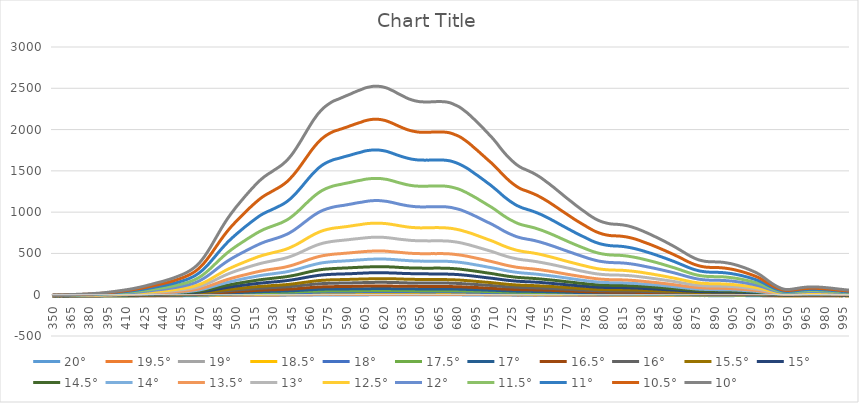
| Category | 20° | 19.5° | 19° | 18.5° | 18° | 17.5° | 17° | 16.5° | 16° | 15.5° | 15° | 14.5° | 14° | 13.5° | 13° | 12.5° | 12° | 11.5° | 11° | 10.5° | 10° |
|---|---|---|---|---|---|---|---|---|---|---|---|---|---|---|---|---|---|---|---|---|---|
| 350.0 | -14.12 | -13.06 | -13.47 | -14.27 | -15.23 | -12.29 | -13.53 | -12.34 | -11.98 | -10.71 | -12.75 | -11.33 | -9.83 | -10.75 | -7.95 | -10.6 | -8.52 | -8.73 | -7.92 | -4.6 | -3.1 |
| 351.0 | -13.4 | -13.62 | -12.17 | -12.87 | -13.31 | -12.71 | -11.76 | -13.88 | -12.12 | -12.04 | -11.78 | -10.11 | -9.74 | -11.48 | -10.71 | -9.3 | -8.31 | -6.99 | -4.18 | -4.71 | -3.92 |
| 352.0 | -12.77 | -13.93 | -12.12 | -12.86 | -11.66 | -11.99 | -12.03 | -10.67 | -12.13 | -11.35 | -10.86 | -11.17 | -10.57 | -8.08 | -8.22 | -8.61 | -6.39 | -5.67 | -5.34 | -3.62 | -1.31 |
| 353.0 | -15.87 | -14.71 | -15.8 | -16.76 | -14.29 | -12.58 | -13.43 | -13.05 | -13.61 | -13.51 | -14.03 | -11.54 | -11.85 | -9.96 | -9.48 | -8.54 | -10.51 | -8.49 | -6.8 | -4.38 | -3.21 |
| 354.0 | -14.12 | -13.88 | -15.52 | -12.59 | -13.76 | -11.77 | -12.15 | -12.26 | -12.67 | -11.52 | -10.52 | -10.05 | -10.63 | -9.02 | -10.3 | -8 | -7.07 | -7.08 | -5.34 | -3.76 | -3.27 |
| 355.0 | -13.75 | -11.49 | -12.72 | -14.1 | -13.72 | -11.17 | -12.41 | -10.61 | -12.85 | -11.52 | -10.76 | -10.37 | -10.99 | -9.19 | -8.16 | -8.68 | -6.35 | -5.72 | -3.61 | -1.74 | -1.97 |
| 356.0 | -14.75 | -14.93 | -12.93 | -14.52 | -14.4 | -13.66 | -12.28 | -12.63 | -11.14 | -9.34 | -11.79 | -11.2 | -9.72 | -10.8 | -9.21 | -9.75 | -6.76 | -6.54 | -4.06 | -3.68 | -3.2 |
| 357.0 | -15.14 | -15.33 | -14.71 | -14.51 | -15.45 | -13.01 | -14.16 | -12.75 | -12.87 | -13.17 | -11.63 | -12.29 | -11.07 | -12.54 | -8.02 | -9 | -7.21 | -6.91 | -5.08 | -3.59 | -4.48 |
| 358.0 | -15.31 | -14.47 | -13.71 | -14.72 | -14.58 | -14.17 | -14.89 | -14.73 | -13.41 | -13.1 | -11.59 | -11.94 | -11.24 | -10.42 | -7.7 | -10.43 | -8.12 | -6.58 | -5.95 | -2.91 | -3.84 |
| 359.0 | -13.37 | -14.84 | -11.93 | -13.97 | -13.81 | -12.65 | -10.67 | -13.48 | -12.01 | -10.49 | -13.4 | -11.95 | -10.54 | -9.7 | -10.14 | -7.52 | -6.99 | -5.34 | -6.18 | -2 | -0.93 |
| 360.0 | -13.91 | -13.7 | -13.19 | -13.52 | -13.01 | -12.35 | -12.28 | -12.02 | -11.83 | -11.23 | -11.28 | -10.64 | -9.74 | -9.66 | -7.98 | -8.09 | -6.41 | -5.21 | -3.55 | -1.9 | -0.22 |
| 361.0 | -13.94 | -13.72 | -13.23 | -13.44 | -12.94 | -12.37 | -12.31 | -12.02 | -11.88 | -11.26 | -11.26 | -10.64 | -9.59 | -9.54 | -8.05 | -7.98 | -6.23 | -4.96 | -3.26 | -1.67 | 0.12 |
| 362.0 | -13.96 | -13.72 | -13.21 | -13.47 | -12.91 | -12.31 | -12.31 | -11.9 | -11.79 | -11.18 | -11.17 | -10.62 | -9.62 | -9.32 | -7.79 | -7.77 | -6.08 | -4.65 | -3.05 | -1.29 | 0.58 |
| 363.0 | -13.84 | -13.6 | -13.24 | -13.43 | -12.87 | -12.23 | -12.23 | -11.92 | -11.7 | -11.1 | -11.08 | -10.54 | -9.48 | -9.25 | -7.6 | -7.54 | -5.76 | -4.41 | -2.61 | -0.83 | 0.93 |
| 364.0 | -13.74 | -13.49 | -13.06 | -13.26 | -12.88 | -12.26 | -12.17 | -11.9 | -11.57 | -11.01 | -10.98 | -10.42 | -9.33 | -9.12 | -7.48 | -7.43 | -5.52 | -4.06 | -2.2 | -0.58 | 1.28 |
| 365.0 | -13.66 | -13.4 | -12.95 | -13.23 | -12.85 | -12.3 | -12.1 | -11.9 | -11.5 | -10.96 | -10.88 | -10.33 | -9.26 | -9.05 | -7.35 | -7.37 | -5.3 | -3.82 | -1.94 | -0.28 | 1.77 |
| 366.0 | -13.66 | -13.43 | -12.86 | -13.12 | -12.72 | -12.35 | -12.09 | -11.86 | -11.33 | -10.88 | -10.83 | -10.21 | -9.13 | -8.85 | -7.23 | -7.13 | -4.98 | -3.52 | -1.65 | 0.02 | 2.3 |
| 367.0 | -13.68 | -13.42 | -13.01 | -13.03 | -12.7 | -12.29 | -12.16 | -11.86 | -11.42 | -10.88 | -10.84 | -10.18 | -9.11 | -8.77 | -7.13 | -6.92 | -4.82 | -3.36 | -1.5 | 0.32 | 2.75 |
| 368.0 | -13.57 | -13.27 | -12.91 | -12.92 | -12.55 | -12.19 | -12.01 | -11.84 | -11.25 | -10.7 | -10.81 | -10 | -8.86 | -8.56 | -7.1 | -6.72 | -4.4 | -3.07 | -1.14 | 0.72 | 3.43 |
| 369.0 | -13.5 | -13.29 | -12.99 | -12.89 | -12.5 | -12.13 | -11.84 | -11.73 | -11.19 | -10.63 | -10.76 | -9.8 | -8.69 | -8.47 | -7.06 | -6.56 | -4.14 | -2.76 | -0.75 | 1.07 | 4 |
| 370.0 | -13.6 | -13.19 | -13.06 | -12.79 | -12.34 | -12.1 | -11.83 | -11.59 | -11.15 | -10.65 | -10.48 | -9.63 | -8.57 | -8.34 | -6.81 | -6.38 | -3.84 | -2.44 | -0.18 | 1.53 | 4.59 |
| 371.0 | -13.62 | -13.1 | -12.99 | -12.64 | -12.27 | -12.24 | -11.87 | -11.52 | -10.95 | -10.61 | -10.25 | -9.59 | -8.5 | -8.11 | -6.65 | -6.06 | -3.57 | -2.11 | 0.27 | 1.99 | 5.11 |
| 372.0 | -13.52 | -13.18 | -12.98 | -12.61 | -12.29 | -12.23 | -11.9 | -11.63 | -10.84 | -10.61 | -10.18 | -9.45 | -8.51 | -7.95 | -6.54 | -5.94 | -3.47 | -1.73 | 0.56 | 2.46 | 5.57 |
| 373.0 | -13.29 | -12.91 | -12.69 | -12.51 | -12.03 | -12.05 | -11.75 | -11.48 | -10.52 | -10.37 | -10.02 | -9.24 | -8.24 | -7.72 | -6.18 | -5.65 | -2.89 | -1.25 | 1.21 | 3.22 | 6.31 |
| 374.0 | -13.28 | -12.89 | -12.71 | -12.47 | -11.96 | -11.98 | -11.64 | -11.37 | -10.45 | -10.23 | -9.92 | -9.14 | -7.97 | -7.47 | -5.86 | -5.33 | -2.52 | -0.8 | 1.67 | 3.86 | 7.01 |
| 375.0 | -13.4 | -12.97 | -12.86 | -12.63 | -12.18 | -12 | -11.69 | -11.58 | -10.59 | -10.21 | -9.93 | -9.12 | -8.1 | -7.31 | -5.91 | -5.03 | -2.52 | -0.55 | 2.02 | 4.32 | 7.56 |
| 376.0 | -13.54 | -12.96 | -13.01 | -12.68 | -12.32 | -12.1 | -11.76 | -11.56 | -10.72 | -10.37 | -9.95 | -9.15 | -8.14 | -7.35 | -5.83 | -4.92 | -2.4 | -0.3 | 2.57 | 4.97 | 8.02 |
| 377.0 | -13.51 | -12.95 | -13.02 | -12.71 | -12.35 | -12.18 | -11.75 | -11.62 | -10.66 | -10.3 | -9.88 | -9.05 | -7.87 | -7.2 | -5.69 | -4.74 | -1.99 | 0.24 | 3.06 | 5.65 | 8.66 |
| 378.0 | -13.32 | -12.91 | -12.88 | -12.61 | -12.24 | -12.15 | -11.51 | -11.45 | -10.44 | -10.11 | -9.75 | -8.67 | -7.64 | -6.9 | -5.3 | -4.44 | -1.5 | 0.8 | 3.7 | 6.41 | 9.63 |
| 379.0 | -13.36 | -12.9 | -12.96 | -12.71 | -12.19 | -12.17 | -11.58 | -11.46 | -10.46 | -10.12 | -9.58 | -8.52 | -7.51 | -6.71 | -5.11 | -4.2 | -1.14 | 1.26 | 4.26 | 7.02 | 10.44 |
| 380.0 | -13.44 | -12.9 | -12.98 | -12.7 | -12.27 | -12.14 | -11.65 | -11.33 | -10.25 | -10.11 | -9.4 | -8.44 | -7.32 | -6.46 | -4.96 | -3.95 | -0.64 | 1.64 | 4.87 | 7.82 | 11.26 |
| 381.0 | -13.47 | -12.92 | -13.16 | -12.91 | -12.54 | -12.3 | -11.79 | -11.48 | -10.39 | -10.29 | -9.38 | -8.45 | -7.25 | -6.48 | -4.91 | -3.83 | -0.34 | 1.97 | 5.35 | 8.61 | 12.05 |
| 382.0 | -13.41 | -12.89 | -13.01 | -12.91 | -12.51 | -12.27 | -11.63 | -11.35 | -10.21 | -10.09 | -9.03 | -8.3 | -7.15 | -6.26 | -4.58 | -3.4 | 0.06 | 2.62 | 6.02 | 9.56 | 13.02 |
| 383.0 | -13.4 | -12.87 | -12.99 | -12.82 | -12.46 | -12.28 | -11.57 | -11.39 | -10.2 | -9.99 | -8.93 | -8.21 | -6.88 | -6.27 | -4.31 | -3.15 | 0.67 | 3.03 | 6.64 | 10.22 | 13.77 |
| 384.0 | -13.52 | -12.94 | -12.99 | -12.82 | -12.49 | -12.36 | -11.65 | -11.37 | -10.16 | -10.01 | -8.86 | -8.06 | -6.75 | -6.19 | -4.16 | -2.92 | 0.93 | 3.54 | 7.08 | 10.8 | 14.73 |
| 385.0 | -13.44 | -12.98 | -12.95 | -12.7 | -12.34 | -12.2 | -11.58 | -11.29 | -9.99 | -9.77 | -8.62 | -7.84 | -6.55 | -6.01 | -3.83 | -2.53 | 1.54 | 4.16 | 7.83 | 11.78 | 15.89 |
| 386.0 | -13.48 | -13.05 | -13 | -12.76 | -12.37 | -12.27 | -11.5 | -11.21 | -9.94 | -9.72 | -8.59 | -7.83 | -6.38 | -5.79 | -3.56 | -2.2 | 1.92 | 4.83 | 8.53 | 12.77 | 16.87 |
| 387.0 | -13.44 | -12.97 | -13.06 | -12.76 | -12.41 | -12.13 | -11.37 | -11.11 | -9.89 | -9.69 | -8.5 | -7.61 | -6.04 | -5.69 | -3.29 | -1.89 | 2.28 | 5.39 | 9.4 | 13.71 | 17.94 |
| 388.0 | -13.33 | -12.83 | -12.85 | -12.79 | -12.36 | -12.18 | -11.29 | -11.08 | -9.73 | -9.69 | -8.32 | -7.37 | -5.79 | -5.39 | -2.95 | -1.6 | 2.88 | 6.22 | 10.41 | 14.76 | 18.99 |
| 389.0 | -13.38 | -12.87 | -12.83 | -12.8 | -12.41 | -12.21 | -11.3 | -11.1 | -9.74 | -9.69 | -8.26 | -7.31 | -5.73 | -5.12 | -2.67 | -1.33 | 3.27 | 6.85 | 11.22 | 15.68 | 20.17 |
| 390.0 | -13.44 | -12.77 | -12.64 | -12.71 | -12.31 | -12.16 | -11.25 | -10.97 | -9.49 | -9.59 | -8.04 | -7.23 | -5.47 | -4.78 | -2.23 | -0.76 | 3.9 | 7.73 | 12.26 | 16.93 | 21.65 |
| 391.0 | -13.36 | -12.86 | -12.58 | -12.71 | -12.49 | -12.12 | -11.21 | -11.04 | -9.34 | -9.46 | -8.02 | -6.96 | -5.18 | -4.55 | -1.94 | -0.3 | 4.47 | 8.46 | 13.02 | 17.93 | 23.01 |
| 392.0 | -13.35 | -12.9 | -12.67 | -12.68 | -12.52 | -12 | -10.97 | -10.96 | -9.32 | -9.37 | -7.97 | -6.72 | -4.92 | -4.28 | -1.59 | 0.11 | 4.98 | 9.09 | 13.95 | 19.11 | 24.39 |
| 393.0 | -13.48 | -12.94 | -12.77 | -12.64 | -12.51 | -12.1 | -10.92 | -10.9 | -9.45 | -9.23 | -7.95 | -6.66 | -4.77 | -4.02 | -1.2 | 0.6 | 5.66 | 9.93 | 15.02 | 20.34 | 25.94 |
| 394.0 | -13.61 | -13.09 | -12.86 | -12.59 | -12.6 | -12.21 | -10.91 | -10.87 | -9.55 | -9.18 | -7.69 | -6.56 | -4.51 | -3.79 | -0.92 | 1.16 | 6.16 | 10.76 | 16.05 | 21.6 | 27.62 |
| 395.0 | -13.71 | -13.1 | -12.9 | -12.5 | -12.61 | -12.26 | -10.95 | -10.9 | -9.5 | -8.98 | -7.66 | -6.27 | -4.39 | -3.47 | -0.68 | 1.71 | 6.68 | 11.63 | 17.12 | 22.88 | 29.19 |
| 396.0 | -13.7 | -13.13 | -12.89 | -12.42 | -12.57 | -12.16 | -10.88 | -10.86 | -9.37 | -8.82 | -7.36 | -6 | -4.03 | -3.1 | -0.14 | 2.28 | 7.53 | 12.54 | 18.43 | 24.3 | 31.13 |
| 397.0 | -13.45 | -13.12 | -12.84 | -12.29 | -12.49 | -12.07 | -10.64 | -10.82 | -9.14 | -8.58 | -7.02 | -5.61 | -3.62 | -2.59 | 0.37 | 2.82 | 8.44 | 13.63 | 19.83 | 25.82 | 33.13 |
| 398.0 | -13.36 | -13.09 | -12.71 | -12.22 | -12.4 | -11.88 | -10.42 | -10.67 | -9.01 | -8.3 | -6.7 | -5.22 | -3.31 | -2.18 | 0.96 | 3.56 | 9.15 | 14.66 | 21.27 | 27.49 | 34.91 |
| 399.0 | -13.66 | -13.26 | -12.98 | -12.47 | -12.61 | -11.97 | -10.69 | -10.75 | -9.18 | -8.4 | -6.64 | -5.22 | -3.25 | -2.01 | 1.2 | 3.91 | 9.73 | 15.46 | 22.3 | 29.02 | 36.45 |
| 400.0 | -13.51 | -13.21 | -12.88 | -12.28 | -12.67 | -11.84 | -10.51 | -10.53 | -8.9 | -8.06 | -6.34 | -4.94 | -2.8 | -1.62 | 1.86 | 4.68 | 10.72 | 16.57 | 23.81 | 30.76 | 38.42 |
| 401.0 | -13.36 | -13.23 | -12.87 | -12.3 | -12.66 | -11.75 | -10.46 | -10.5 | -8.81 | -7.78 | -6.23 | -4.59 | -2.54 | -1.43 | 2.5 | 5.42 | 11.52 | 17.8 | 25.16 | 32.53 | 40.44 |
| 402.0 | -13.4 | -13.24 | -12.8 | -12.12 | -12.47 | -11.65 | -10.3 | -10.26 | -8.59 | -7.42 | -6.04 | -4.3 | -2.18 | -0.85 | 3.25 | 6.21 | 12.45 | 19.13 | 26.73 | 34.37 | 42.66 |
| 403.0 | -13.36 | -13.28 | -12.91 | -12.13 | -12.47 | -11.65 | -10.28 | -10.2 | -8.45 | -7.39 | -5.94 | -4 | -1.91 | -0.56 | 3.8 | 6.84 | 13.2 | 20.26 | 28.29 | 36.05 | 44.57 |
| 404.0 | -13.29 | -13.3 | -12.89 | -12.11 | -12.47 | -11.63 | -10.17 | -10.02 | -8.38 | -7.21 | -5.75 | -3.7 | -1.57 | -0.03 | 4.28 | 7.6 | 13.94 | 21.53 | 29.79 | 37.81 | 46.76 |
| 405.0 | -13.35 | -13.34 | -12.92 | -12.05 | -12.64 | -11.67 | -10.14 | -9.89 | -8.26 | -6.91 | -5.47 | -3.54 | -1.33 | 0.42 | 4.86 | 8.26 | 14.84 | 22.72 | 31.31 | 39.62 | 48.8 |
| 406.0 | -13.23 | -13.3 | -12.85 | -12.08 | -12.57 | -11.6 | -10 | -9.73 | -8.23 | -6.66 | -5.24 | -3.2 | -0.95 | 0.94 | 5.51 | 9.02 | 15.87 | 24 | 32.91 | 41.58 | 51 |
| 407.0 | -13.19 | -13.26 | -12.79 | -12.02 | -12.39 | -11.47 | -9.95 | -9.63 | -8.06 | -6.4 | -5.06 | -2.74 | -0.51 | 1.33 | 6.19 | 9.68 | 16.82 | 25.1 | 34.23 | 43.31 | 53.17 |
| 408.0 | -13.21 | -13.39 | -12.86 | -11.92 | -12.36 | -11.55 | -9.9 | -9.66 | -7.95 | -6.24 | -4.81 | -2.45 | -0.25 | 1.82 | 6.72 | 10.38 | 17.67 | 26.2 | 35.6 | 45.08 | 55.28 |
| 409.0 | -13.17 | -13.45 | -12.85 | -11.74 | -12.36 | -11.38 | -9.78 | -9.38 | -7.68 | -5.93 | -4.45 | -2.11 | 0.21 | 2.38 | 7.45 | 11.27 | 18.63 | 27.43 | 37.13 | 47.11 | 57.7 |
| 410.0 | -13.04 | -13.39 | -12.79 | -11.72 | -12.2 | -11.32 | -9.58 | -9.03 | -7.49 | -5.62 | -4.07 | -1.7 | 0.67 | 2.82 | 8.22 | 12.15 | 19.65 | 28.63 | 38.71 | 49.08 | 59.9 |
| 411.0 | -12.95 | -13.44 | -12.81 | -11.67 | -12.17 | -11.25 | -9.6 | -8.94 | -7.52 | -5.4 | -3.82 | -1.34 | 0.9 | 3.3 | 8.8 | 12.96 | 20.63 | 29.71 | 40.21 | 50.87 | 62.07 |
| 412.0 | -12.83 | -13.3 | -12.9 | -11.63 | -12.1 | -11.18 | -9.52 | -8.72 | -7.46 | -5.31 | -3.46 | -1.05 | 1.33 | 3.85 | 9.62 | 13.82 | 21.65 | 31.05 | 41.96 | 52.79 | 64.44 |
| 413.0 | -12.75 | -13.2 | -12.65 | -11.63 | -11.89 | -11.02 | -9.58 | -8.58 | -7.17 | -5.12 | -3.12 | -0.72 | 1.84 | 4.4 | 10.43 | 14.65 | 22.9 | 32.61 | 43.7 | 54.82 | 66.91 |
| 414.0 | -12.65 | -13.17 | -12.69 | -11.57 | -11.92 | -10.92 | -9.53 | -8.4 | -6.91 | -4.96 | -2.83 | -0.33 | 2.36 | 5 | 11.01 | 15.57 | 24.06 | 33.99 | 45.53 | 56.91 | 69.45 |
| 415.0 | -12.44 | -13.09 | -12.54 | -11.42 | -11.83 | -10.62 | -9.18 | -8.03 | -6.61 | -4.63 | -2.63 | 0.21 | 2.9 | 5.79 | 11.99 | 16.48 | 25.35 | 35.54 | 47.42 | 59.3 | 72.25 |
| 416.0 | -12.31 | -13.03 | -12.36 | -11.43 | -11.68 | -10.55 | -9.01 | -7.88 | -6.34 | -4.43 | -2.23 | 0.63 | 3.42 | 6.33 | 12.98 | 17.33 | 26.81 | 37.13 | 49.41 | 61.75 | 75.32 |
| 417.0 | -12.11 | -12.85 | -12.32 | -11.36 | -11.58 | -10.54 | -8.8 | -7.58 | -6 | -4.2 | -1.9 | 1 | 3.98 | 6.96 | 13.74 | 18.44 | 28.2 | 38.89 | 51.4 | 64.43 | 78.31 |
| 418.0 | -12.26 | -12.75 | -12.18 | -11.25 | -11.55 | -10.41 | -8.86 | -7.4 | -5.89 | -4.13 | -1.75 | 1.36 | 4.36 | 7.44 | 14.46 | 19.52 | 29.45 | 40.43 | 53.32 | 66.96 | 81.21 |
| 419.0 | -12.21 | -12.72 | -12.26 | -11.09 | -11.42 | -10.21 | -8.81 | -7.18 | -5.7 | -3.92 | -1.34 | 1.74 | 4.89 | 8.12 | 15.26 | 20.52 | 30.95 | 41.99 | 55.32 | 69.44 | 84.37 |
| 420.0 | -12.13 | -12.55 | -12.07 | -10.91 | -11.25 | -10.09 | -8.56 | -6.97 | -5.4 | -3.61 | -0.96 | 2.24 | 5.52 | 8.81 | 16.24 | 21.75 | 32.4 | 43.74 | 57.66 | 71.99 | 87.47 |
| 421.0 | -12.14 | -12.5 | -12.01 | -10.88 | -10.98 | -9.93 | -8.5 | -6.81 | -5.2 | -3.42 | -0.66 | 2.69 | 6 | 9.57 | 17.15 | 23.02 | 33.77 | 45.62 | 59.86 | 74.84 | 90.67 |
| 422.0 | -12.17 | -12.35 | -11.96 | -10.74 | -10.93 | -9.89 | -8.31 | -6.62 | -4.89 | -3.18 | -0.33 | 3.11 | 6.53 | 10.46 | 18.13 | 24.06 | 35.53 | 47.35 | 62.23 | 77.72 | 94.02 |
| 423.0 | -12.32 | -12.37 | -11.94 | -10.83 | -10.95 | -9.91 | -8.23 | -6.54 | -4.77 | -3.05 | 0 | 3.54 | 7.02 | 10.98 | 18.82 | 25.17 | 36.91 | 48.87 | 64.41 | 80.39 | 97.14 |
| 424.0 | -12.23 | -12.21 | -11.73 | -10.67 | -10.7 | -9.73 | -7.99 | -6.29 | -4.45 | -2.58 | 0.35 | 4.1 | 7.67 | 11.88 | 19.85 | 26.42 | 38.56 | 50.82 | 66.77 | 83.33 | 100.77 |
| 425.0 | -12.29 | -12.11 | -11.73 | -10.6 | -10.58 | -9.49 | -8 | -6.13 | -4.05 | -2.34 | 0.75 | 4.74 | 8.32 | 12.72 | 20.71 | 27.54 | 40.33 | 52.7 | 69.26 | 86.42 | 104.54 |
| 426.0 | -12.13 | -11.95 | -11.52 | -10.54 | -10.3 | -9.19 | -7.59 | -5.82 | -3.74 | -2.08 | 1.15 | 5.49 | 9.08 | 13.71 | 21.71 | 28.8 | 42.1 | 54.62 | 71.86 | 89.58 | 108.44 |
| 427.0 | -12.35 | -11.92 | -11.51 | -10.51 | -10.21 | -9.25 | -7.49 | -5.62 | -3.56 | -1.96 | 1.52 | 5.84 | 9.56 | 14.47 | 22.45 | 30.04 | 43.64 | 56.39 | 74.29 | 92.37 | 112.04 |
| 428.0 | -12.33 | -11.87 | -11.44 | -10.37 | -10.14 | -9.09 | -7.42 | -5.35 | -3.35 | -1.73 | 2.01 | 6.29 | 10.29 | 15.31 | 23.4 | 31.31 | 45.37 | 58.45 | 77.23 | 95.57 | 116.05 |
| 429.0 | -12.24 | -11.76 | -11.31 | -10.35 | -10.1 | -8.92 | -7.41 | -5.09 | -3.14 | -1.39 | 2.43 | 6.68 | 10.91 | 16.07 | 24.43 | 32.56 | 47.06 | 60.59 | 79.78 | 98.61 | 119.66 |
| 430.0 | -12.35 | -11.68 | -11.29 | -10.39 | -10.01 | -8.85 | -7.21 | -5.05 | -3 | -1.29 | 2.73 | 7.06 | 11.42 | 16.71 | 25.32 | 33.61 | 48.69 | 62.55 | 82.35 | 101.41 | 123.25 |
| 431.0 | -12.53 | -11.78 | -11.35 | -10.41 | -10.08 | -8.78 | -7.23 | -5.05 | -2.85 | -1.19 | 3.11 | 7.43 | 12 | 17.61 | 26.45 | 34.93 | 50.24 | 64.86 | 84.93 | 104.78 | 127.39 |
| 432.0 | -12.54 | -11.76 | -11.4 | -10.35 | -9.98 | -8.69 | -7.05 | -4.94 | -2.57 | -0.96 | 3.5 | 7.87 | 12.66 | 18.41 | 27.46 | 36.16 | 52.06 | 66.92 | 87.63 | 108.14 | 131.45 |
| 433.0 | -12.46 | -11.67 | -11.07 | -10.2 | -9.73 | -8.46 | -6.84 | -4.61 | -2.08 | -0.39 | 3.99 | 8.5 | 13.33 | 19.2 | 28.63 | 37.52 | 53.87 | 69.13 | 90.63 | 111.78 | 135.66 |
| 434.0 | -12.45 | -11.59 | -11.16 | -10.16 | -9.77 | -8.34 | -6.6 | -4.44 | -1.94 | -0.17 | 4.4 | 9.09 | 13.9 | 19.88 | 29.66 | 38.82 | 55.61 | 71.33 | 93.52 | 115.15 | 139.7 |
| 435.0 | -12.37 | -11.48 | -10.94 | -10.16 | -9.65 | -8.13 | -6.38 | -4.17 | -1.6 | 0.23 | 4.97 | 9.73 | 14.51 | 20.78 | 30.89 | 40.18 | 57.34 | 73.45 | 96.25 | 118.57 | 143.45 |
| 436.0 | -12.52 | -11.5 | -10.91 | -10.18 | -9.5 | -8.01 | -6.26 | -4.07 | -1.33 | 0.57 | 5.47 | 10.27 | 15.26 | 21.6 | 31.95 | 41.63 | 59.04 | 75.82 | 99.04 | 121.92 | 147.53 |
| 437.0 | -12.52 | -11.49 | -10.83 | -10.14 | -9.46 | -7.82 | -6.05 | -3.82 | -1.02 | 0.95 | 5.91 | 10.69 | 15.9 | 22.43 | 32.8 | 42.88 | 60.67 | 77.97 | 101.67 | 125.03 | 150.93 |
| 438.0 | -12.66 | -11.62 | -10.72 | -10.13 | -9.37 | -7.73 | -6 | -3.65 | -0.86 | 1.29 | 6.24 | 11.16 | 16.46 | 23.2 | 33.9 | 43.96 | 62.33 | 80.11 | 104.2 | 128.19 | 154.45 |
| 439.0 | -12.65 | -11.75 | -10.78 | -10.27 | -9.32 | -7.71 | -5.94 | -3.39 | -0.52 | 1.7 | 6.83 | 11.64 | 17.22 | 24.06 | 34.96 | 45.2 | 64.1 | 82.22 | 106.98 | 131.28 | 158.46 |
| 440.0 | -12.72 | -11.68 | -10.77 | -10.33 | -9.22 | -7.71 | -5.79 | -3.17 | -0.34 | 1.91 | 7.2 | 12.13 | 17.89 | 24.81 | 36.11 | 46.41 | 65.83 | 84.46 | 109.57 | 134.63 | 162.62 |
| 441.0 | -12.64 | -11.67 | -10.75 | -10.24 | -9.1 | -7.52 | -5.59 | -2.87 | -0.06 | 2.26 | 7.61 | 12.74 | 18.66 | 25.75 | 37.22 | 47.77 | 67.62 | 86.93 | 112.35 | 138.25 | 167.04 |
| 442.0 | -12.73 | -11.67 | -10.83 | -10.25 | -9.15 | -7.48 | -5.44 | -2.83 | 0.01 | 2.52 | 8.05 | 13.23 | 19.38 | 26.49 | 38.3 | 48.86 | 69.5 | 89.05 | 115.27 | 141.77 | 171.31 |
| 443.0 | -12.69 | -11.57 | -10.6 | -10.18 | -8.91 | -7.31 | -5.18 | -2.55 | 0.27 | 3 | 8.6 | 13.93 | 20.27 | 27.35 | 39.43 | 50.3 | 71.52 | 91.55 | 118.27 | 145.19 | 175.79 |
| 444.0 | -12.48 | -11.48 | -10.47 | -9.99 | -8.78 | -6.97 | -5.01 | -2.29 | 0.61 | 3.47 | 9.13 | 14.71 | 21.14 | 28.31 | 40.92 | 51.79 | 73.79 | 94.38 | 121.78 | 149.37 | 180.66 |
| 445.0 | -12.52 | -11.47 | -10.52 | -9.92 | -8.64 | -6.76 | -4.88 | -2.01 | 0.82 | 3.78 | 9.65 | 15.34 | 22.13 | 29.32 | 42.16 | 53.51 | 76 | 96.75 | 124.93 | 153.14 | 185.14 |
| 446.0 | -12.46 | -11.45 | -10.5 | -9.92 | -8.47 | -6.62 | -4.48 | -1.74 | 1.21 | 4.2 | 10.34 | 15.96 | 22.97 | 30.37 | 43.81 | 55.22 | 78.3 | 99.49 | 128.19 | 157.55 | 190.23 |
| 447.0 | -12.52 | -11.43 | -10.54 | -9.9 | -8.4 | -6.59 | -4.45 | -1.57 | 1.53 | 4.65 | 10.89 | 16.64 | 23.81 | 31.25 | 45.24 | 56.91 | 80.47 | 102.62 | 131.58 | 161.86 | 195.07 |
| 448.0 | -12.43 | -11.51 | -10.59 | -9.92 | -8.34 | -6.45 | -4.38 | -1.35 | 1.95 | 5.03 | 11.49 | 17.28 | 24.68 | 32.21 | 46.85 | 58.56 | 82.54 | 105.46 | 135.16 | 166.31 | 200.15 |
| 449.0 | -12.45 | -11.59 | -10.53 | -9.83 | -8.32 | -6.39 | -4.22 | -1.14 | 2.32 | 5.46 | 12.09 | 17.99 | 25.54 | 33.26 | 48.4 | 60.64 | 84.82 | 108.66 | 138.89 | 170.89 | 205.14 |
| 450.0 | -12.55 | -11.61 | -10.52 | -9.85 | -8.12 | -6.27 | -3.99 | -0.88 | 2.66 | 5.93 | 12.68 | 18.66 | 26.38 | 34.38 | 49.86 | 62.52 | 87.16 | 111.59 | 142.64 | 175.22 | 210.55 |
| 451.0 | -12.37 | -11.53 | -10.47 | -9.72 | -7.88 | -6.08 | -3.79 | -0.43 | 3.04 | 6.5 | 13.42 | 19.54 | 27.45 | 35.65 | 51.55 | 64.74 | 89.65 | 114.71 | 146.58 | 180.14 | 216.25 |
| 452.0 | -12.17 | -11.38 | -10.34 | -9.59 | -7.62 | -5.82 | -3.4 | -0.04 | 3.54 | 7.25 | 14.1 | 20.42 | 28.58 | 36.84 | 53.04 | 66.92 | 92.46 | 118.02 | 151.01 | 185.22 | 221.93 |
| 453.0 | -12.08 | -11.14 | -10.12 | -9.4 | -7.34 | -5.55 | -3 | 0.37 | 4.05 | 8.03 | 14.94 | 21.4 | 29.88 | 38.16 | 54.89 | 69.13 | 95.2 | 121.48 | 155.21 | 190.23 | 227.82 |
| 454.0 | -12.17 | -11.1 | -10.21 | -9.47 | -7.29 | -5.45 | -2.84 | 0.57 | 4.39 | 8.47 | 15.48 | 22.02 | 30.83 | 39.53 | 56.18 | 71.1 | 97.88 | 124.79 | 158.99 | 194.99 | 233.35 |
| 455.0 | -12.01 | -11.16 | -10.01 | -9.31 | -7.17 | -5.27 | -2.64 | 0.95 | 4.92 | 9.16 | 16.26 | 22.95 | 32.01 | 40.96 | 57.91 | 73.36 | 100.74 | 128.34 | 163.42 | 200.31 | 239.42 |
| 456.0 | -12.03 | -11.16 | -9.97 | -9.15 | -7.05 | -5.11 | -2.39 | 1.17 | 5.3 | 9.54 | 17.03 | 23.68 | 33.18 | 42.22 | 59.68 | 75.62 | 103.81 | 132.08 | 167.78 | 205.78 | 246.02 |
| 457.0 | -11.9 | -10.96 | -9.87 | -8.88 | -6.88 | -4.94 | -2.23 | 1.49 | 5.65 | 10.1 | 17.75 | 24.57 | 34.26 | 43.52 | 61.53 | 77.81 | 106.75 | 135.67 | 172.21 | 211.25 | 252.32 |
| 458.0 | -11.93 | -10.91 | -9.85 | -8.76 | -6.83 | -4.79 | -2.08 | 1.78 | 6.02 | 10.57 | 18.5 | 25.63 | 35.46 | 44.97 | 63.5 | 80.22 | 109.97 | 139.37 | 177.26 | 217.57 | 259.68 |
| 459.0 | -11.81 | -10.78 | -9.84 | -8.57 | -6.7 | -4.5 | -1.78 | 2.03 | 6.52 | 11.04 | 19.48 | 26.75 | 36.77 | 46.53 | 65.47 | 82.8 | 113.3 | 143.54 | 182.32 | 223.67 | 267.03 |
| 460.0 | -11.83 | -10.71 | -9.78 | -8.45 | -6.56 | -4.25 | -1.47 | 2.4 | 7.05 | 11.7 | 20.3 | 27.85 | 38.02 | 48.28 | 67.68 | 85.27 | 116.92 | 148.13 | 187.49 | 230.08 | 274.62 |
| 461.0 | -11.84 | -10.73 | -9.72 | -8.37 | -6.56 | -4.13 | -1.22 | 2.63 | 7.57 | 12.29 | 21.23 | 28.95 | 39.47 | 49.99 | 69.99 | 88.08 | 120.82 | 152.96 | 193.5 | 237.08 | 282.81 |
| 462.0 | -11.73 | -10.56 | -9.58 | -8.21 | -6.33 | -3.81 | -0.94 | 3.04 | 8.35 | 13 | 22.33 | 30.28 | 41.01 | 51.86 | 72.42 | 91.26 | 125.01 | 157.94 | 199.78 | 244.57 | 291.53 |
| 463.0 | -11.64 | -10.54 | -9.46 | -8.05 | -6.14 | -3.53 | -0.49 | 3.67 | 9.2 | 13.85 | 23.48 | 31.7 | 42.69 | 53.95 | 75 | 94.73 | 129.39 | 163.7 | 206.43 | 252.57 | 301.06 |
| 464.0 | -11.6 | -10.61 | -9.49 | -7.9 | -5.96 | -3.27 | -0.26 | 4.11 | 9.83 | 14.6 | 24.63 | 33.1 | 44.64 | 56.27 | 77.79 | 98.31 | 133.83 | 169.5 | 213.58 | 261.21 | 311.19 |
| 465.0 | -11.66 | -10.69 | -9.4 | -7.82 | -5.69 | -3.2 | 0.08 | 4.49 | 10.64 | 15.38 | 25.79 | 34.51 | 46.5 | 58.57 | 80.62 | 102.18 | 138.67 | 175.58 | 220.93 | 270.02 | 322 |
| 466.0 | -11.62 | -10.76 | -9.32 | -7.66 | -5.65 | -3.09 | 0.49 | 4.89 | 11.26 | 16.3 | 27.06 | 36.01 | 48.3 | 60.87 | 83.79 | 106.06 | 143.89 | 182.22 | 229.16 | 279.81 | 333.64 |
| 467.0 | -11.5 | -10.71 | -9.18 | -7.4 | -5.52 | -2.85 | 0.77 | 5.42 | 12.1 | 17.22 | 28.31 | 37.68 | 50.6 | 63.41 | 87.07 | 110.37 | 149.51 | 189.44 | 238.17 | 290.27 | 345.9 |
| 468.0 | -11.52 | -10.64 | -9.03 | -7.16 | -5.13 | -2.45 | 1.3 | 6.1 | 13.08 | 18.43 | 29.82 | 39.77 | 53.29 | 66.42 | 90.97 | 115.23 | 155.9 | 196.93 | 248.14 | 302.14 | 359.92 |
| 469.0 | -11.44 | -10.47 | -8.9 | -6.89 | -4.89 | -1.96 | 1.94 | 6.75 | 13.97 | 19.76 | 31.43 | 41.85 | 55.88 | 69.4 | 94.98 | 120.29 | 162.87 | 205.49 | 258.31 | 314.35 | 374.68 |
| 470.0 | -11.52 | -10.26 | -8.83 | -6.81 | -4.61 | -1.65 | 2.36 | 7.4 | 14.9 | 20.84 | 33.08 | 44.02 | 58.48 | 72.65 | 99.31 | 125.48 | 170.02 | 214.23 | 269.37 | 327.79 | 390.36 |
| 471.0 | -11.42 | -10.28 | -8.69 | -6.59 | -4.34 | -1.29 | 2.96 | 8.09 | 15.99 | 22.22 | 34.89 | 46.43 | 61.43 | 76.2 | 104.2 | 131.44 | 177.85 | 223.9 | 281.27 | 342.4 | 407.76 |
| 472.0 | -11.36 | -10.17 | -8.56 | -6.28 | -4.07 | -0.91 | 3.58 | 8.77 | 17.06 | 23.74 | 36.71 | 48.94 | 64.58 | 79.98 | 109.21 | 137.6 | 186.05 | 234.16 | 293.73 | 357.78 | 426.06 |
| 473.0 | -11.13 | -9.98 | -8.29 | -5.86 | -3.55 | -0.42 | 4.24 | 9.75 | 18.39 | 25.42 | 38.89 | 51.77 | 68.05 | 84.32 | 114.86 | 144.29 | 195.01 | 245.34 | 307.09 | 374.1 | 445.54 |
| 474.0 | -11.18 | -10.02 | -8.21 | -5.69 | -3.43 | 0.02 | 4.7 | 10.6 | 19.59 | 26.81 | 40.82 | 54.56 | 71.35 | 88.45 | 120.42 | 151.18 | 204.08 | 256.95 | 321.36 | 391.45 | 465.72 |
| 475.0 | -11.12 | -9.96 | -8.02 | -5.32 | -2.96 | 0.55 | 5.5 | 11.44 | 20.88 | 28.56 | 43.03 | 57.46 | 74.99 | 92.88 | 126.57 | 158.52 | 213.66 | 268.62 | 336.28 | 409.44 | 487.23 |
| 476.0 | -11.19 | -9.85 | -7.84 | -5 | -2.36 | 1.17 | 6.32 | 12.4 | 22.13 | 30.37 | 45.5 | 60.34 | 79.02 | 97.56 | 132.84 | 166.1 | 223.77 | 281.11 | 351.54 | 428.35 | 509.96 |
| 477.0 | -11.11 | -9.66 | -7.71 | -4.85 | -1.95 | 1.66 | 7.11 | 13.47 | 23.59 | 32.24 | 47.9 | 63.49 | 82.95 | 102.39 | 139.13 | 174.06 | 234.15 | 294.17 | 367.43 | 447.79 | 533.05 |
| 478.0 | -11.05 | -9.59 | -7.49 | -4.8 | -1.65 | 2.03 | 7.89 | 14.42 | 25.07 | 34.16 | 50.33 | 66.58 | 87.01 | 107.52 | 145.6 | 182.39 | 244.88 | 307.23 | 384.01 | 467.62 | 556.95 |
| 479.0 | -10.92 | -9.37 | -7.14 | -4.47 | -1.06 | 2.85 | 8.85 | 15.6 | 26.71 | 36.1 | 52.95 | 70.05 | 91.37 | 112.79 | 152.59 | 190.87 | 256.01 | 321.27 | 401.11 | 488.08 | 581.41 |
| 480.0 | -10.87 | -9.18 | -6.87 | -4.26 | -0.5 | 3.5 | 9.75 | 16.8 | 28.25 | 38.12 | 55.49 | 73.24 | 95.72 | 117.99 | 159.63 | 199.49 | 267.33 | 334.95 | 418.5 | 508.91 | 606.6 |
| 481.0 | -10.74 | -9.01 | -6.58 | -3.81 | 0.1 | 4.13 | 10.7 | 17.94 | 29.87 | 40.19 | 58.22 | 76.67 | 100.26 | 123.18 | 166.98 | 208.47 | 278.66 | 349.3 | 436.44 | 530.72 | 632.42 |
| 482.0 | -10.65 | -8.93 | -6.42 | -3.45 | 0.71 | 4.73 | 11.53 | 19.09 | 31.5 | 42.4 | 60.79 | 80.14 | 104.5 | 128.7 | 174.24 | 217.33 | 290.08 | 363.81 | 453.88 | 552.27 | 658.03 |
| 483.0 | -10.54 | -8.8 | -6.07 | -3.1 | 1.22 | 5.34 | 12.53 | 20.32 | 32.95 | 44.55 | 63.44 | 83.56 | 108.86 | 134.2 | 181.57 | 225.96 | 301.67 | 378.02 | 471.45 | 573.51 | 684.02 |
| 484.0 | -10.43 | -8.64 | -5.78 | -2.71 | 1.75 | 5.99 | 13.42 | 21.43 | 34.58 | 46.57 | 66.03 | 87.04 | 113.27 | 139.71 | 188.99 | 234.83 | 313.48 | 392.06 | 489.28 | 595.26 | 709.81 |
| 485.0 | -10.34 | -8.64 | -5.68 | -2.36 | 2.15 | 6.51 | 14.23 | 22.52 | 36 | 48.54 | 68.65 | 90.53 | 117.42 | 145.2 | 196.19 | 243.5 | 324.86 | 406.38 | 507.04 | 616.82 | 735.54 |
| 486.0 | -10.18 | -8.48 | -5.5 | -2.09 | 2.52 | 7.18 | 15.05 | 23.66 | 37.41 | 50.65 | 71.44 | 93.98 | 121.92 | 150.71 | 203.44 | 251.97 | 336.35 | 420.46 | 524.61 | 638.28 | 760.97 |
| 487.0 | -9.99 | -8.22 | -5.25 | -1.81 | 3.06 | 7.93 | 15.85 | 24.86 | 39.15 | 52.4 | 74.23 | 97.44 | 126.28 | 156.09 | 210.57 | 260.61 | 347.81 | 434.76 | 541.97 | 659.86 | 786.75 |
| 488.0 | -9.94 | -8.01 | -5.06 | -1.46 | 3.61 | 8.59 | 16.58 | 26.04 | 40.57 | 54.32 | 76.76 | 100.72 | 130.32 | 161.42 | 217.62 | 268.88 | 358.81 | 448.43 | 558.83 | 680.47 | 811.48 |
| 489.0 | -9.73 | -7.81 | -4.9 | -1.23 | 4.03 | 9.11 | 17.35 | 27.08 | 42.08 | 55.99 | 79.31 | 103.64 | 134.28 | 166.46 | 224.5 | 277.1 | 369.39 | 461.88 | 575.46 | 700.47 | 835.47 |
| 490.0 | -9.47 | -7.64 | -4.65 | -0.7 | 4.53 | 9.67 | 18.17 | 28.26 | 43.72 | 57.83 | 81.91 | 107.11 | 138.61 | 171.66 | 231.35 | 285.36 | 379.9 | 475.08 | 592.08 | 720.38 | 859.7 |
| 491.0 | -9.16 | -7.56 | -4.37 | -0.32 | 5.01 | 10.5 | 19.09 | 29.28 | 45.27 | 59.88 | 84.46 | 110.45 | 142.78 | 176.58 | 237.97 | 293.52 | 390.34 | 488.12 | 607.93 | 739.64 | 883.23 |
| 492.0 | -9 | -7.31 | -4.19 | 0.05 | 5.51 | 11.07 | 19.94 | 30.26 | 46.68 | 61.6 | 86.95 | 113.45 | 146.98 | 181.36 | 244.13 | 301.16 | 400.48 | 500.74 | 623.85 | 758.64 | 905.79 |
| 493.0 | -9.04 | -7.21 | -3.97 | 0.23 | 5.89 | 11.71 | 20.56 | 31.28 | 48.19 | 63.17 | 89.31 | 116.38 | 150.93 | 186.18 | 250.44 | 308.71 | 410.46 | 513 | 639.31 | 777.11 | 927.89 |
| 494.0 | -9.2 | -7.2 | -3.86 | 0.42 | 6.06 | 12.16 | 21.22 | 32.04 | 49.39 | 64.64 | 91.41 | 119.19 | 154.48 | 190.31 | 256.2 | 315.55 | 419.47 | 524.3 | 653.74 | 794.72 | 948.97 |
| 495.0 | -8.86 | -6.97 | -3.47 | 0.83 | 6.65 | 12.77 | 22.14 | 33.02 | 50.76 | 66.43 | 93.74 | 122.01 | 158.22 | 195.03 | 262.27 | 322.38 | 428.88 | 535.88 | 667.86 | 812.15 | 969.63 |
| 496.0 | -8.67 | -6.82 | -3.35 | 1.05 | 6.94 | 13.23 | 22.63 | 34.11 | 51.97 | 67.95 | 95.95 | 124.86 | 161.64 | 199.27 | 268.03 | 329.17 | 437.98 | 547.2 | 681.77 | 829.15 | 989.59 |
| 497.0 | -8.46 | -6.64 | -3.18 | 1.39 | 7.32 | 13.7 | 23.25 | 35.1 | 53.29 | 69.53 | 98.1 | 127.63 | 165.06 | 203.54 | 273.42 | 335.9 | 446.45 | 558.07 | 695.26 | 845.26 | 1009.07 |
| 498.0 | -8.45 | -6.53 | -2.91 | 1.87 | 7.69 | 14.22 | 23.88 | 35.98 | 54.6 | 70.8 | 100.18 | 130.27 | 168.46 | 207.56 | 278.76 | 342.67 | 454.78 | 568.66 | 708.56 | 860.9 | 1028.67 |
| 499.0 | -8.3 | -6.31 | -2.77 | 2.28 | 8.1 | 14.73 | 24.57 | 37.04 | 55.87 | 72.27 | 102.29 | 133.04 | 171.87 | 211.53 | 284.19 | 349.03 | 463.43 | 579.26 | 721.69 | 876.91 | 1048.02 |
| 500.0 | -8.19 | -6.29 | -2.71 | 2.63 | 8.43 | 15 | 25.16 | 37.95 | 57.07 | 73.83 | 104.33 | 135.44 | 174.91 | 215.44 | 289.39 | 355.31 | 471.57 | 589.48 | 734.4 | 891.99 | 1066.66 |
| 501.0 | -7.97 | -6.19 | -2.61 | 2.9 | 8.78 | 15.44 | 25.75 | 39.02 | 58.3 | 75.56 | 106.56 | 138.17 | 178.19 | 219.58 | 294.49 | 361.65 | 480.06 | 599.61 | 747.69 | 907.78 | 1085.07 |
| 502.0 | -7.8 | -6.07 | -2.42 | 3.12 | 9.1 | 15.9 | 26.24 | 39.89 | 59.29 | 76.93 | 108.3 | 140.75 | 181.08 | 223.44 | 299.27 | 368.05 | 487.82 | 609.36 | 759.67 | 922.53 | 1102.4 |
| 503.0 | -7.69 | -5.89 | -2.16 | 3.29 | 9.48 | 16.36 | 26.96 | 40.89 | 60.45 | 78.42 | 110.29 | 143.22 | 184.41 | 227.25 | 304.23 | 374.23 | 495.75 | 618.86 | 772.44 | 937.51 | 1120.94 |
| 504.0 | -7.71 | -5.96 | -2.24 | 3.44 | 9.64 | 16.67 | 27.39 | 41.5 | 61.52 | 79.78 | 112.21 | 145.61 | 187.65 | 230.77 | 309.02 | 380.12 | 503.69 | 628.67 | 784.8 | 952.9 | 1138.28 |
| 505.0 | -7.63 | -5.95 | -2.1 | 3.61 | 9.85 | 17.11 | 27.91 | 42.24 | 62.53 | 81.14 | 114.25 | 147.98 | 190.77 | 234.44 | 313.62 | 385.9 | 510.96 | 638.43 | 797.18 | 967.79 | 1155.99 |
| 506.0 | -7.51 | -5.73 | -1.83 | 3.89 | 10.23 | 17.56 | 28.49 | 43.13 | 63.83 | 82.57 | 116.19 | 150.26 | 193.95 | 237.96 | 318.44 | 392.29 | 518.79 | 647.98 | 809.6 | 982.75 | 1173.58 |
| 507.0 | -7.49 | -5.51 | -1.64 | 4.21 | 10.58 | 18.03 | 29.15 | 43.97 | 64.95 | 83.83 | 118.14 | 152.78 | 196.91 | 241.46 | 323.23 | 398.34 | 526.74 | 657.83 | 821.99 | 997.61 | 1191.35 |
| 508.0 | -7.45 | -5.47 | -1.52 | 4.41 | 10.94 | 18.37 | 29.73 | 44.82 | 65.86 | 85.43 | 119.89 | 155.17 | 199.99 | 245.34 | 327.94 | 404.31 | 534.41 | 667.55 | 833.74 | 1011.73 | 1207.91 |
| 509.0 | -7.42 | -5.41 | -1.37 | 4.62 | 11.2 | 18.82 | 30.36 | 45.66 | 66.93 | 87.07 | 121.88 | 157.63 | 202.98 | 248.98 | 332.92 | 410.42 | 542.13 | 677.26 | 845.48 | 1026.37 | 1225.3 |
| 510.0 | -7.39 | -5.37 | -1.2 | 4.86 | 11.45 | 19.32 | 30.93 | 46.44 | 67.8 | 88.63 | 123.68 | 159.91 | 205.78 | 252.71 | 337.36 | 416.28 | 549.79 | 686.66 | 856.49 | 1040.06 | 1242.02 |
| 511.0 | -7.41 | -5.16 | -1 | 4.99 | 11.79 | 19.78 | 31.46 | 47.24 | 68.74 | 90.02 | 125.67 | 162.02 | 208.53 | 256.54 | 341.87 | 422.36 | 557.64 | 696 | 868.3 | 1054.48 | 1258.82 |
| 512.0 | -7.35 | -4.81 | -0.79 | 5.22 | 12.17 | 20.13 | 32.23 | 48.28 | 69.92 | 91.48 | 127.63 | 164.33 | 211.48 | 260.17 | 346.36 | 427.89 | 565.31 | 705.18 | 880.24 | 1068.79 | 1275.24 |
| 513.0 | -7.22 | -4.63 | -0.59 | 5.49 | 12.49 | 20.57 | 32.85 | 49.15 | 70.97 | 92.9 | 129.29 | 166.74 | 214.08 | 263.65 | 351.1 | 433.53 | 572.8 | 714.41 | 891.06 | 1081.97 | 1291.35 |
| 514.0 | -7.1 | -4.58 | -0.5 | 5.76 | 12.96 | 20.88 | 33.44 | 49.95 | 71.98 | 94.2 | 131.25 | 169.03 | 216.86 | 267.19 | 355.35 | 439.05 | 580.11 | 723.35 | 902.11 | 1095.62 | 1307.19 |
| 515.0 | -6.89 | -4.48 | -0.29 | 6.01 | 13.42 | 21.35 | 34.17 | 50.96 | 72.99 | 95.65 | 132.98 | 171.35 | 219.93 | 270.67 | 359.63 | 444.89 | 587.54 | 732.65 | 913.77 | 1109.21 | 1323.2 |
| 516.0 | -6.92 | -4.4 | -0.33 | 6.11 | 13.64 | 21.65 | 34.56 | 51.79 | 74.1 | 96.77 | 134.59 | 173.49 | 222.72 | 274.18 | 363.75 | 450.31 | 594.41 | 741.5 | 924.51 | 1121.92 | 1339.07 |
| 517.0 | -6.9 | -4.32 | -0.1 | 6.31 | 13.98 | 22.06 | 35.26 | 52.54 | 75.31 | 97.96 | 136.25 | 175.85 | 225.86 | 277.54 | 367.87 | 455.93 | 601.11 | 750.19 | 935.4 | 1134.68 | 1354.38 |
| 518.0 | -6.8 | -4.11 | -0.01 | 6.4 | 14.21 | 22.52 | 35.89 | 53.34 | 76.31 | 99.26 | 137.99 | 178.15 | 228.53 | 280.81 | 372.04 | 461.14 | 608.25 | 758.28 | 946.15 | 1147.4 | 1368.67 |
| 519.0 | -6.58 | -3.92 | 0.19 | 6.64 | 14.63 | 23.04 | 36.35 | 54.22 | 77.38 | 100.86 | 139.62 | 180.4 | 231.33 | 283.91 | 376.29 | 465.75 | 614.96 | 766.23 | 956.1 | 1159.47 | 1382.46 |
| 520.0 | -6.54 | -3.83 | 0.3 | 6.83 | 15 | 23.6 | 36.84 | 54.75 | 78.41 | 102.07 | 141.15 | 182.58 | 233.65 | 286.96 | 380.27 | 470.58 | 621.55 | 774.27 | 965.5 | 1170.86 | 1395.6 |
| 521.0 | -6.45 | -3.62 | 0.58 | 7.05 | 15.31 | 24.04 | 37.29 | 55.35 | 79.13 | 103.18 | 142.59 | 184.45 | 236.2 | 289.67 | 383.79 | 475.26 | 627.73 | 781.26 | 974.2 | 1181.85 | 1408.34 |
| 522.0 | -6.49 | -3.45 | 0.68 | 7.26 | 15.49 | 24.26 | 37.64 | 55.71 | 79.99 | 103.93 | 143.85 | 186.22 | 238.1 | 292.36 | 387.34 | 479.4 | 633.23 | 788.59 | 982.29 | 1191.66 | 1420.4 |
| 523.0 | -6.44 | -3.32 | 0.8 | 7.57 | 15.77 | 24.61 | 38.12 | 56.21 | 80.86 | 104.95 | 145.49 | 187.9 | 240.62 | 295.17 | 390.72 | 483.26 | 639.2 | 795.25 | 990.65 | 1201.3 | 1432.47 |
| 524.0 | -6.28 | -3.2 | 0.96 | 7.85 | 16 | 25.02 | 38.54 | 56.84 | 81.66 | 105.77 | 146.58 | 189.64 | 242.47 | 297.58 | 393.56 | 487.21 | 644.06 | 801.24 | 997.59 | 1210.19 | 1442.47 |
| 525.0 | -6.12 | -2.99 | 1.29 | 8.12 | 16.53 | 25.4 | 39.05 | 57.57 | 82.61 | 106.85 | 147.85 | 191.47 | 244.56 | 300.22 | 396.82 | 491.41 | 649.18 | 807.15 | 1004.99 | 1219.23 | 1453.33 |
| 526.0 | -5.99 | -2.64 | 1.54 | 8.45 | 17.18 | 25.77 | 39.66 | 58.23 | 83.5 | 107.96 | 149.29 | 193.19 | 246.67 | 302.64 | 399.85 | 495.63 | 654.21 | 812.89 | 1011.43 | 1227.28 | 1463.02 |
| 527.0 | -5.97 | -2.52 | 1.64 | 8.63 | 17.34 | 26.17 | 40.15 | 58.71 | 84.21 | 108.78 | 150.71 | 194.8 | 248.43 | 304.58 | 402.83 | 499.06 | 658.7 | 818.36 | 1017.58 | 1235.25 | 1472.64 |
| 528.0 | -5.74 | -2.34 | 1.84 | 8.9 | 17.72 | 26.45 | 40.65 | 59.43 | 85.14 | 109.89 | 151.98 | 196.44 | 250.32 | 307.04 | 405.65 | 502.96 | 662.96 | 823.73 | 1024.18 | 1243.63 | 1481.61 |
| 529.0 | -5.75 | -2.38 | 2.03 | 9.03 | 17.88 | 26.78 | 40.95 | 59.82 | 85.98 | 110.83 | 153.17 | 197.95 | 252.2 | 308.95 | 408.8 | 506.29 | 667.59 | 829.01 | 1031.22 | 1252.29 | 1491.31 |
| 530.0 | -5.63 | -2.19 | 2.2 | 9.19 | 18.17 | 26.91 | 41.36 | 60.32 | 86.73 | 111.63 | 154.48 | 199.57 | 254.39 | 311.19 | 411.72 | 509.97 | 672.33 | 834.29 | 1038.01 | 1260.21 | 1501.47 |
| 531.0 | -5.54 | -2.09 | 2.17 | 9.36 | 18.34 | 27.13 | 41.68 | 60.88 | 87.54 | 112.46 | 155.89 | 201.32 | 256.25 | 313.47 | 414.75 | 513.41 | 676.84 | 839.84 | 1045.51 | 1269.04 | 1511.48 |
| 532.0 | -5.55 | -2.09 | 2.16 | 9.44 | 18.45 | 27.28 | 42.05 | 61.31 | 88.21 | 113.28 | 156.97 | 203.08 | 258.36 | 315.59 | 417.55 | 516.99 | 681.44 | 845.31 | 1052.11 | 1277.13 | 1520.76 |
| 533.0 | -5.37 | -2.07 | 2.32 | 9.66 | 18.77 | 27.76 | 42.31 | 61.61 | 88.85 | 114.19 | 158.09 | 204.57 | 260.29 | 317.89 | 420.66 | 520.44 | 686.19 | 850.47 | 1059.03 | 1285.13 | 1530.13 |
| 534.0 | -5.37 | -2.09 | 2.41 | 9.75 | 18.96 | 28.14 | 42.71 | 62.01 | 89.7 | 115.16 | 159.63 | 206.12 | 262.35 | 320.04 | 423.48 | 524.02 | 690.62 | 856.07 | 1066.6 | 1293.96 | 1540.3 |
| 535.0 | -5.28 | -1.98 | 2.63 | 9.88 | 19.14 | 28.52 | 43.15 | 62.6 | 90.43 | 116.22 | 160.73 | 207.9 | 264.21 | 322.06 | 426.56 | 527.7 | 696.14 | 862.03 | 1074.03 | 1303.01 | 1550.78 |
| 536.0 | -5.21 | -1.87 | 2.74 | 10.27 | 19.37 | 28.86 | 43.42 | 63.05 | 91.31 | 117.25 | 162.28 | 209.42 | 266 | 324.76 | 429.76 | 531.45 | 701.21 | 867.55 | 1080.98 | 1311.49 | 1560.76 |
| 537.0 | -5.11 | -1.82 | 2.85 | 10.49 | 19.63 | 29.12 | 43.8 | 63.56 | 92 | 118.38 | 163.87 | 211.18 | 268.15 | 326.97 | 432.79 | 535.77 | 706.82 | 873.85 | 1088.98 | 1321.13 | 1571.54 |
| 538.0 | -4.98 | -1.62 | 3.03 | 10.82 | 19.99 | 29.48 | 44.17 | 64.19 | 92.74 | 119.57 | 165.52 | 212.97 | 270.39 | 329.93 | 436.44 | 539.84 | 712.68 | 881.33 | 1097.52 | 1332.02 | 1584.46 |
| 539.0 | -5.06 | -1.6 | 3.2 | 11.05 | 20.02 | 29.72 | 44.59 | 64.76 | 93.73 | 120.46 | 166.94 | 214.82 | 272.52 | 332.6 | 440.45 | 544.53 | 718.88 | 888.5 | 1106.41 | 1342.45 | 1597.64 |
| 540.0 | -5.06 | -1.61 | 3.36 | 11.12 | 20.28 | 30.17 | 45.04 | 65.29 | 94.59 | 121.72 | 168.7 | 217 | 274.9 | 336.04 | 444.32 | 549.45 | 725.55 | 896.23 | 1116.12 | 1354.44 | 1611.13 |
| 541.0 | -4.95 | -1.5 | 3.53 | 11.41 | 20.52 | 30.52 | 45.55 | 65.92 | 95.4 | 122.97 | 170.59 | 218.76 | 277.97 | 339.32 | 448.35 | 554.72 | 731.71 | 904.31 | 1126.29 | 1366.47 | 1625.36 |
| 542.0 | -4.92 | -1.38 | 3.58 | 11.56 | 20.76 | 30.95 | 46.18 | 66.65 | 96.49 | 124.16 | 172.47 | 221.07 | 280.81 | 343.06 | 452.68 | 560.09 | 738.61 | 913.13 | 1137.47 | 1379.68 | 1640.48 |
| 543.0 | -4.8 | -1.31 | 3.87 | 11.88 | 21.16 | 31.5 | 46.93 | 67.65 | 97.71 | 125.81 | 174.55 | 223.67 | 284.35 | 346.63 | 457.63 | 566.43 | 746.72 | 923.06 | 1149.81 | 1394.41 | 1658.12 |
| 544.0 | -4.71 | -1.18 | 4.08 | 12.15 | 21.37 | 31.9 | 47.59 | 68.64 | 99.04 | 127.53 | 176.6 | 226.24 | 287.55 | 350.43 | 462.78 | 572.87 | 755.19 | 933.29 | 1162.21 | 1409.97 | 1675.42 |
| 545.0 | -4.73 | -1.07 | 4.26 | 12.53 | 21.46 | 32.18 | 48 | 69.36 | 100.45 | 129.2 | 178.85 | 229.02 | 291.09 | 354.69 | 468.42 | 579.64 | 764.44 | 944.81 | 1176.31 | 1426.46 | 1694.1 |
| 546.0 | -4.77 | -1.07 | 4.37 | 12.81 | 21.67 | 32.6 | 48.58 | 70.22 | 101.65 | 130.87 | 181.18 | 231.55 | 294.26 | 358.96 | 473.7 | 586.5 | 773.42 | 956.27 | 1190.06 | 1442.4 | 1714.03 |
| 547.0 | -4.71 | -1.14 | 4.46 | 13.08 | 21.98 | 33.11 | 49.06 | 71.24 | 102.89 | 132.7 | 183.47 | 234.62 | 297.82 | 363.74 | 479.91 | 593.52 | 783.28 | 968.46 | 1205.2 | 1459.76 | 1735.45 |
| 548.0 | -4.71 | -1.05 | 4.68 | 13.19 | 22.42 | 33.42 | 49.73 | 72.33 | 104.32 | 134.61 | 185.92 | 237.51 | 301.62 | 368.91 | 485.99 | 600.96 | 793.5 | 981.05 | 1220.82 | 1478.29 | 1757.3 |
| 549.0 | -4.63 | -0.96 | 4.74 | 13.47 | 22.66 | 33.94 | 50.41 | 73.19 | 105.75 | 136.39 | 188.52 | 240.45 | 305.54 | 373.62 | 492.07 | 608.37 | 804.33 | 994.14 | 1236.77 | 1496.94 | 1780 |
| 550.0 | -4.55 | -0.73 | 4.93 | 13.89 | 22.95 | 34.44 | 51.28 | 74.21 | 107.15 | 138.47 | 191.26 | 243.9 | 309.79 | 378.5 | 498.44 | 616.67 | 815.13 | 1007.63 | 1253.08 | 1516.01 | 1803.59 |
| 551.0 | -4.39 | -0.56 | 5.3 | 14.26 | 23.47 | 35.06 | 52.17 | 75.49 | 108.63 | 140.82 | 193.93 | 247.26 | 313.83 | 383.99 | 504.79 | 625.09 | 826.05 | 1021.41 | 1270.3 | 1535.74 | 1826.77 |
| 552.0 | -4.24 | -0.32 | 5.75 | 14.64 | 24.02 | 35.72 | 53.09 | 76.69 | 110.27 | 142.84 | 196.61 | 250.88 | 318.3 | 388.89 | 511.67 | 633.76 | 837.52 | 1035.5 | 1287.13 | 1556.05 | 1851.03 |
| 553.0 | -4.14 | -0.13 | 6.17 | 15.02 | 24.53 | 36.47 | 53.98 | 77.82 | 111.87 | 144.8 | 199.28 | 254.43 | 322.67 | 394.05 | 518.73 | 641.97 | 848.58 | 1049.47 | 1304.3 | 1576.65 | 1874.85 |
| 554.0 | -4.19 | 0.02 | 6.29 | 15.37 | 24.87 | 37 | 54.83 | 79.18 | 113.61 | 146.74 | 202.05 | 257.99 | 327.02 | 399.53 | 525.65 | 651.08 | 860.4 | 1064.19 | 1322.12 | 1597.87 | 1900.35 |
| 555.0 | -4.11 | 0.29 | 6.6 | 15.8 | 25.3 | 37.5 | 55.63 | 80.56 | 115.09 | 148.61 | 204.85 | 261.7 | 331.45 | 405.29 | 532.89 | 660 | 872.19 | 1078.48 | 1340.24 | 1618.95 | 1925.54 |
| 556.0 | -4.05 | 0.44 | 6.88 | 16.04 | 25.66 | 38.04 | 56.4 | 81.68 | 116.58 | 150.65 | 207.7 | 265.03 | 335.79 | 410.62 | 539.71 | 669.07 | 883.09 | 1093.12 | 1358.31 | 1639.97 | 1950.4 |
| 557.0 | -3.97 | 0.6 | 7.05 | 16.2 | 26.08 | 38.66 | 57.22 | 82.88 | 118.13 | 152.57 | 210.34 | 268.74 | 340 | 415.59 | 546.4 | 677.65 | 894.52 | 1107.5 | 1375.87 | 1661.13 | 1975.34 |
| 558.0 | -3.87 | 0.77 | 7.39 | 16.49 | 26.66 | 39.42 | 58.13 | 84.11 | 119.72 | 154.59 | 213.06 | 272.26 | 344.31 | 420.81 | 553.73 | 686.39 | 905.66 | 1121.63 | 1393.92 | 1681.81 | 2000.55 |
| 559.0 | -3.87 | 0.84 | 7.6 | 16.8 | 26.94 | 39.88 | 58.96 | 85.12 | 121.32 | 156.64 | 215.64 | 275.49 | 348.28 | 425.71 | 560.49 | 695.13 | 917.4 | 1135.21 | 1411.18 | 1702.97 | 2024.69 |
| 560.0 | -3.7 | 0.85 | 7.83 | 17.09 | 27.5 | 40.43 | 59.72 | 86.01 | 122.67 | 158.81 | 218.23 | 278.83 | 352.66 | 430.9 | 566.91 | 703.55 | 928.37 | 1149.08 | 1428.07 | 1724.24 | 2049.01 |
| 561.0 | -3.65 | 1.02 | 7.87 | 17.37 | 27.85 | 40.76 | 60.51 | 87.02 | 124.09 | 160.53 | 220.56 | 281.88 | 356.63 | 435.45 | 573.64 | 711.84 | 938.95 | 1162.86 | 1445.24 | 1744.25 | 2072.85 |
| 562.0 | -3.6 | 1.03 | 8.04 | 17.52 | 28.36 | 41.34 | 61.24 | 88.14 | 125.58 | 162.36 | 222.78 | 284.99 | 360.25 | 440.25 | 580.01 | 719.77 | 950.05 | 1176.05 | 1462 | 1764.15 | 2096.45 |
| 563.0 | -3.39 | 1.2 | 8.32 | 17.9 | 28.97 | 41.94 | 62.06 | 89.18 | 127.03 | 164.44 | 225.09 | 288.23 | 364.12 | 444.88 | 586.25 | 727.82 | 960.51 | 1189.13 | 1477.99 | 1782.87 | 2119 |
| 564.0 | -3.22 | 1.41 | 8.59 | 18.32 | 29.53 | 42.51 | 62.83 | 90.25 | 128.38 | 166.12 | 227.47 | 291.25 | 367.75 | 449.42 | 591.99 | 735.26 | 969.95 | 1201.06 | 1492.31 | 1800.72 | 2139.12 |
| 565.0 | -3.12 | 1.69 | 8.74 | 18.56 | 30.12 | 43.04 | 63.64 | 91.24 | 129.68 | 167.76 | 229.76 | 294.19 | 371.25 | 453.51 | 598.01 | 742.4 | 979.11 | 1212.83 | 1507.41 | 1818.28 | 2160.1 |
| 566.0 | -2.89 | 1.85 | 8.84 | 18.67 | 30.68 | 43.71 | 64.53 | 92.03 | 130.79 | 169.36 | 232.06 | 296.74 | 374.48 | 457.48 | 603.03 | 749.24 | 988.31 | 1223.9 | 1521.36 | 1835.28 | 2180.71 |
| 567.0 | -2.83 | 2.07 | 8.94 | 18.84 | 30.95 | 44.11 | 65.29 | 92.98 | 131.86 | 170.97 | 234.17 | 299.43 | 377.85 | 461.45 | 608.46 | 756.01 | 997.03 | 1234.7 | 1534.87 | 1851.53 | 2199.11 |
| 568.0 | -2.7 | 2.32 | 9.22 | 19.05 | 31.2 | 44.49 | 65.96 | 93.59 | 132.8 | 172.19 | 235.93 | 301.46 | 380.98 | 464.89 | 612.92 | 762.08 | 1004.52 | 1244.69 | 1546.81 | 1866.5 | 2215.2 |
| 569.0 | -2.52 | 2.41 | 9.37 | 19.35 | 31.52 | 45.01 | 66.48 | 94.18 | 133.76 | 173.36 | 237.55 | 303.81 | 383.94 | 467.87 | 617.24 | 768.06 | 1012.2 | 1254.28 | 1558.72 | 1880.49 | 2231.72 |
| 570.0 | -2.46 | 2.6 | 9.68 | 19.6 | 31.98 | 45.47 | 67.11 | 94.98 | 134.55 | 174.54 | 239.03 | 305.97 | 386.54 | 471.03 | 621.9 | 773.74 | 1018.83 | 1263.08 | 1569.08 | 1893.63 | 2247.23 |
| 571.0 | -2.36 | 2.71 | 9.81 | 19.62 | 32.41 | 45.83 | 67.51 | 95.66 | 135.39 | 175.35 | 240.39 | 307.45 | 388.48 | 474.25 | 625.64 | 778.54 | 1025.02 | 1271.06 | 1579.14 | 1905.31 | 2261.38 |
| 572.0 | -2.44 | 2.57 | 9.81 | 19.63 | 32.42 | 46.12 | 67.73 | 95.96 | 136 | 176.08 | 241.59 | 308.98 | 390.34 | 476.32 | 628.97 | 782.55 | 1030.52 | 1278.12 | 1587.54 | 1916.65 | 2274.03 |
| 573.0 | -2.51 | 2.6 | 9.87 | 19.75 | 32.63 | 46.34 | 68.02 | 96.23 | 136.47 | 176.79 | 242.76 | 310.55 | 392.3 | 478.75 | 632.05 | 786.6 | 1036.05 | 1285.03 | 1596.07 | 1927.07 | 2286.02 |
| 574.0 | -2.35 | 2.78 | 10.01 | 19.97 | 32.77 | 46.67 | 68.45 | 96.58 | 137.19 | 177.74 | 243.74 | 311.51 | 393.82 | 481.15 | 635.03 | 790.69 | 1041.28 | 1291.3 | 1603.84 | 1936.86 | 2297.12 |
| 575.0 | -2.39 | 2.79 | 10.1 | 20.04 | 32.93 | 46.75 | 68.68 | 96.81 | 137.42 | 178.66 | 244.69 | 312.62 | 395.3 | 483.17 | 637.43 | 793.91 | 1045.59 | 1296.92 | 1610.42 | 1945.23 | 2307.57 |
| 576.0 | -2.29 | 2.74 | 10.26 | 20.01 | 33.21 | 46.98 | 68.9 | 97.03 | 137.98 | 179.49 | 245.3 | 313.68 | 396.94 | 485.17 | 639.83 | 797.08 | 1050.17 | 1302.8 | 1616.43 | 1954.07 | 2317.37 |
| 577.0 | -2.25 | 2.83 | 10.27 | 20.22 | 33.51 | 47.18 | 69.21 | 97.28 | 138.5 | 180.28 | 246.36 | 314.88 | 398.41 | 487.15 | 642.77 | 800.23 | 1054.25 | 1307.66 | 1622.77 | 1962.08 | 2326.92 |
| 578.0 | -2.35 | 2.78 | 10.16 | 20.18 | 33.61 | 47.22 | 69.17 | 97.49 | 138.68 | 180.64 | 247.17 | 315.75 | 399.75 | 488.87 | 645.29 | 803.09 | 1057.93 | 1312.69 | 1628.78 | 1969.46 | 2335.96 |
| 579.0 | -2.39 | 2.85 | 10.15 | 20.3 | 33.64 | 47.3 | 69.28 | 97.76 | 139 | 181.21 | 247.9 | 316.57 | 400.84 | 490.57 | 647.07 | 805.63 | 1061.91 | 1317.22 | 1634.27 | 1976.43 | 2344.15 |
| 580.0 | -2.33 | 2.83 | 10.16 | 20.16 | 33.65 | 47.43 | 69.39 | 97.98 | 139.33 | 181.58 | 248.35 | 317.59 | 401.79 | 491.92 | 648.81 | 807.64 | 1064.87 | 1320.84 | 1638.82 | 1981.75 | 2350.88 |
| 581.0 | -2.27 | 3.04 | 10.26 | 20.32 | 33.88 | 47.68 | 69.66 | 98.38 | 139.83 | 181.94 | 249.13 | 318.39 | 402.73 | 493.16 | 650.91 | 809.81 | 1067.8 | 1324.78 | 1643.05 | 1986.98 | 2356.83 |
| 582.0 | -2.22 | 3 | 10.31 | 20.42 | 33.94 | 47.65 | 69.79 | 98.65 | 139.99 | 182.28 | 249.57 | 319.1 | 403.68 | 494.31 | 652.38 | 811.34 | 1070.52 | 1327.4 | 1646.28 | 1991.23 | 2362.6 |
| 583.0 | -2.25 | 3.05 | 10.46 | 20.54 | 33.97 | 47.6 | 69.94 | 98.89 | 140.23 | 182.4 | 250.21 | 319.88 | 404.51 | 495.36 | 653.81 | 812.69 | 1072.46 | 1330.38 | 1649.76 | 1995.4 | 2367.63 |
| 584.0 | -2.2 | 2.99 | 10.45 | 20.68 | 33.91 | 47.58 | 69.88 | 99.12 | 140.45 | 182.59 | 250.81 | 320.58 | 405.31 | 496.57 | 655.52 | 814.37 | 1075.16 | 1333.37 | 1653.6 | 2000.9 | 2374.31 |
| 585.0 | -2.22 | 3.05 | 10.43 | 20.7 | 33.78 | 47.62 | 69.97 | 99.1 | 140.68 | 182.95 | 250.96 | 321.3 | 406.12 | 497.56 | 657.06 | 816.23 | 1077.27 | 1336.06 | 1658.55 | 2005.62 | 2381.03 |
| 586.0 | -2.28 | 3.05 | 10.58 | 20.75 | 33.83 | 47.92 | 70.07 | 99.16 | 140.86 | 183.49 | 251.42 | 321.9 | 406.87 | 499.01 | 658.24 | 817.92 | 1079.28 | 1339.36 | 1662.48 | 2010.31 | 2387.22 |
| 587.0 | -2.37 | 3.06 | 10.72 | 20.95 | 33.87 | 48.01 | 70.25 | 99.38 | 141.12 | 183.94 | 251.75 | 322.53 | 407.89 | 500.27 | 660.05 | 820.14 | 1081.11 | 1342.96 | 1666.44 | 2015.13 | 2393.24 |
| 588.0 | -2.44 | 3.06 | 10.8 | 21.05 | 33.93 | 48 | 70.23 | 99.54 | 141.37 | 183.86 | 252.1 | 323.2 | 409 | 501.43 | 661.37 | 821.79 | 1083.58 | 1346.17 | 1671.42 | 2020.73 | 2399.89 |
| 589.0 | -2.51 | 2.99 | 10.71 | 20.98 | 33.85 | 48.06 | 70.21 | 99.66 | 141.52 | 183.9 | 252.6 | 323.89 | 409.81 | 502.38 | 662.59 | 823.35 | 1086.46 | 1348.73 | 1675.34 | 2025.22 | 2406.42 |
| 590.0 | -2.51 | 3.13 | 10.78 | 21.15 | 33.85 | 48.26 | 70.44 | 99.88 | 141.77 | 184.56 | 253.17 | 324.59 | 410.68 | 503.77 | 664.32 | 825.45 | 1089.17 | 1351.86 | 1679.19 | 2030.29 | 2412.62 |
| 591.0 | -2.39 | 3.02 | 10.74 | 21.18 | 33.95 | 48.28 | 70.49 | 99.99 | 142.13 | 184.96 | 253.43 | 325.04 | 411.3 | 504.99 | 665.7 | 827.47 | 1091.57 | 1354.64 | 1682.96 | 2035 | 2418.13 |
| 592.0 | -2.4 | 2.97 | 10.76 | 21.39 | 33.93 | 48.49 | 70.66 | 100.36 | 142.39 | 185.59 | 254.04 | 326.13 | 412.47 | 506.2 | 667.6 | 829.67 | 1094.15 | 1357.35 | 1686.81 | 2041.06 | 2424.69 |
| 593.0 | -2.24 | 3.24 | 10.7 | 21.59 | 33.97 | 48.65 | 70.88 | 100.68 | 142.85 | 185.95 | 254.68 | 326.99 | 413.63 | 507.55 | 669.57 | 832.02 | 1096.93 | 1360.86 | 1691.3 | 2046.94 | 2430.78 |
| 594.0 | -2.33 | 3.09 | 10.8 | 21.64 | 33.91 | 48.82 | 70.99 | 100.99 | 143.13 | 186.44 | 255.1 | 327.35 | 414.48 | 508.83 | 671.13 | 834.38 | 1099.39 | 1363.83 | 1695.46 | 2051.48 | 2437.25 |
| 595.0 | -2.38 | 3.01 | 10.8 | 21.61 | 34.1 | 48.79 | 71.1 | 101.31 | 143.55 | 186.74 | 255.9 | 328.43 | 415.69 | 510.36 | 672.75 | 836.32 | 1102.45 | 1367.49 | 1700.19 | 2056.79 | 2444.95 |
| 596.0 | -2.38 | 2.91 | 10.81 | 21.66 | 34.16 | 48.8 | 71.32 | 101.52 | 143.89 | 187.05 | 256.65 | 329.02 | 416.76 | 511.69 | 674.77 | 838.55 | 1105.31 | 1370.84 | 1704.28 | 2062.24 | 2451.17 |
| 597.0 | -2.39 | 2.91 | 10.82 | 21.84 | 34.35 | 48.81 | 71.63 | 102.04 | 144.19 | 187.56 | 257.59 | 329.7 | 417.7 | 512.89 | 676.29 | 841.15 | 1108.43 | 1374.26 | 1709.29 | 2068 | 2456.89 |
| 598.0 | -2.24 | 2.87 | 10.91 | 21.93 | 34.39 | 49.04 | 71.83 | 102.43 | 144.74 | 188.01 | 258.18 | 330.49 | 419.06 | 514.39 | 677.44 | 843.05 | 1111.15 | 1377.47 | 1712.89 | 2072.24 | 2463.23 |
| 599.0 | -2.31 | 2.93 | 10.99 | 21.95 | 34.39 | 48.97 | 72.1 | 102.6 | 145.32 | 188.51 | 258.84 | 331.18 | 419.96 | 515.75 | 679.01 | 845.25 | 1113.87 | 1380.38 | 1717.06 | 2077.46 | 2469.56 |
| 600.0 | -2.27 | 2.99 | 11.04 | 21.99 | 34.42 | 48.96 | 72.24 | 102.65 | 145.56 | 188.98 | 259.39 | 331.96 | 420.86 | 516.63 | 680.49 | 846.73 | 1115.83 | 1382.95 | 1719.96 | 2081.89 | 2474.46 |
| 601.0 | -2.19 | 3.12 | 11.08 | 22.29 | 34.73 | 49.22 | 72.47 | 103.05 | 145.78 | 189.26 | 260.15 | 332.45 | 422.07 | 518.07 | 682.33 | 849.31 | 1118.1 | 1385.51 | 1724.25 | 2086.75 | 2480.31 |
| 602.0 | -2.2 | 3.05 | 11.16 | 22.33 | 34.78 | 49.19 | 72.52 | 103.35 | 146.02 | 189.64 | 260.43 | 333 | 422.81 | 519.41 | 683.59 | 851.22 | 1120.27 | 1388.03 | 1727.99 | 2091.3 | 2485.96 |
| 603.0 | -2.24 | 3.13 | 11.33 | 22.48 | 34.83 | 49.46 | 72.76 | 103.69 | 146.48 | 190.12 | 261.34 | 333.8 | 424.01 | 520.92 | 685.24 | 853.93 | 1122.78 | 1392.06 | 1733.08 | 2097.54 | 2492.16 |
| 604.0 | -2.09 | 3.21 | 11.27 | 22.59 | 34.9 | 49.67 | 73.02 | 104.15 | 147.01 | 190.75 | 262.13 | 334.66 | 425.14 | 522.24 | 686.99 | 856.4 | 1125.93 | 1395.05 | 1737.25 | 2103.02 | 2498.52 |
| 605.0 | -2.16 | 3.33 | 11.37 | 22.47 | 35.06 | 49.74 | 73.23 | 104.5 | 147.33 | 191.26 | 262.73 | 335.05 | 426.36 | 523.41 | 688.32 | 858.11 | 1128.29 | 1398.06 | 1740.89 | 2107.08 | 2503.75 |
| 606.0 | -2.19 | 3.31 | 11.35 | 22.62 | 35.24 | 50 | 73.46 | 104.76 | 147.55 | 191.61 | 263.5 | 335.55 | 427.34 | 524.46 | 690.08 | 859.93 | 1130.51 | 1400.35 | 1743.35 | 2110.91 | 2508.13 |
| 607.0 | -2.01 | 3.1 | 11.22 | 22.43 | 35.19 | 49.91 | 73.43 | 104.96 | 147.72 | 191.59 | 263.88 | 336.3 | 428.33 | 525.27 | 691.22 | 861.75 | 1132.87 | 1402.36 | 1745.91 | 2114.61 | 2511.74 |
| 608.0 | -1.98 | 3.14 | 11.35 | 22.42 | 35.38 | 49.89 | 73.46 | 105.35 | 148.03 | 191.88 | 264.59 | 336.77 | 429.08 | 525.8 | 692.38 | 862.72 | 1135.14 | 1403.48 | 1747.87 | 2117.28 | 2514.45 |
| 609.0 | -1.92 | 3.12 | 11.44 | 22.5 | 35.58 | 50.06 | 73.67 | 105.41 | 148.31 | 192.46 | 265 | 337.2 | 429.39 | 526.63 | 693.54 | 863.75 | 1136.56 | 1405.12 | 1748.87 | 2119.74 | 2517.36 |
| 610.0 | -1.79 | 3.23 | 11.51 | 22.54 | 35.72 | 50.1 | 73.76 | 105.73 | 148.66 | 193.06 | 265.32 | 337.89 | 429.84 | 527.35 | 694.66 | 865.1 | 1137.61 | 1406.68 | 1751.16 | 2122.1 | 2520.66 |
| 611.0 | -1.75 | 3.2 | 11.64 | 22.5 | 35.82 | 50.1 | 73.92 | 105.97 | 148.96 | 193.48 | 265.72 | 338.6 | 430.48 | 528.22 | 695.5 | 865.95 | 1138.42 | 1407.24 | 1752.11 | 2123.67 | 2522.91 |
| 612.0 | -1.81 | 3.36 | 11.72 | 22.39 | 35.72 | 50.29 | 73.89 | 106.05 | 149.12 | 193.78 | 266.07 | 339.18 | 431.16 | 528.7 | 696.05 | 866.49 | 1139.76 | 1408.15 | 1753 | 2124.64 | 2525.21 |
| 613.0 | -1.72 | 3.57 | 11.73 | 22.42 | 35.85 | 50.25 | 74.06 | 105.92 | 149.52 | 194.02 | 266.44 | 339.63 | 431.63 | 528.89 | 695.96 | 866.53 | 1140.57 | 1408.56 | 1753.56 | 2125.3 | 2525.18 |
| 614.0 | -1.84 | 3.36 | 11.7 | 22.33 | 35.88 | 50.16 | 74.01 | 105.67 | 149.69 | 193.85 | 266.59 | 339.74 | 431.88 | 529.3 | 695.82 | 866.45 | 1141.05 | 1408.49 | 1753.98 | 2124.43 | 2525.26 |
| 615.0 | -1.63 | 3.56 | 11.73 | 22.38 | 36.13 | 50.14 | 74.11 | 105.79 | 149.97 | 193.89 | 267.09 | 340.08 | 432.34 | 529.87 | 695.96 | 866.37 | 1140.97 | 1408.67 | 1753.25 | 2125.14 | 2524.89 |
| 616.0 | -1.6 | 3.58 | 11.61 | 22.44 | 36.13 | 50.16 | 74.06 | 105.9 | 149.87 | 194.16 | 267.01 | 339.88 | 432.26 | 529.29 | 695.63 | 865.95 | 1139.96 | 1407.96 | 1751.89 | 2123.73 | 2523.51 |
| 617.0 | -1.47 | 3.7 | 11.71 | 22.56 | 36.2 | 50.33 | 74.15 | 106 | 150.16 | 194.14 | 267 | 340 | 432.41 | 529.29 | 695.03 | 865.79 | 1139.17 | 1407.61 | 1750.6 | 2122.23 | 2522.68 |
| 618.0 | -1.4 | 3.79 | 11.8 | 22.73 | 36.08 | 50.54 | 74.02 | 105.73 | 150.26 | 194.13 | 266.78 | 340.12 | 432.47 | 529.3 | 695.02 | 865.18 | 1137.85 | 1406.07 | 1748.58 | 2119.91 | 2520.87 |
| 619.0 | -1.46 | 3.86 | 11.84 | 22.71 | 36.02 | 50.46 | 73.98 | 105.66 | 150.07 | 194.04 | 266.63 | 339.8 | 432 | 528.73 | 694.75 | 864.33 | 1136.31 | 1403.91 | 1746.52 | 2117.4 | 2517.71 |
| 620.0 | -1.31 | 3.99 | 11.99 | 22.76 | 36.12 | 50.63 | 74.18 | 105.67 | 149.81 | 193.99 | 266.32 | 339.51 | 431.8 | 528.45 | 694.45 | 863.28 | 1134.45 | 1402.16 | 1743.54 | 2113.83 | 2514.02 |
| 621.0 | -1.28 | 3.95 | 12 | 22.83 | 36.14 | 50.78 | 74.34 | 105.86 | 149.87 | 193.78 | 265.91 | 339.15 | 431.66 | 528.12 | 693.67 | 862.52 | 1133.14 | 1399.77 | 1741.19 | 2111.06 | 2510.29 |
| 622.0 | -1.44 | 3.85 | 12.01 | 22.67 | 35.91 | 50.64 | 74.24 | 105.71 | 149.78 | 193.89 | 265.65 | 338.88 | 431.09 | 527.13 | 692.16 | 860.87 | 1131.47 | 1398 | 1737.71 | 2106.52 | 2505.89 |
| 623.0 | -1.56 | 3.77 | 12.01 | 22.45 | 35.71 | 50.63 | 74.17 | 105.37 | 149.22 | 193.58 | 265.18 | 338.32 | 430.61 | 525.95 | 690.64 | 859.19 | 1129.14 | 1395.4 | 1734.1 | 2101.68 | 2500.91 |
| 624.0 | -1.5 | 3.73 | 12.06 | 22.35 | 35.73 | 50.74 | 74.03 | 105.1 | 148.83 | 193.47 | 264.58 | 337.49 | 429.68 | 524.89 | 689.2 | 857.25 | 1126.81 | 1391.95 | 1729.04 | 2095.52 | 2495.01 |
| 625.0 | -1.52 | 3.7 | 12.21 | 22.36 | 35.67 | 50.77 | 73.91 | 104.92 | 148.48 | 193.31 | 264.19 | 336.77 | 429.11 | 523.69 | 687.38 | 855.08 | 1123.54 | 1388.23 | 1724.12 | 2090.13 | 2488.19 |
| 626.0 | -1.58 | 3.61 | 12.03 | 22.31 | 35.63 | 50.74 | 73.73 | 104.42 | 148.32 | 192.91 | 263.7 | 336.35 | 427.9 | 522.14 | 685.76 | 852.98 | 1120.24 | 1384.24 | 1718.92 | 2083.85 | 2480.63 |
| 627.0 | -1.55 | 3.68 | 12.12 | 22.17 | 35.53 | 50.62 | 73.42 | 104.09 | 147.99 | 192.78 | 263.01 | 335.49 | 426.56 | 520.9 | 683.82 | 850.48 | 1117.54 | 1380.41 | 1713.87 | 2077.87 | 2473.75 |
| 628.0 | -1.65 | 3.87 | 12.31 | 22.4 | 35.61 | 50.66 | 73.48 | 103.89 | 147.82 | 192.61 | 262.55 | 334.56 | 425.58 | 519.72 | 682.06 | 848.06 | 1114.06 | 1376.34 | 1708.41 | 2071.01 | 2466.72 |
| 629.0 | -1.47 | 3.9 | 12.3 | 22.37 | 35.63 | 50.68 | 73.33 | 103.65 | 147.25 | 192.2 | 262.03 | 334.17 | 424.93 | 518.69 | 680.11 | 845.89 | 1110.26 | 1371.95 | 1703.34 | 2064.72 | 2459.55 |
| 630.0 | -1.15 | 4.19 | 12.37 | 22.53 | 35.77 | 50.84 | 73.28 | 103.74 | 147.22 | 191.94 | 261.82 | 333.49 | 423.98 | 517.44 | 677.96 | 843.57 | 1106.89 | 1366.89 | 1697.55 | 2056.85 | 2450.64 |
| 631.0 | -1.23 | 4.16 | 12.36 | 22.62 | 35.5 | 50.89 | 73.21 | 103.4 | 147.08 | 191.44 | 261.2 | 332.8 | 422.64 | 516.26 | 675.73 | 840.85 | 1103.37 | 1362.83 | 1691.79 | 2050.8 | 2442.22 |
| 632.0 | -1.17 | 4.19 | 12.1 | 22.54 | 35.44 | 50.71 | 72.79 | 103.13 | 146.52 | 190.72 | 260.44 | 331.34 | 421.35 | 514.64 | 673.77 | 837.7 | 1100.11 | 1359.05 | 1686.91 | 2043.65 | 2434.49 |
| 633.0 | -1.09 | 3.99 | 12.03 | 22.65 | 35.5 | 50.62 | 72.7 | 103.18 | 146.3 | 190.11 | 259.89 | 330.62 | 420.29 | 513.09 | 672 | 835.28 | 1096.4 | 1354.61 | 1681.98 | 2037.33 | 2426.72 |
| 634.0 | -1.23 | 3.96 | 12.02 | 22.57 | 35.45 | 50.46 | 72.52 | 103.09 | 145.76 | 189.57 | 258.94 | 329.65 | 419.06 | 511.74 | 670.28 | 833.09 | 1093.07 | 1351.09 | 1677.25 | 2030.62 | 2419.25 |
| 635.0 | -1.08 | 4.18 | 12.23 | 22.64 | 35.49 | 50.51 | 72.5 | 103.24 | 145.44 | 189.35 | 258.51 | 329 | 418.13 | 510.5 | 668.92 | 830.7 | 1090.3 | 1347.27 | 1672.34 | 2024.59 | 2412.16 |
| 636.0 | -1.15 | 4.17 | 12.12 | 22.7 | 35.4 | 50.39 | 72.43 | 102.98 | 144.98 | 189.07 | 257.89 | 328.23 | 417.05 | 508.97 | 667.31 | 828.34 | 1087.46 | 1343.15 | 1668.08 | 2017.96 | 2404.49 |
| 637.0 | -1.2 | 4.03 | 12.04 | 22.55 | 35.3 | 50.17 | 72.16 | 102.6 | 144.44 | 188.5 | 257.39 | 327.58 | 416.22 | 507.68 | 665.86 | 826.16 | 1084.58 | 1339.75 | 1663.81 | 2012.33 | 2396.83 |
| 638.0 | -1.18 | 4.05 | 11.88 | 22.4 | 35.17 | 50.05 | 71.89 | 102.36 | 143.99 | 188.17 | 256.71 | 327.06 | 415.33 | 506.22 | 664.36 | 823.69 | 1081.92 | 1335.82 | 1659.66 | 2006.59 | 2388.81 |
| 639.0 | -1.23 | 4.06 | 11.73 | 22.24 | 35.05 | 49.99 | 71.77 | 102.27 | 143.47 | 187.82 | 256.31 | 326.14 | 413.94 | 504.79 | 662.72 | 821.32 | 1079.12 | 1332.11 | 1655.39 | 2000.62 | 2381.87 |
| 640.0 | -1.2 | 4.05 | 11.54 | 22.25 | 35.17 | 49.8 | 71.7 | 102 | 143.06 | 187.43 | 255.75 | 325.44 | 413.12 | 503.69 | 661.17 | 819.55 | 1076.81 | 1329.68 | 1651.89 | 1996.16 | 2375.18 |
| 641.0 | -1.28 | 4.03 | 11.41 | 22.28 | 35.01 | 49.52 | 71.33 | 101.74 | 142.89 | 187.17 | 255.45 | 324.9 | 412.18 | 502.54 | 659.29 | 817.72 | 1074.85 | 1326.43 | 1648.29 | 1991.73 | 2369.13 |
| 642.0 | -1.33 | 3.94 | 11.42 | 22.3 | 34.9 | 49.23 | 71.17 | 101.45 | 142.64 | 186.86 | 255.39 | 324.61 | 411.31 | 501.74 | 658.17 | 816.36 | 1072.79 | 1324.35 | 1644.87 | 1987.25 | 2364.63 |
| 643.0 | -1.25 | 3.97 | 11.4 | 22.38 | 35 | 49.22 | 71.1 | 101.22 | 142.35 | 186.52 | 255.07 | 324.17 | 410.41 | 500.91 | 657.26 | 814.95 | 1070.87 | 1322.17 | 1641.88 | 1983.8 | 2359.43 |
| 644.0 | -1.27 | 4.05 | 11.35 | 22.39 | 35.11 | 49.16 | 70.89 | 101.24 | 142.39 | 186.29 | 255.01 | 323.66 | 409.6 | 500.29 | 656.25 | 814.02 | 1069.32 | 1320.13 | 1639.78 | 1980.36 | 2355.08 |
| 645.0 | -1.24 | 4.17 | 11.37 | 22.4 | 35.04 | 48.89 | 70.81 | 101.18 | 142.35 | 185.9 | 254.84 | 323.57 | 409.15 | 499.48 | 655.21 | 812.81 | 1067.64 | 1318.18 | 1637.29 | 1977.72 | 2350.59 |
| 646.0 | -1.31 | 4.19 | 11.17 | 22.26 | 35 | 48.7 | 70.65 | 101 | 142.22 | 185.51 | 254.44 | 323.32 | 408.47 | 498.95 | 654.89 | 812.15 | 1066.56 | 1316.95 | 1635.39 | 1974.73 | 2347.38 |
| 647.0 | -1.08 | 4.31 | 11.34 | 22.33 | 34.93 | 48.72 | 70.62 | 101.06 | 142.06 | 185.25 | 254.19 | 322.85 | 408.05 | 498.38 | 653.99 | 811.47 | 1065.95 | 1315.63 | 1633.54 | 1972.34 | 2344.05 |
| 648.0 | -1.12 | 4.19 | 11.3 | 22.2 | 34.86 | 48.6 | 70.58 | 100.95 | 142.08 | 184.7 | 254.21 | 322.74 | 407.71 | 498.18 | 653.61 | 810.71 | 1064.88 | 1315.11 | 1632.24 | 1970.86 | 2341.28 |
| 649.0 | -1.24 | 3.95 | 10.92 | 21.97 | 34.54 | 48.25 | 70.38 | 100.66 | 141.8 | 184.49 | 253.76 | 322.57 | 407.3 | 497.78 | 652.92 | 809.9 | 1064.26 | 1314.36 | 1631.32 | 1969.06 | 2338.72 |
| 650.0 | -1.39 | 3.86 | 10.8 | 21.9 | 34.2 | 48.24 | 70.36 | 100.65 | 141.83 | 184.56 | 253.25 | 322.25 | 406.72 | 497.46 | 652.23 | 809.21 | 1063.59 | 1313.82 | 1630.5 | 1967.48 | 2336.74 |
| 651.0 | -1.59 | 3.62 | 10.71 | 21.7 | 33.92 | 48.16 | 70.22 | 100.35 | 141.33 | 184.31 | 253.02 | 322.13 | 406.63 | 497.04 | 652.08 | 809.32 | 1063.49 | 1314.28 | 1630.88 | 1967.39 | 2335.94 |
| 652.0 | -1.6 | 3.6 | 10.72 | 21.65 | 34.09 | 48.22 | 70.2 | 100.38 | 141.26 | 184.02 | 252.89 | 321.71 | 406.85 | 496.69 | 652.3 | 809.54 | 1063.53 | 1314.17 | 1630.6 | 1966.71 | 2335.74 |
| 653.0 | -1.75 | 3.59 | 10.77 | 21.67 | 34.04 | 48.23 | 70.31 | 100.33 | 141.42 | 183.93 | 252.51 | 321.89 | 406.62 | 496.47 | 652.27 | 809.91 | 1063.46 | 1313.98 | 1629.83 | 1966.76 | 2334.12 |
| 654.0 | -1.85 | 3.73 | 10.74 | 21.7 | 33.97 | 48.14 | 70.4 | 100.04 | 141.33 | 183.98 | 252.49 | 321.76 | 406.61 | 496.66 | 652.04 | 809.73 | 1063.66 | 1314.36 | 1629.78 | 1966.74 | 2333.35 |
| 655.0 | -1.7 | 3.75 | 10.85 | 21.76 | 34.03 | 48.36 | 70.36 | 100.09 | 141.45 | 183.85 | 252.58 | 321.54 | 406.64 | 496.96 | 652.28 | 809.84 | 1063.83 | 1314.66 | 1630.07 | 1966.88 | 2333.18 |
| 656.0 | -1.74 | 3.68 | 10.79 | 21.8 | 34.1 | 48.47 | 70.44 | 100.09 | 141.5 | 183.93 | 252.54 | 321.57 | 406.59 | 497 | 651.94 | 810.6 | 1063.89 | 1315.03 | 1629.91 | 1967.77 | 2334.15 |
| 657.0 | -1.68 | 3.72 | 10.9 | 21.73 | 34.18 | 48.61 | 70.48 | 99.98 | 141.34 | 183.82 | 252.24 | 321.49 | 406.3 | 497.04 | 651.86 | 810.85 | 1064.29 | 1315.12 | 1629.95 | 1968.02 | 2334.37 |
| 658.0 | -1.66 | 3.77 | 11.04 | 21.86 | 34.24 | 48.78 | 70.45 | 100.06 | 141.78 | 184.02 | 252.14 | 321.61 | 406.12 | 497.39 | 651.98 | 811.3 | 1064.9 | 1315.14 | 1630.74 | 1968.59 | 2335.18 |
| 659.0 | -1.82 | 3.51 | 11.11 | 21.84 | 34.29 | 48.84 | 70.35 | 99.87 | 141.71 | 183.97 | 252.23 | 321.54 | 405.77 | 497.69 | 652.06 | 812.12 | 1064.64 | 1315.19 | 1631.34 | 1969.09 | 2335.62 |
| 660.0 | -1.76 | 3.55 | 11.26 | 21.93 | 34.32 | 48.66 | 70.3 | 99.75 | 141.84 | 183.73 | 252.03 | 321.81 | 405.98 | 497.57 | 652 | 812.36 | 1064.81 | 1315.5 | 1631.56 | 1969.29 | 2335.91 |
| 661.0 | -1.7 | 3.54 | 11.41 | 22.01 | 34.17 | 48.84 | 70.19 | 99.64 | 141.94 | 183.62 | 252.08 | 322.09 | 405.85 | 497.83 | 652.16 | 812.03 | 1064.99 | 1315.82 | 1631.14 | 1969.14 | 2336.51 |
| 662.0 | -1.62 | 3.46 | 11.48 | 21.99 | 34.25 | 49.05 | 70.3 | 99.75 | 141.87 | 183.46 | 252.01 | 322.08 | 406.11 | 497.53 | 652.41 | 812.67 | 1065.69 | 1316.31 | 1631.81 | 1970.18 | 2337.96 |
| 663.0 | -1.61 | 3.43 | 11.57 | 21.89 | 34.4 | 49.09 | 70.38 | 99.74 | 142.02 | 183.35 | 252.06 | 322.3 | 406.32 | 497.46 | 652.33 | 812.92 | 1065.75 | 1316.77 | 1632.71 | 1970.89 | 2338.45 |
| 664.0 | -1.6 | 3.29 | 11.56 | 21.92 | 34.45 | 49.15 | 70.46 | 99.99 | 141.95 | 183.26 | 251.96 | 322.28 | 406.59 | 497.7 | 652.6 | 813.14 | 1066.18 | 1317.4 | 1632.47 | 1971.51 | 2339.31 |
| 665.0 | -1.6 | 3.4 | 11.49 | 22 | 34.45 | 49.22 | 70.6 | 99.89 | 141.93 | 183.31 | 251.77 | 322.31 | 406.61 | 497.78 | 652.94 | 812.5 | 1066.3 | 1317.32 | 1632.02 | 1971.95 | 2339.32 |
| 666.0 | -1.51 | 3.29 | 11.44 | 22.01 | 34.46 | 49.37 | 70.53 | 99.87 | 142.11 | 183.6 | 251.47 | 322.11 | 406.26 | 497.86 | 652.95 | 812.08 | 1066.52 | 1317.05 | 1632.05 | 1971.71 | 2339.38 |
| 667.0 | -1.47 | 3.3 | 11.57 | 22.09 | 34.58 | 49.28 | 70.47 | 99.79 | 141.84 | 183.69 | 250.99 | 321.86 | 405.91 | 497.7 | 652.53 | 811.42 | 1066.52 | 1317.05 | 1631.63 | 1971.82 | 2338.64 |
| 668.0 | -1.54 | 3.28 | 11.55 | 22.06 | 34.49 | 49.17 | 70.48 | 99.64 | 141.52 | 183.58 | 250.82 | 321.7 | 405.78 | 497.85 | 652.23 | 811.05 | 1065.89 | 1317.12 | 1631.33 | 1971.26 | 2338.26 |
| 669.0 | -1.53 | 3.2 | 11.5 | 22.19 | 34.52 | 49.12 | 70.33 | 99.57 | 141.3 | 183.64 | 250.43 | 321.64 | 405.73 | 497.52 | 651.45 | 810.55 | 1065.49 | 1316.43 | 1630.29 | 1969.88 | 2337.18 |
| 670.0 | -1.56 | 3.3 | 11.73 | 22.32 | 34.63 | 49.15 | 70.24 | 99.7 | 141.16 | 183.28 | 250.35 | 321.31 | 405.26 | 497.13 | 651.17 | 809.98 | 1064.48 | 1315.25 | 1629.39 | 1969.02 | 2336.03 |
| 671.0 | -1.54 | 3.34 | 11.78 | 22.19 | 34.85 | 49.01 | 70.12 | 99.56 | 141.08 | 183.02 | 250.27 | 320.95 | 404.69 | 496.72 | 651.21 | 809.12 | 1063.86 | 1313.84 | 1627.87 | 1967.78 | 2334.41 |
| 672.0 | -1.61 | 3.39 | 11.77 | 22.2 | 34.76 | 48.78 | 70.01 | 99.43 | 141.01 | 182.59 | 249.51 | 320.18 | 404 | 495.78 | 650.11 | 807.8 | 1062 | 1311.92 | 1625.47 | 1965.77 | 2332.05 |
| 673.0 | -1.55 | 3.52 | 11.71 | 22.17 | 34.7 | 48.56 | 69.7 | 99.18 | 140.5 | 182.56 | 249.21 | 319.54 | 403.27 | 495.1 | 649.05 | 806.56 | 1060.57 | 1310 | 1623.72 | 1963.21 | 2328.5 |
| 674.0 | -1.49 | 3.54 | 11.86 | 22.19 | 34.61 | 48.59 | 69.57 | 98.87 | 140.1 | 182.19 | 249.07 | 319.19 | 402.5 | 494.34 | 647.57 | 805.31 | 1058.77 | 1307.42 | 1621.47 | 1960.18 | 2325.02 |
| 675.0 | -1.68 | 3.37 | 11.76 | 21.96 | 34.35 | 48.36 | 69.12 | 98.58 | 139.58 | 181.71 | 248.53 | 318.17 | 401.62 | 493.13 | 646.2 | 803.73 | 1056.53 | 1304.54 | 1618.01 | 1956.06 | 2320.03 |
| 676.0 | -1.77 | 3.33 | 11.69 | 21.78 | 34.28 | 48.03 | 68.94 | 98.14 | 139.21 | 181.3 | 247.87 | 317.33 | 400.54 | 491.77 | 644.45 | 801.72 | 1053.73 | 1301.16 | 1613.54 | 1951 | 2314.63 |
| 677.0 | -1.88 | 3.19 | 11.48 | 21.56 | 33.99 | 47.73 | 68.74 | 97.65 | 138.59 | 180.58 | 246.87 | 316.2 | 399.32 | 490.25 | 642.66 | 798.89 | 1050 | 1297.61 | 1609.26 | 1945.58 | 2307.31 |
| 678.0 | -1.93 | 3.06 | 11.19 | 21.39 | 33.61 | 47.38 | 68.39 | 97.18 | 138.29 | 180.07 | 246.2 | 315.22 | 398.14 | 488.29 | 640.47 | 796.2 | 1046.46 | 1293.83 | 1604.51 | 1939.44 | 2300.81 |
| 679.0 | -1.97 | 3 | 11.07 | 21.2 | 33.29 | 47.16 | 68.19 | 96.88 | 137.4 | 179.2 | 245.29 | 314.12 | 396.86 | 486.65 | 638.56 | 793.74 | 1043.03 | 1289.42 | 1598.99 | 1934.38 | 2293.96 |
| 680.0 | -1.76 | 3.18 | 11.14 | 21.29 | 33.2 | 47 | 67.97 | 96.79 | 137.09 | 178.6 | 244.52 | 313.04 | 395.83 | 484.89 | 636.42 | 790.45 | 1039.75 | 1285.36 | 1593.17 | 1927.95 | 2287.61 |
| 681.0 | -1.79 | 3.21 | 11.06 | 21.05 | 33.08 | 46.92 | 67.69 | 96.38 | 136.55 | 177.97 | 243.51 | 311.58 | 394.16 | 483.33 | 633.72 | 787.39 | 1035.81 | 1280.26 | 1586.68 | 1921.5 | 2280.23 |
| 682.0 | -1.92 | 3.3 | 10.88 | 20.88 | 32.77 | 46.69 | 67.42 | 96.1 | 136.01 | 177.15 | 242.42 | 310.25 | 392.58 | 481.08 | 630.8 | 784.36 | 1031.64 | 1274.82 | 1580.49 | 1914.1 | 2271.75 |
| 683.0 | -1.86 | 3.31 | 10.87 | 20.87 | 32.48 | 46.58 | 67.18 | 95.67 | 135.43 | 176.31 | 241.49 | 308.82 | 390.67 | 479.28 | 627.99 | 780.49 | 1026.86 | 1269.19 | 1573.7 | 1905.75 | 2261.8 |
| 684.0 | -1.95 | 3.19 | 10.45 | 20.65 | 32.08 | 46.48 | 66.6 | 94.89 | 134.2 | 175.24 | 239.78 | 306.66 | 388.55 | 476.9 | 624.89 | 776.41 | 1021.77 | 1262.52 | 1565.69 | 1896.37 | 2250.95 |
| 685.0 | -2.1 | 3.27 | 10.28 | 20.22 | 31.69 | 46.02 | 65.92 | 94.1 | 133.34 | 174.19 | 238.35 | 304.74 | 386.4 | 474.38 | 621.19 | 771.93 | 1015.61 | 1255.23 | 1557.91 | 1885.69 | 2239.67 |
| 686.0 | -2.13 | 3.04 | 10.14 | 19.95 | 31.43 | 45.55 | 65.15 | 93.41 | 132.45 | 173.12 | 236.96 | 302.94 | 384.39 | 471.78 | 617.39 | 767.66 | 1009.66 | 1248.24 | 1549.5 | 1875.58 | 2228.36 |
| 687.0 | -2.21 | 3.01 | 10.11 | 19.87 | 31.46 | 45.17 | 64.82 | 92.82 | 131.43 | 172.11 | 235.81 | 301 | 382.58 | 469.16 | 613.9 | 763.58 | 1003.77 | 1241.38 | 1541.27 | 1865.06 | 2216.93 |
| 688.0 | -2.32 | 2.94 | 9.92 | 19.61 | 31.05 | 44.92 | 64.29 | 92.06 | 130.71 | 170.78 | 234.37 | 299.16 | 380.22 | 466.38 | 610.25 | 759.09 | 997.41 | 1233.79 | 1532.4 | 1853.82 | 2205.43 |
| 689.0 | -2.46 | 2.79 | 9.74 | 19.34 | 30.86 | 44.54 | 63.65 | 91.52 | 129.81 | 169.76 | 232.75 | 297.17 | 377.78 | 463.48 | 606.88 | 754.47 | 991.31 | 1225.9 | 1523.53 | 1842.83 | 2192.54 |
| 690.0 | -2.57 | 2.76 | 9.6 | 18.94 | 30.63 | 44.25 | 63.24 | 90.89 | 128.83 | 168.61 | 231.09 | 295.24 | 375.18 | 460.47 | 602.9 | 749.93 | 984.68 | 1217.46 | 1513.34 | 1831.15 | 2179.2 |
| 691.0 | -2.48 | 2.7 | 9.52 | 18.77 | 30.5 | 44.04 | 62.8 | 90.26 | 128.01 | 167.56 | 229.5 | 293.3 | 372.56 | 457.19 | 598.74 | 745.46 | 978.29 | 1209.36 | 1502.58 | 1818.93 | 2165.77 |
| 692.0 | -2.66 | 2.51 | 9.19 | 18.58 | 30.02 | 43.64 | 62.31 | 89.42 | 126.95 | 166.03 | 227.87 | 291.16 | 370.04 | 453.97 | 594.16 | 740.62 | 971.36 | 1201.59 | 1492.32 | 1805.24 | 2151.3 |
| 693.0 | -2.74 | 2.29 | 9 | 18.21 | 29.62 | 43.29 | 61.69 | 88.55 | 125.83 | 164.76 | 226.3 | 289.19 | 367.31 | 451 | 590.13 | 735.1 | 964.52 | 1193.04 | 1481.62 | 1791.93 | 2137.34 |
| 694.0 | -2.87 | 2.02 | 8.89 | 17.96 | 29.4 | 42.76 | 61.49 | 87.86 | 125.03 | 163.59 | 224.42 | 287.26 | 364.62 | 448 | 585.98 | 729.79 | 957.57 | 1184.71 | 1470.7 | 1779.06 | 2123.59 |
| 695.0 | -2.97 | 1.93 | 8.67 | 17.74 | 29.21 | 42.36 | 60.95 | 87.49 | 124.22 | 162.32 | 222.46 | 284.94 | 362.25 | 444.76 | 581.61 | 724.27 | 950.32 | 1176.31 | 1460.28 | 1766.43 | 2109.25 |
| 696.0 | -3 | 1.86 | 8.49 | 17.56 | 29 | 42.18 | 60.47 | 86.91 | 123.35 | 161.07 | 220.8 | 282.9 | 359.64 | 441.83 | 577.38 | 718.86 | 943.14 | 1168.07 | 1450.51 | 1754.13 | 2095.29 |
| 697.0 | -3.1 | 1.71 | 8.35 | 17.27 | 28.52 | 41.78 | 60.09 | 86.12 | 122.34 | 159.76 | 219.06 | 280.87 | 357.11 | 438.46 | 572.92 | 713.54 | 935.83 | 1158.7 | 1440.19 | 1741.27 | 2080.84 |
| 698.0 | -3.19 | 1.58 | 8.33 | 17.05 | 28.41 | 41.34 | 59.38 | 85.3 | 121.32 | 158.61 | 217.45 | 278.7 | 354.47 | 435.31 | 568.52 | 707.94 | 929.03 | 1149.51 | 1429.29 | 1727.66 | 2066.23 |
| 699.0 | -3.3 | 1.5 | 8.32 | 16.87 | 28.32 | 41.03 | 58.87 | 84.69 | 120.37 | 157.3 | 215.48 | 276.39 | 351.57 | 432.27 | 564.42 | 702.49 | 921.55 | 1140.41 | 1418.37 | 1715.2 | 2051.47 |
| 700.0 | -3.38 | 1.35 | 8.22 | 16.68 | 28.18 | 40.73 | 58.46 | 83.84 | 119.41 | 156.14 | 213.92 | 274.37 | 349 | 428.95 | 559.92 | 696.9 | 914.12 | 1131.66 | 1407.38 | 1700.63 | 2036.28 |
| 701.0 | -3.56 | 1.21 | 7.89 | 16.28 | 27.79 | 40.26 | 57.91 | 83.04 | 118.11 | 154.85 | 211.88 | 272.1 | 346.06 | 425.52 | 555.56 | 691.45 | 906.83 | 1122.92 | 1396.61 | 1687.55 | 2020.22 |
| 702.0 | -3.6 | 0.99 | 7.62 | 16.05 | 27.52 | 39.84 | 57.3 | 82.45 | 117.08 | 153.48 | 210.15 | 269.84 | 343.63 | 422.05 | 551.19 | 686.17 | 899.41 | 1114.25 | 1385.88 | 1674.6 | 2004.44 |
| 703.0 | -3.7 | 0.72 | 7.49 | 15.76 | 27.23 | 39.2 | 56.6 | 81.43 | 115.86 | 152.12 | 208.25 | 267.25 | 340.61 | 418.57 | 546.78 | 680.6 | 892.01 | 1104.86 | 1374.65 | 1661.4 | 1988.66 |
| 704.0 | -3.83 | 0.72 | 7.43 | 15.57 | 27.09 | 38.66 | 56.01 | 80.46 | 114.84 | 150.95 | 206.28 | 265.15 | 337.76 | 415.01 | 542.37 | 674.82 | 884.7 | 1095.58 | 1363.43 | 1647.58 | 1972.98 |
| 705.0 | -3.81 | 0.77 | 7.44 | 15.43 | 26.68 | 38 | 55.59 | 79.83 | 114.1 | 149.83 | 204.66 | 262.86 | 334.92 | 411.68 | 537.76 | 669.26 | 877.22 | 1086.62 | 1352.03 | 1633.79 | 1957 |
| 706.0 | -3.68 | 0.85 | 7.38 | 15.51 | 26.55 | 37.77 | 55.3 | 79.13 | 113.39 | 148.72 | 203.2 | 260.92 | 332.47 | 408.56 | 533.48 | 664.17 | 870.7 | 1077.74 | 1341.56 | 1621.38 | 1941.63 |
| 707.0 | -3.65 | 0.87 | 7.32 | 15.38 | 26.32 | 37.54 | 55.04 | 78.44 | 112.51 | 147.55 | 201.54 | 258.85 | 329.93 | 405.45 | 529.29 | 659.2 | 863.9 | 1069.1 | 1330.5 | 1608.39 | 1926.84 |
| 708.0 | -3.81 | 0.78 | 7.07 | 15.07 | 25.74 | 37.04 | 54.55 | 77.65 | 111.36 | 145.85 | 199.67 | 256.89 | 326.93 | 402 | 524.79 | 653.62 | 856.3 | 1059.94 | 1318.84 | 1595.18 | 1910.53 |
| 709.0 | -3.93 | 0.62 | 6.9 | 14.78 | 25.3 | 36.56 | 54.08 | 76.91 | 110.16 | 144.51 | 197.99 | 254.4 | 324.16 | 398.31 | 519.97 | 648.15 | 848.23 | 1050.37 | 1306.56 | 1580.93 | 1893.47 |
| 710.0 | -4.11 | 0.34 | 6.5 | 14.45 | 24.9 | 36.14 | 53.52 | 75.89 | 109.11 | 142.88 | 196.01 | 252.08 | 321.36 | 394.52 | 514.92 | 641.87 | 839.99 | 1040.39 | 1293.86 | 1566.48 | 1876.68 |
| 711.0 | -4.23 | 0.19 | 6.34 | 14.33 | 24.52 | 35.59 | 52.87 | 75 | 108.03 | 141.23 | 194.12 | 249.14 | 318.57 | 390.87 | 509.76 | 635.76 | 831.81 | 1030.25 | 1281.93 | 1551.47 | 1858.92 |
| 712.0 | -4.33 | 0.11 | 6.16 | 14.05 | 24.14 | 35.2 | 52.3 | 74.03 | 106.78 | 139.69 | 192.14 | 246.63 | 315.67 | 387.51 | 504.74 | 629.05 | 823.91 | 1020.06 | 1270.04 | 1536.31 | 1840.66 |
| 713.0 | -4.33 | -0.03 | 6.16 | 13.88 | 23.94 | 34.85 | 51.78 | 73.23 | 105.59 | 138.33 | 189.98 | 244.07 | 312.56 | 383.59 | 499.83 | 622.67 | 815.77 | 1008.91 | 1256.9 | 1521.69 | 1822.03 |
| 714.0 | -4.27 | -0.07 | 6.01 | 13.77 | 23.73 | 34.39 | 51.18 | 72.45 | 104.49 | 137.01 | 187.96 | 241.66 | 309.58 | 379.86 | 494.8 | 616.64 | 807.1 | 998.44 | 1243.99 | 1506.22 | 1802.27 |
| 715.0 | -4.32 | -0.19 | 5.87 | 13.58 | 23.41 | 33.98 | 50.34 | 71.61 | 103.3 | 135.4 | 186.12 | 239.07 | 306.49 | 375.9 | 489.59 | 609.99 | 798.37 | 987.57 | 1230.89 | 1490.21 | 1782.89 |
| 716.0 | -4.43 | -0.35 | 5.59 | 13.24 | 23.07 | 33.47 | 49.66 | 70.54 | 101.79 | 133.86 | 184.23 | 236.58 | 303.27 | 372.07 | 484.46 | 603.4 | 789.76 | 976.89 | 1217.39 | 1473.76 | 1764.19 |
| 717.0 | -4.39 | -0.53 | 5.48 | 12.99 | 22.85 | 32.85 | 49.22 | 69.68 | 100.57 | 132.37 | 182.3 | 234.27 | 300.32 | 368.24 | 479.52 | 596.98 | 781.2 | 966.08 | 1203.94 | 1457.93 | 1745.52 |
| 718.0 | -4.43 | -0.56 | 5.31 | 13.07 | 22.63 | 32.46 | 48.7 | 69.15 | 99.5 | 130.92 | 180.43 | 231.68 | 297.28 | 364.84 | 475.04 | 591.17 | 773.15 | 956.38 | 1191.37 | 1443.43 | 1728.05 |
| 719.0 | -4.47 | -0.56 | 5.08 | 12.92 | 22.29 | 32 | 48.25 | 68.46 | 98.52 | 129.48 | 178.32 | 229.25 | 294.11 | 360.94 | 470.45 | 585.48 | 765.17 | 946.83 | 1179.7 | 1429.14 | 1711.43 |
| 720.0 | -4.7 | -0.79 | 4.84 | 12.67 | 21.79 | 31.45 | 47.58 | 67.71 | 97.35 | 128.09 | 176.51 | 226.92 | 291.44 | 357.51 | 465.78 | 579.84 | 757.7 | 937.25 | 1168.07 | 1414.61 | 1694.13 |
| 721.0 | -4.71 | -0.83 | 4.6 | 12.46 | 21.48 | 31.06 | 46.91 | 67.13 | 96.46 | 126.74 | 174.63 | 224.66 | 288.41 | 354.14 | 461.24 | 574.01 | 750.45 | 927.95 | 1156.46 | 1401.13 | 1677.75 |
| 722.0 | -4.68 | -0.76 | 4.71 | 12.41 | 21.27 | 30.71 | 46.5 | 66.58 | 95.8 | 125.43 | 173.43 | 222.61 | 285.76 | 351.08 | 457.04 | 568.79 | 743.17 | 918.66 | 1145.12 | 1387.81 | 1662.36 |
| 723.0 | -4.83 | -0.9 | 4.54 | 12.17 | 20.92 | 30.31 | 45.87 | 65.73 | 94.87 | 124.38 | 171.93 | 220.68 | 283.09 | 348.07 | 453.07 | 563.52 | 736.51 | 910.47 | 1134.1 | 1374.02 | 1647.64 |
| 724.0 | -4.91 | -1.01 | 4.39 | 12.01 | 20.87 | 30.19 | 45.48 | 65.31 | 93.97 | 123.3 | 170.43 | 219.03 | 281.01 | 345.32 | 449.18 | 558.95 | 730.35 | 902.89 | 1124.37 | 1361.51 | 1633.44 |
| 725.0 | -5.09 | -1.31 | 4.02 | 11.59 | 20.44 | 29.71 | 44.89 | 64.69 | 93.04 | 122.11 | 168.91 | 216.99 | 278.72 | 342.42 | 445.74 | 554.45 | 723.74 | 895.68 | 1114.48 | 1349.62 | 1619.61 |
| 726.0 | -5.23 | -1.46 | 3.99 | 11.33 | 20.36 | 29.61 | 44.5 | 64.21 | 92.09 | 121.04 | 167.29 | 215.41 | 276.52 | 339.61 | 442.67 | 550.04 | 717.66 | 888.1 | 1105.02 | 1338.6 | 1606.73 |
| 727.0 | -5.42 | -1.69 | 3.86 | 11.07 | 20.02 | 29.17 | 43.98 | 63.5 | 91.08 | 119.87 | 165.91 | 213.53 | 274.29 | 336.76 | 439.4 | 545.46 | 711.38 | 880.42 | 1095.07 | 1327.63 | 1593.68 |
| 728.0 | -5.45 | -1.8 | 3.76 | 10.94 | 19.73 | 28.91 | 43.49 | 62.92 | 90.16 | 118.84 | 164.72 | 211.94 | 272.1 | 334.14 | 436.01 | 541.31 | 705.88 | 873.24 | 1086.72 | 1316.86 | 1580.97 |
| 729.0 | -5.44 | -2 | 3.48 | 10.72 | 19.61 | 28.79 | 43.14 | 62.5 | 89.57 | 118.1 | 163.72 | 210.2 | 270.23 | 331.97 | 432.92 | 537.56 | 700.84 | 866.43 | 1078.8 | 1306.72 | 1570.42 |
| 730.0 | -5.44 | -2.05 | 3.33 | 10.72 | 19.57 | 28.57 | 42.92 | 62.14 | 89.13 | 117.37 | 162.67 | 209.18 | 268.43 | 329.92 | 430.14 | 534.17 | 696.46 | 860.55 | 1072.03 | 1297.88 | 1559.83 |
| 731.0 | -5.44 | -1.94 | 3.38 | 10.7 | 19.33 | 28.34 | 42.75 | 61.92 | 88.52 | 116.56 | 161.88 | 208.03 | 266.81 | 328.2 | 427.77 | 531.3 | 692.13 | 855.02 | 1065.4 | 1289.38 | 1550.32 |
| 732.0 | -5.42 | -1.96 | 3.28 | 10.46 | 19.19 | 28.04 | 42.5 | 61.51 | 87.91 | 115.88 | 160.85 | 206.9 | 265.14 | 326.34 | 425.66 | 527.96 | 688.26 | 850.44 | 1059.24 | 1282.23 | 1541.9 |
| 733.0 | -5.38 | -2.02 | 3.05 | 10.3 | 18.94 | 27.71 | 42.13 | 61.16 | 87.5 | 115.22 | 159.86 | 205.76 | 263.64 | 324.29 | 423.44 | 525.31 | 684.34 | 845.88 | 1052.81 | 1275.37 | 1533.62 |
| 734.0 | -5.55 | -1.93 | 2.86 | 10.19 | 18.73 | 27.46 | 41.74 | 60.88 | 87 | 114.56 | 159.13 | 204.77 | 262.24 | 322.85 | 421.35 | 522.57 | 681.27 | 842.41 | 1047.51 | 1269.07 | 1526.78 |
| 735.0 | -5.66 | -1.91 | 2.78 | 10.07 | 18.52 | 27.33 | 41.68 | 60.7 | 86.85 | 113.96 | 158.67 | 203.79 | 261.2 | 321.46 | 419.68 | 520.12 | 678.7 | 838.51 | 1042.93 | 1263.96 | 1520.83 |
| 736.0 | -5.6 | -1.83 | 2.75 | 10.03 | 18.41 | 27.26 | 41.66 | 60.42 | 86.48 | 113.52 | 157.94 | 203.13 | 260.16 | 320.2 | 418.41 | 518.14 | 675.95 | 835.09 | 1038.49 | 1259.33 | 1514.55 |
| 737.0 | -5.6 | -1.76 | 2.8 | 9.95 | 18.22 | 27.08 | 41.58 | 60.22 | 86.3 | 112.98 | 157.47 | 202.25 | 258.95 | 318.83 | 416.84 | 516.13 | 672.8 | 831.37 | 1033.73 | 1253.92 | 1507.61 |
| 738.0 | -5.71 | -1.68 | 2.61 | 9.91 | 17.92 | 26.98 | 41.27 | 59.82 | 85.85 | 112.64 | 156.7 | 201.25 | 257.49 | 317.47 | 415 | 514.2 | 670.54 | 827.96 | 1028.95 | 1248.53 | 1501.42 |
| 739.0 | -5.92 | -1.83 | 2.43 | 9.53 | 17.63 | 26.75 | 40.7 | 59.21 | 85.22 | 111.93 | 155.99 | 200.26 | 256.02 | 315.91 | 412.84 | 511.8 | 667.93 | 824.83 | 1024.33 | 1242.7 | 1495.06 |
| 740.0 | -5.87 | -1.84 | 2.45 | 9.48 | 17.47 | 26.72 | 40.52 | 59.08 | 84.87 | 111.39 | 155.44 | 199.63 | 255.29 | 314.73 | 410.96 | 509.89 | 665.46 | 820.99 | 1019.47 | 1236.89 | 1487.81 |
| 741.0 | -5.87 | -1.87 | 2.36 | 9.36 | 17.34 | 26.54 | 40.27 | 58.94 | 84.47 | 110.98 | 154.83 | 198.68 | 254.09 | 313.53 | 408.9 | 507.65 | 662.56 | 817.22 | 1014.77 | 1230.96 | 1480.87 |
| 742.0 | -6.03 | -1.97 | 2.3 | 9.16 | 17.16 | 26.24 | 40.05 | 58.61 | 83.96 | 110.48 | 154.24 | 197.5 | 252.94 | 312.06 | 406.82 | 505.28 | 659.4 | 813.68 | 1009.46 | 1224.78 | 1473.43 |
| 743.0 | -6.05 | -2.07 | 2.26 | 9.01 | 17.11 | 26.04 | 39.85 | 58.14 | 83.32 | 109.93 | 153.11 | 196.39 | 251.62 | 310.19 | 404.44 | 502.58 | 656.17 | 809.8 | 1004.09 | 1218.15 | 1465.1 |
| 744.0 | -6.05 | -2.08 | 2.27 | 9.04 | 16.98 | 25.8 | 39.86 | 57.93 | 82.73 | 109.24 | 152.16 | 195.26 | 250.21 | 308.48 | 402.19 | 499.83 | 652.58 | 805.04 | 999.01 | 1211.63 | 1456.83 |
| 745.0 | -5.97 | -2.03 | 2.34 | 8.93 | 16.83 | 25.51 | 39.74 | 57.75 | 82.41 | 108.68 | 151.27 | 193.94 | 248.62 | 306.66 | 399.91 | 497.03 | 648.38 | 800.34 | 992.61 | 1204.53 | 1448.46 |
| 746.0 | -5.96 | -1.89 | 2.35 | 8.99 | 16.72 | 25.38 | 39.51 | 57.45 | 82.03 | 107.95 | 150.32 | 192.91 | 247.18 | 304.95 | 397.11 | 494.38 | 644.76 | 794.93 | 986.56 | 1197.07 | 1439.15 |
| 747.0 | -5.87 | -1.88 | 2.19 | 9.01 | 16.58 | 25.13 | 39.12 | 57.07 | 81.57 | 107.28 | 149.65 | 191.67 | 245.47 | 303.33 | 394.63 | 491.37 | 640.89 | 789.89 | 980.34 | 1189.36 | 1430.04 |
| 748.0 | -5.78 | -1.84 | 2.14 | 8.82 | 16.46 | 25.19 | 38.96 | 56.91 | 81.14 | 106.6 | 148.65 | 190.5 | 243.66 | 301.43 | 392.07 | 488.32 | 636.81 | 785.43 | 974.39 | 1181.18 | 1420.52 |
| 749.0 | -5.94 | -1.98 | 1.92 | 8.64 | 16.19 | 24.75 | 38.66 | 56.5 | 80.55 | 105.73 | 147.35 | 189.01 | 241.85 | 299.33 | 389.49 | 484.6 | 632.42 | 780.44 | 967.5 | 1173.03 | 1410.03 |
| 750.0 | -6.05 | -1.91 | 1.95 | 8.46 | 15.95 | 24.42 | 38.22 | 55.96 | 79.75 | 104.88 | 145.92 | 187.55 | 239.9 | 296.96 | 386.79 | 481.01 | 628.06 | 775.01 | 960.3 | 1164.66 | 1398.82 |
| 751.0 | -6.1 | -1.96 | 1.97 | 8.3 | 15.71 | 24.21 | 37.8 | 55.39 | 78.92 | 104.17 | 144.63 | 186.11 | 238.42 | 294.65 | 383.98 | 477.21 | 623.44 | 769.02 | 952.74 | 1155.75 | 1388.24 |
| 752.0 | -6.08 | -2.16 | 1.96 | 8.18 | 15.65 | 23.96 | 37.47 | 55.02 | 78.43 | 103.53 | 143.47 | 184.55 | 236.55 | 292.44 | 381.02 | 473.63 | 618.81 | 763.42 | 945.26 | 1146.92 | 1376.96 |
| 753.0 | -6.11 | -2.26 | 1.83 | 8.16 | 15.39 | 23.84 | 37.14 | 54.59 | 77.8 | 102.99 | 142.5 | 183.22 | 234.62 | 290.24 | 378.04 | 470.11 | 614.23 | 757.38 | 937.59 | 1137.88 | 1365.82 |
| 754.0 | -6.18 | -2.17 | 1.93 | 8.12 | 15.33 | 23.65 | 36.96 | 54.32 | 77.34 | 102.34 | 141.46 | 181.86 | 232.92 | 288.18 | 375.42 | 466.49 | 609.53 | 751.64 | 930.84 | 1129.12 | 1354.87 |
| 755.0 | -6.12 | -2.21 | 1.94 | 7.99 | 15.2 | 23.52 | 36.61 | 53.68 | 76.84 | 101.43 | 140.17 | 180.39 | 231.16 | 285.72 | 372.37 | 462.82 | 604.24 | 745.43 | 923.57 | 1119.82 | 1343.78 |
| 756.0 | -6.15 | -2.24 | 1.86 | 7.91 | 15.11 | 23.39 | 36.19 | 53.1 | 76.13 | 100.73 | 138.62 | 178.97 | 229.13 | 283.3 | 369.57 | 459.06 | 599.17 | 739.51 | 915.87 | 1110.24 | 1332.41 |
| 757.0 | -6.26 | -2.37 | 1.77 | 7.75 | 14.92 | 23.16 | 35.83 | 52.64 | 75.63 | 99.93 | 137.52 | 177.5 | 227.32 | 280.89 | 366.31 | 455.22 | 594.46 | 732.86 | 907.56 | 1100.15 | 1320.51 |
| 758.0 | -6.2 | -2.42 | 1.67 | 7.73 | 14.84 | 22.91 | 35.47 | 52.25 | 75 | 99.14 | 135.9 | 176 | 225.55 | 278.62 | 363.23 | 451.32 | 589.79 | 726.94 | 899.88 | 1090.6 | 1309.11 |
| 759.0 | -6.08 | -2.39 | 1.77 | 7.72 | 14.87 | 22.85 | 35.24 | 51.98 | 74.44 | 98.19 | 134.79 | 174.71 | 223.79 | 276.18 | 360.06 | 447.56 | 584.53 | 720.6 | 891.96 | 1080.66 | 1297.71 |
| 760.0 | -6.03 | -2.44 | 1.69 | 7.7 | 14.87 | 22.65 | 35.02 | 51.55 | 73.76 | 97.4 | 133.44 | 173.19 | 221.97 | 273.6 | 356.95 | 443.74 | 579.32 | 713.6 | 883.69 | 1070.6 | 1285.05 |
| 761.0 | -6.22 | -2.57 | 1.47 | 7.46 | 14.47 | 22.32 | 34.62 | 50.81 | 72.85 | 96.46 | 132.29 | 171.49 | 219.73 | 270.92 | 353.68 | 439.61 | 573.94 | 707.08 | 875.52 | 1060.8 | 1273.19 |
| 762.0 | -6.17 | -2.64 | 1.36 | 7.33 | 14.19 | 22.11 | 34.15 | 50.13 | 72.12 | 95.27 | 130.83 | 169.89 | 217.64 | 268.15 | 350.27 | 435.45 | 568.44 | 700.88 | 867.02 | 1050.66 | 1260.87 |
| 763.0 | -6.01 | -2.55 | 1.4 | 7.35 | 14.1 | 22.01 | 33.75 | 49.51 | 71.46 | 94.31 | 129.49 | 168.22 | 215.48 | 265.64 | 347.08 | 431.47 | 563.2 | 694 | 858.76 | 1040.22 | 1248.51 |
| 764.0 | -6.09 | -2.66 | 1.19 | 7.09 | 13.73 | 21.84 | 33.26 | 49.2 | 70.6 | 93.42 | 128.21 | 166.52 | 213.49 | 263.19 | 344.01 | 427.39 | 558.39 | 687.04 | 850.78 | 1030.03 | 1236.8 |
| 765.0 | -6.09 | -2.72 | 0.97 | 6.83 | 13.53 | 21.51 | 32.91 | 48.6 | 70.07 | 92.43 | 127.02 | 164.73 | 211.38 | 260.44 | 340.85 | 423.19 | 552.98 | 680.37 | 842.48 | 1020.16 | 1224.48 |
| 766.0 | -6.24 | -2.97 | 0.6 | 6.47 | 13.16 | 21.16 | 32.24 | 47.87 | 69.08 | 91.49 | 125.5 | 163.13 | 209.19 | 257.86 | 337.4 | 418.79 | 547.7 | 673.67 | 834.58 | 1010.2 | 1212.06 |
| 767.0 | -6.41 | -3.21 | 0.41 | 6.17 | 13.01 | 20.85 | 31.83 | 47.33 | 68.22 | 90.53 | 124.09 | 161.44 | 206.92 | 255.24 | 333.96 | 414.55 | 542.15 | 667.15 | 826.35 | 999.9 | 1199.94 |
| 768.0 | -6.55 | -3.33 | 0.36 | 5.91 | 12.85 | 20.62 | 31.41 | 46.74 | 67.38 | 89.64 | 122.68 | 159.75 | 204.94 | 252.5 | 330.38 | 410.48 | 537.18 | 660.76 | 818.48 | 990.17 | 1187.33 |
| 769.0 | -6.69 | -3.62 | 0.21 | 5.76 | 12.57 | 20.09 | 30.87 | 46.05 | 66.49 | 88.66 | 121.16 | 158.04 | 202.9 | 249.87 | 327.08 | 406.41 | 531.99 | 653.93 | 810.21 | 980.44 | 1175.22 |
| 770.0 | -6.81 | -3.76 | -0.02 | 5.58 | 12.32 | 19.74 | 30.45 | 45.46 | 65.84 | 87.74 | 119.88 | 156.58 | 200.73 | 247.2 | 323.62 | 402.63 | 526.28 | 647.03 | 802.03 | 970.01 | 1163.57 |
| 771.0 | -6.84 | -3.87 | -0.14 | 5.36 | 12.05 | 19.53 | 30.15 | 44.92 | 65.31 | 86.8 | 118.82 | 155.12 | 198.57 | 244.95 | 320.41 | 398.87 | 521.05 | 640.39 | 794.03 | 960.19 | 1152.49 |
| 772.0 | -6.92 | -4 | -0.24 | 5.18 | 11.87 | 19.19 | 29.66 | 44.45 | 64.64 | 85.85 | 117.7 | 153.45 | 196.16 | 242.57 | 317.53 | 395.07 | 516.24 | 634.14 | 786.1 | 950.55 | 1140.61 |
| 773.0 | -7.08 | -3.99 | -0.41 | 4.95 | 11.53 | 18.97 | 29.04 | 43.72 | 63.83 | 84.85 | 116.24 | 151.88 | 193.91 | 239.9 | 314 | 391.26 | 510.95 | 627.62 | 778.26 | 940.45 | 1128.95 |
| 774.0 | -7.26 | -4.06 | -0.49 | 4.77 | 11.42 | 18.62 | 28.7 | 43.21 | 63.25 | 83.81 | 114.89 | 150.23 | 191.93 | 237.46 | 310.88 | 387.33 | 505.97 | 621.74 | 770.8 | 930.73 | 1117.2 |
| 775.0 | -7.42 | -4.35 | -0.84 | 4.56 | 11.13 | 18.29 | 28.15 | 42.43 | 62.17 | 82.67 | 113.68 | 148.62 | 189.63 | 235.01 | 307.31 | 383.58 | 500.87 | 614.99 | 762.74 | 920.46 | 1105.4 |
| 776.0 | -7.5 | -4.63 | -0.97 | 4.43 | 10.9 | 17.77 | 27.71 | 41.95 | 61.35 | 81.62 | 112.56 | 146.94 | 187.42 | 232.78 | 304.11 | 379.69 | 495.39 | 608.72 | 754.55 | 910.84 | 1093.34 |
| 777.0 | -7.5 | -4.75 | -1.08 | 4.21 | 10.52 | 17.39 | 27.15 | 41.28 | 60.55 | 80.38 | 111.22 | 145.33 | 185.38 | 230.21 | 300.33 | 375.85 | 490.48 | 602.58 | 746.77 | 901.58 | 1081.95 |
| 778.0 | -7.63 | -4.89 | -1.37 | 4.01 | 10.3 | 17.03 | 26.64 | 40.64 | 59.54 | 79.36 | 109.77 | 143.3 | 183.34 | 227.71 | 296.87 | 371.93 | 485.15 | 596.64 | 739.38 | 892.56 | 1070.57 |
| 779.0 | -7.84 | -5.08 | -1.59 | 3.82 | 10 | 16.78 | 26.13 | 39.95 | 58.81 | 78.22 | 108.83 | 141.58 | 181.11 | 225.18 | 293.65 | 368.34 | 480.25 | 590.6 | 731.97 | 883.36 | 1059.47 |
| 780.0 | -7.95 | -5.23 | -1.8 | 3.5 | 9.59 | 16.33 | 25.61 | 39.3 | 58.11 | 77.15 | 107.38 | 139.96 | 178.94 | 222.68 | 290.46 | 364.29 | 475.07 | 584.5 | 724.68 | 874.39 | 1047.88 |
| 781.0 | -7.94 | -5.28 | -1.81 | 3.38 | 9.26 | 16.04 | 25.22 | 38.85 | 57.44 | 76.21 | 106.09 | 138.56 | 177.18 | 220.76 | 287.42 | 360.35 | 470.58 | 578.57 | 717.3 | 865.53 | 1037.03 |
| 782.0 | -7.88 | -5.38 | -1.82 | 3.31 | 9.2 | 15.84 | 24.81 | 38.48 | 56.85 | 75.31 | 104.68 | 137.06 | 175.29 | 218.61 | 284.44 | 356.89 | 465.62 | 572.79 | 709.88 | 856.51 | 1026.4 |
| 783.0 | -7.85 | -5.47 | -1.68 | 3.18 | 9.12 | 15.55 | 24.6 | 38 | 56.23 | 74.64 | 103.61 | 135.49 | 173.47 | 216.3 | 281.86 | 353.35 | 460.9 | 566.96 | 702.72 | 848 | 1016.04 |
| 784.0 | -7.89 | -5.5 | -1.86 | 3.05 | 8.89 | 15.25 | 24.4 | 37.63 | 55.54 | 73.89 | 102.45 | 134.07 | 171.63 | 214.09 | 278.83 | 349.83 | 455.97 | 561.2 | 695.54 | 839.6 | 1005.7 |
| 785.0 | -8.12 | -5.64 | -2.11 | 2.81 | 8.63 | 14.77 | 24.1 | 36.76 | 54.95 | 72.84 | 101.09 | 132.44 | 169.49 | 211.74 | 275.81 | 346.14 | 450.36 | 555.25 | 688.16 | 830.61 | 994.83 |
| 786.0 | -8.39 | -5.85 | -2.25 | 2.55 | 8.27 | 14.53 | 23.46 | 36.12 | 53.97 | 71.85 | 99.76 | 130.9 | 167.45 | 209.26 | 272.55 | 342.27 | 445.54 | 549.32 | 680.51 | 821.25 | 983.77 |
| 787.0 | -8.39 | -5.69 | -2.09 | 2.75 | 8.22 | 14.39 | 23.4 | 35.86 | 53.56 | 70.98 | 98.73 | 129.47 | 165.63 | 207.01 | 270.1 | 339 | 441.15 | 543.67 | 673.18 | 812.54 | 972.98 |
| 788.0 | -8.23 | -5.76 | -2.11 | 2.84 | 8.04 | 14.15 | 23.16 | 35.42 | 52.91 | 70.06 | 97.61 | 127.9 | 163.9 | 204.94 | 267.33 | 335.29 | 436.55 | 538.05 | 666.33 | 804.25 | 962.33 |
| 789.0 | -8.24 | -5.79 | -2.19 | 2.62 | 7.75 | 13.81 | 22.83 | 34.87 | 52.49 | 69.1 | 96.45 | 126.39 | 162.07 | 202.87 | 264.58 | 331.97 | 431.99 | 532.44 | 658.96 | 795.61 | 952.53 |
| 790.0 | -8.32 | -5.7 | -2.28 | 2.47 | 7.51 | 13.51 | 22.53 | 34.36 | 51.91 | 68.12 | 95.39 | 125.07 | 160.25 | 200.82 | 261.71 | 328.7 | 427.61 | 526.81 | 651.92 | 787.07 | 942.77 |
| 791.0 | -8.26 | -5.64 | -2.2 | 2.37 | 7.52 | 13.39 | 22.37 | 33.96 | 51.51 | 67.41 | 94.42 | 123.74 | 158.71 | 198.94 | 259.45 | 325.62 | 424.06 | 522.14 | 645.97 | 779.46 | 933.74 |
| 792.0 | -8.26 | -5.65 | -2.26 | 2.52 | 7.43 | 13.13 | 21.97 | 33.6 | 50.83 | 66.64 | 93.24 | 122.5 | 157.6 | 196.79 | 256.88 | 322.38 | 419.98 | 517.65 | 639.62 | 771.95 | 924.88 |
| 793.0 | -8.35 | -5.74 | -2.47 | 2.41 | 7.2 | 12.97 | 21.75 | 33.13 | 50.34 | 65.72 | 92.36 | 121.27 | 156.23 | 194.94 | 254.25 | 319.56 | 415.98 | 513.11 | 634.19 | 764.88 | 916.46 |
| 794.0 | -8.3 | -5.81 | -2.51 | 2.49 | 7.13 | 12.75 | 21.7 | 32.73 | 49.93 | 65.21 | 91.68 | 120.41 | 154.92 | 193.56 | 252.48 | 316.56 | 412.68 | 508.89 | 628.82 | 758.89 | 908.89 |
| 795.0 | -8.14 | -5.72 | -2.51 | 2.44 | 6.97 | 12.77 | 21.41 | 32.41 | 49.44 | 64.69 | 91.13 | 119.47 | 153.69 | 191.93 | 250.63 | 314.16 | 409.3 | 504.93 | 623.93 | 753.14 | 901.96 |
| 796.0 | -8.24 | -5.62 | -2.45 | 2.31 | 6.67 | 12.56 | 21.13 | 32.16 | 49.02 | 64.27 | 90.46 | 118.53 | 152.69 | 190.43 | 249.05 | 311.77 | 406.25 | 501.42 | 619.36 | 747.57 | 895.49 |
| 797.0 | -8.27 | -5.56 | -2.47 | 2.07 | 6.51 | 12.52 | 20.97 | 31.92 | 48.59 | 63.96 | 89.92 | 117.62 | 151.77 | 188.81 | 247.44 | 309.94 | 403.89 | 498.22 | 615.74 | 742.43 | 889.65 |
| 798.0 | -8.4 | -5.76 | -2.63 | 1.9 | 6.54 | 12.29 | 20.85 | 31.81 | 48.11 | 63.51 | 89.5 | 116.8 | 150.77 | 187.88 | 245.9 | 307.99 | 401.53 | 495.3 | 611.85 | 737.37 | 884.14 |
| 799.0 | -8.34 | -5.69 | -2.64 | 1.74 | 6.47 | 12.2 | 20.69 | 31.81 | 47.89 | 63.14 | 89.12 | 116.32 | 149.78 | 186.59 | 244.69 | 306.57 | 399.57 | 492.67 | 608.59 | 733.05 | 879.22 |
| 800.0 | -8.22 | -5.75 | -2.42 | 1.62 | 6.38 | 11.98 | 20.76 | 31.67 | 47.76 | 63.03 | 88.6 | 115.89 | 149.14 | 185.87 | 243.76 | 305.11 | 397.41 | 490.53 | 605.31 | 729.59 | 874.93 |
| 801.0 | -8.5 | -6.02 | -2.54 | 1.42 | 6.16 | 11.72 | 20.58 | 31.25 | 47.22 | 62.55 | 88.12 | 115.1 | 148.21 | 184.99 | 242.66 | 303.66 | 395.55 | 488.1 | 602.54 | 726.11 | 871.09 |
| 802.0 | -8.55 | -6.08 | -2.66 | 1.31 | 6.07 | 11.66 | 20.51 | 31.19 | 46.98 | 62.31 | 87.86 | 114.53 | 147.39 | 183.76 | 241.71 | 302.34 | 393.53 | 486.09 | 600.06 | 722.86 | 867.21 |
| 803.0 | -8.54 | -6.01 | -2.74 | 1.1 | 6.14 | 11.61 | 20.42 | 31.1 | 46.68 | 62.1 | 87.63 | 113.77 | 146.88 | 183.14 | 241.04 | 301.3 | 392.24 | 484.6 | 597.87 | 720.42 | 864 |
| 804.0 | -8.63 | -6.08 | -2.96 | 1.08 | 6.11 | 11.61 | 20.29 | 31.03 | 46.56 | 61.75 | 87.47 | 113.47 | 146.44 | 182.58 | 240.32 | 300.21 | 391.06 | 482.83 | 595.62 | 718.11 | 861.12 |
| 805.0 | -8.76 | -6.25 | -3.1 | 0.95 | 5.99 | 11.43 | 20.16 | 30.89 | 46.32 | 61.33 | 87.02 | 113.2 | 146 | 181.93 | 239.63 | 299.38 | 390.09 | 481.27 | 594.02 | 716.19 | 858.24 |
| 806.0 | -8.64 | -6.36 | -3.02 | 1.03 | 5.94 | 11.41 | 20 | 30.9 | 46.23 | 61.03 | 86.83 | 113.08 | 145.92 | 181.75 | 239.15 | 298.72 | 389.62 | 480.37 | 592.49 | 714.68 | 856.3 |
| 807.0 | -8.49 | -6.23 | -2.94 | 1.1 | 6.05 | 11.5 | 20.14 | 30.85 | 46.29 | 60.95 | 86.65 | 112.89 | 145.86 | 181.78 | 239.03 | 298.6 | 389.01 | 480.12 | 591.54 | 714.02 | 855.19 |
| 808.0 | -8.55 | -6.5 | -2.99 | 0.86 | 5.94 | 11.45 | 20.04 | 30.61 | 46.01 | 60.73 | 86.45 | 112.62 | 145.4 | 181.66 | 238.28 | 297.88 | 388.24 | 479.27 | 590.77 | 713.23 | 854.29 |
| 809.0 | -8.59 | -6.44 | -2.88 | 0.78 | 6.02 | 11.51 | 19.96 | 30.62 | 46.01 | 60.82 | 86.55 | 112.72 | 145.41 | 181.38 | 238.15 | 297.87 | 388 | 478.96 | 589.69 | 712.91 | 853.65 |
| 810.0 | -8.54 | -6.49 | -2.81 | 0.83 | 6.09 | 11.63 | 20 | 30.64 | 45.85 | 60.97 | 86.61 | 112.91 | 145.34 | 181.12 | 238.03 | 297.39 | 387.47 | 478.45 | 589.28 | 712.38 | 852.63 |
| 811.0 | -8.42 | -6.57 | -2.85 | 0.86 | 6.12 | 11.72 | 19.96 | 30.66 | 45.74 | 60.84 | 86.63 | 112.93 | 145.25 | 181.05 | 237.94 | 297.18 | 387.12 | 478.47 | 589.14 | 711.84 | 851.81 |
| 812.0 | -8.4 | -6.63 | -2.7 | 0.86 | 6.16 | 11.67 | 19.9 | 30.57 | 45.44 | 60.71 | 86.53 | 112.83 | 145.19 | 180.88 | 237.45 | 296.81 | 386.4 | 477.75 | 588.02 | 711.23 | 850.98 |
| 813.0 | -8.45 | -6.74 | -2.8 | 0.57 | 6.08 | 11.49 | 19.86 | 30.38 | 45.37 | 60.45 | 86.57 | 112.57 | 144.51 | 180.7 | 236.92 | 296.45 | 385.79 | 476.47 | 587.5 | 709.8 | 848.72 |
| 814.0 | -8.41 | -6.78 | -2.86 | 0.37 | 5.92 | 11.22 | 19.67 | 30.13 | 45.07 | 60.42 | 86.12 | 112.16 | 144 | 180.31 | 236.26 | 295.79 | 384.99 | 475.32 | 585.84 | 708.24 | 847.49 |
| 815.0 | -8.42 | -6.85 | -3.02 | 0.2 | 5.82 | 11.19 | 19.44 | 30.14 | 44.81 | 60.23 | 85.83 | 111.63 | 143.63 | 179.43 | 235.62 | 295.33 | 384.07 | 474.1 | 584.46 | 706.66 | 845.66 |
| 816.0 | -8.55 | -7.03 | -3.16 | 0.11 | 5.68 | 10.88 | 19.26 | 30.11 | 44.46 | 59.97 | 85.22 | 111.19 | 143.13 | 178.86 | 234.84 | 294.16 | 382.87 | 472.67 | 582.57 | 704.36 | 842.94 |
| 817.0 | -8.52 | -7.19 | -3.22 | 0.12 | 5.75 | 10.8 | 19.19 | 30 | 44.37 | 59.6 | 84.77 | 110.69 | 142.59 | 178.18 | 233.93 | 292.98 | 381.72 | 471.2 | 580.8 | 702.49 | 840.51 |
| 818.0 | -8.53 | -7.24 | -3.36 | 0.13 | 5.7 | 10.64 | 19.19 | 29.98 | 43.98 | 59.25 | 84.25 | 110.33 | 142.15 | 177.9 | 233.15 | 291.93 | 380.25 | 469.27 | 578.11 | 700.3 | 837.9 |
| 819.0 | -8.49 | -7.21 | -3.25 | 0.22 | 5.62 | 10.61 | 19.15 | 29.78 | 43.91 | 59.08 | 83.98 | 109.85 | 141.61 | 177.09 | 232.65 | 290.84 | 378.7 | 467.51 | 575.82 | 697.48 | 834.76 |
| 820.0 | -8.57 | -7.36 | -3.23 | 0.42 | 5.51 | 10.38 | 19.05 | 29.58 | 43.71 | 58.92 | 83.61 | 109.36 | 140.81 | 176.33 | 231.47 | 289.35 | 376.57 | 465.12 | 573.16 | 694.06 | 831.09 |
| 821.0 | -8.6 | -7.32 | -3.41 | 0.34 | 5.39 | 10.3 | 18.79 | 29.22 | 43.34 | 58.53 | 82.96 | 108.63 | 140.08 | 175.27 | 230.1 | 287.76 | 375.08 | 462.57 | 570.51 | 690.65 | 827 |
| 822.0 | -8.52 | -7.16 | -3.3 | 0.4 | 5.49 | 10.31 | 18.74 | 29.2 | 43.1 | 58.36 | 82.65 | 108.22 | 139.62 | 174.17 | 228.91 | 286.52 | 373.16 | 460.25 | 567.66 | 687.37 | 822.43 |
| 823.0 | -8.51 | -7.16 | -3.37 | 0.47 | 5.41 | 10.22 | 18.37 | 28.94 | 42.83 | 58.08 | 82.18 | 107.65 | 138.8 | 173.24 | 227.71 | 285.06 | 371 | 457.92 | 564.61 | 683.77 | 818.06 |
| 824.0 | -8.54 | -7.24 | -3.43 | 0.51 | 5.24 | 10.04 | 18.28 | 28.6 | 42.64 | 57.72 | 81.67 | 107.18 | 137.74 | 172.18 | 226.23 | 283.17 | 368.74 | 455.16 | 561 | 679.46 | 813.03 |
| 825.0 | -8.59 | -7.13 | -3.46 | 0.52 | 5.18 | 10.07 | 18.18 | 28.38 | 42.24 | 57.51 | 81.07 | 106.64 | 136.71 | 171.25 | 224.69 | 281.62 | 366.56 | 452.38 | 557.64 | 675.31 | 808.41 |
| 826.0 | -8.66 | -7.18 | -3.32 | 0.44 | 5.12 | 10.05 | 17.97 | 28.19 | 42.05 | 57.11 | 80.78 | 105.98 | 135.92 | 170.15 | 223 | 279.6 | 363.98 | 449.49 | 554.17 | 670.61 | 803.53 |
| 827.0 | -8.68 | -7.16 | -3.38 | 0.35 | 5.04 | 9.93 | 17.8 | 27.99 | 41.69 | 56.76 | 80.16 | 105.26 | 134.75 | 168.77 | 221.4 | 277.77 | 361.27 | 446.61 | 550.38 | 665.99 | 797.86 |
| 828.0 | -8.77 | -7.25 | -3.4 | 0.28 | 4.8 | 9.57 | 17.51 | 27.77 | 41.27 | 56.44 | 79.56 | 104.57 | 133.81 | 167.45 | 219.71 | 275.73 | 358.46 | 443.35 | 546.42 | 661.08 | 791.9 |
| 829.0 | -8.84 | -7.28 | -3.55 | 0.26 | 4.61 | 9.36 | 17.26 | 27.41 | 40.94 | 56.11 | 78.96 | 103.78 | 132.92 | 166.01 | 217.97 | 273.67 | 355.79 | 440.29 | 542.21 | 655.64 | 785.89 |
| 830.0 | -8.88 | -7.3 | -3.66 | 0.15 | 4.37 | 9.21 | 17.16 | 27.14 | 40.5 | 55.66 | 78.13 | 102.86 | 131.8 | 164.71 | 216.14 | 271.57 | 353.06 | 436.83 | 538.31 | 650.18 | 780.22 |
| 831.0 | -9 | -7.4 | -3.78 | 0.04 | 4.2 | 8.95 | 16.95 | 26.9 | 40.05 | 54.96 | 77.35 | 101.85 | 130.66 | 163.23 | 214.26 | 269.39 | 349.86 | 433.28 | 534.28 | 644.46 | 774.18 |
| 832.0 | -9.09 | -7.34 | -3.87 | -0.05 | 4.23 | 8.64 | 16.91 | 26.67 | 39.74 | 54.68 | 76.44 | 100.96 | 129.59 | 161.84 | 211.99 | 267.03 | 346.99 | 429.67 | 529.58 | 638.95 | 767.9 |
| 833.0 | -9.1 | -7.3 | -4.04 | -0.15 | 4.06 | 8.57 | 16.72 | 26.34 | 39.49 | 54.22 | 75.68 | 99.88 | 128.31 | 160.41 | 210.17 | 264.62 | 343.87 | 425.91 | 524.92 | 633.13 | 760.9 |
| 834.0 | -9.22 | -7.33 | -4.07 | -0.18 | 4 | 8.4 | 16.49 | 26.18 | 39.08 | 53.66 | 74.78 | 98.91 | 127.34 | 158.83 | 208.27 | 262.08 | 341.1 | 422.41 | 520.15 | 627.85 | 754.92 |
| 835.0 | -9.12 | -7.25 | -4 | -0.12 | 4.03 | 8.41 | 16.4 | 26.1 | 38.9 | 53.12 | 74.24 | 98.17 | 126.46 | 157.7 | 206.59 | 259.63 | 337.84 | 418.93 | 515.85 | 622.62 | 748.18 |
| 836.0 | -9.11 | -7.41 | -3.95 | -0.16 | 3.97 | 8.16 | 16.2 | 25.64 | 38.59 | 52.39 | 73.4 | 97.16 | 125.47 | 156.38 | 204.77 | 257.11 | 334.88 | 415.33 | 511.23 | 617.3 | 741.47 |
| 837.0 | -9.16 | -7.5 | -3.9 | -0.3 | 3.85 | 8.13 | 16.17 | 25.27 | 38.31 | 51.65 | 72.73 | 96.24 | 124.37 | 154.94 | 202.72 | 254.95 | 332.09 | 411.51 | 506.74 | 611.61 | 734.9 |
| 838.0 | -9.18 | -7.31 | -3.78 | -0.41 | 3.76 | 7.98 | 16.16 | 25 | 37.88 | 51.18 | 72.04 | 95.43 | 123.27 | 153.47 | 200.81 | 252.86 | 328.9 | 407.7 | 501.97 | 606.11 | 728.07 |
| 839.0 | -9.22 | -7.37 | -3.86 | -0.56 | 3.46 | 7.81 | 15.8 | 24.45 | 37.58 | 50.73 | 71.35 | 94.55 | 122.01 | 151.72 | 198.72 | 250.13 | 325.96 | 404.13 | 497.39 | 600.16 | 720.82 |
| 840.0 | -9.21 | -7.31 | -3.9 | -0.75 | 3.4 | 7.64 | 15.61 | 24.19 | 37.1 | 50.1 | 70.51 | 93.65 | 120.75 | 150.21 | 196.46 | 247.55 | 322.68 | 400.13 | 492.52 | 593.91 | 713.66 |
| 841.0 | -9.17 | -7.27 | -3.89 | -0.97 | 3.2 | 7.57 | 15.3 | 23.85 | 36.61 | 49.3 | 69.66 | 92.52 | 119.62 | 148.86 | 194.54 | 244.94 | 319.8 | 396.37 | 487.38 | 588.01 | 706.44 |
| 842.0 | -9.17 | -7.3 | -3.93 | -1.04 | 3.11 | 7.48 | 15.05 | 23.55 | 36.14 | 48.66 | 68.99 | 91.46 | 118.35 | 147.33 | 192.47 | 242.21 | 316.29 | 392.22 | 482.57 | 582.03 | 699.34 |
| 843.0 | -9 | -7.3 | -3.95 | -1.1 | 3.02 | 7.46 | 14.83 | 23.28 | 35.85 | 48.23 | 68.16 | 90.36 | 117.18 | 145.99 | 190.47 | 239.72 | 313.3 | 388.3 | 477.31 | 575.75 | 692.34 |
| 844.0 | -9 | -7.39 | -3.96 | -1.29 | 2.9 | 7.2 | 14.79 | 22.93 | 35.35 | 47.59 | 67.3 | 89.31 | 115.9 | 144.48 | 188.44 | 237.18 | 310.04 | 383.99 | 472 | 569.53 | 685.24 |
| 845.0 | -9 | -7.35 | -3.96 | -1.29 | 2.8 | 7.03 | 14.45 | 22.65 | 34.88 | 46.94 | 66.45 | 88.2 | 114.67 | 142.74 | 186.56 | 234.61 | 306.85 | 379.55 | 467.24 | 563.46 | 677.86 |
| 846.0 | -8.99 | -7.41 | -4.04 | -1.51 | 2.51 | 6.67 | 14.1 | 22.21 | 34.39 | 46.12 | 65.44 | 86.95 | 113.26 | 140.98 | 184.37 | 231.69 | 303.45 | 375.6 | 462.01 | 556.87 | 670.45 |
| 847.0 | -9.02 | -7.49 | -4.29 | -1.66 | 2.35 | 6.24 | 13.63 | 21.82 | 33.78 | 45.44 | 64.3 | 85.69 | 111.69 | 139.33 | 182.36 | 229.09 | 299.99 | 371.33 | 456.48 | 550.53 | 663.05 |
| 848.0 | -8.98 | -7.39 | -4.35 | -1.75 | 2.16 | 6.14 | 13.36 | 21.42 | 33.28 | 44.74 | 63.52 | 84.61 | 110.25 | 137.6 | 180.13 | 226.43 | 296.38 | 366.71 | 451.34 | 544.23 | 655.48 |
| 849.0 | -9.02 | -7.49 | -4.46 | -1.9 | 2.06 | 6.1 | 13.24 | 21.1 | 32.74 | 44.06 | 62.6 | 83.38 | 108.67 | 135.94 | 177.88 | 223.72 | 293.22 | 362.23 | 446.32 | 537.75 | 647.83 |
| 850.0 | -8.9 | -7.34 | -4.43 | -2.02 | 1.98 | 5.99 | 13.02 | 20.89 | 32.36 | 43.34 | 61.84 | 82.31 | 107.51 | 134.28 | 175.74 | 221.2 | 289.73 | 357.63 | 440.95 | 531.32 | 640.07 |
| 851.0 | -8.88 | -7.4 | -4.47 | -2.11 | 1.86 | 5.74 | 12.58 | 20.55 | 31.8 | 42.56 | 60.99 | 81.2 | 106.19 | 132.47 | 173.76 | 218.02 | 286.04 | 353.25 | 435.2 | 524.51 | 632.07 |
| 852.0 | -8.89 | -7.36 | -4.61 | -2.17 | 1.75 | 5.46 | 12.27 | 20.14 | 31.46 | 41.97 | 60.16 | 80.02 | 104.73 | 130.69 | 171.2 | 215.22 | 282.69 | 348.89 | 429.45 | 518.01 | 624.04 |
| 853.0 | -9.04 | -7.52 | -4.72 | -2.28 | 1.64 | 5.32 | 11.86 | 19.62 | 30.92 | 41.18 | 59.46 | 78.57 | 103.25 | 128.84 | 169.27 | 212.12 | 279.03 | 344.11 | 424.01 | 511.21 | 616.16 |
| 854.0 | -9.04 | -7.66 | -4.83 | -2.4 | 1.51 | 5.05 | 11.45 | 19.37 | 30.33 | 40.52 | 58.53 | 77.53 | 101.84 | 126.96 | 166.91 | 209.33 | 275.55 | 339.55 | 418.42 | 504.59 | 608.32 |
| 855.0 | -8.93 | -7.62 | -4.86 | -2.46 | 1.35 | 4.99 | 11.26 | 18.94 | 29.79 | 40.05 | 57.71 | 76.54 | 100.39 | 125.25 | 164.81 | 206.8 | 271.83 | 335.34 | 412.99 | 497.87 | 600.15 |
| 856.0 | -8.98 | -7.7 | -4.92 | -2.56 | 1.2 | 4.74 | 11.07 | 18.63 | 29.13 | 39.33 | 56.9 | 75.59 | 98.87 | 123.32 | 162.29 | 204.04 | 268.33 | 330.84 | 407.43 | 491.14 | 592.4 |
| 857.0 | -8.88 | -7.48 | -4.93 | -2.56 | 1.09 | 4.71 | 10.91 | 18.6 | 28.65 | 38.83 | 56.13 | 74.43 | 97.28 | 121.48 | 159.84 | 201.16 | 264.92 | 326.44 | 402.17 | 484.39 | 584.17 |
| 858.0 | -9.04 | -7.57 | -5.18 | -2.76 | 0.85 | 4.32 | 10.42 | 18.11 | 27.9 | 38.12 | 55.19 | 73.18 | 95.71 | 119.61 | 157.47 | 198.17 | 260.71 | 321.47 | 395.88 | 477.19 | 575.6 |
| 859.0 | -9.09 | -7.79 | -5.48 | -2.9 | 0.63 | 4.15 | 10.03 | 17.62 | 27.34 | 37.42 | 54.19 | 71.79 | 93.92 | 117.78 | 154.89 | 194.87 | 256.68 | 316.66 | 389.6 | 469.95 | 566.74 |
| 860.0 | -9.16 | -7.87 | -5.5 | -2.96 | 0.51 | 3.93 | 9.75 | 17.19 | 26.81 | 36.63 | 53.18 | 70.33 | 92.22 | 115.95 | 152.48 | 191.64 | 252.66 | 311.63 | 383.61 | 462.72 | 558.02 |
| 861.0 | -9.27 | -8.07 | -5.73 | -3.1 | 0.24 | 3.8 | 9.38 | 16.81 | 26.13 | 35.93 | 52.13 | 68.94 | 90.57 | 113.94 | 149.92 | 188.59 | 248.49 | 306.47 | 377.55 | 455.73 | 549.19 |
| 862.0 | -9.47 | -8.21 | -6.06 | -3.42 | -0.08 | 3.54 | 9.09 | 16.22 | 25.4 | 35.18 | 51.07 | 67.66 | 88.89 | 111.78 | 147.34 | 185.41 | 244.04 | 301.52 | 371.52 | 448.35 | 540.6 |
| 863.0 | -9.62 | -8.34 | -6.19 | -3.56 | -0.3 | 3.35 | 8.77 | 15.92 | 24.68 | 34.45 | 50 | 66.42 | 87.32 | 109.61 | 144.79 | 182.27 | 239.96 | 296.44 | 365.07 | 440.66 | 531.36 |
| 864.0 | -9.71 | -8.43 | -6.4 | -3.68 | -0.58 | 3.1 | 8.51 | 15.47 | 24.1 | 33.56 | 48.98 | 65.13 | 85.66 | 107.5 | 142.18 | 178.9 | 235.62 | 291.32 | 359.12 | 433.13 | 522.43 |
| 865.0 | -9.77 | -8.5 | -6.51 | -3.84 | -0.69 | 2.91 | 8.22 | 14.95 | 23.48 | 32.77 | 48.04 | 63.88 | 84.04 | 105.43 | 139.45 | 175.4 | 231.55 | 286.39 | 352.91 | 425.28 | 513.39 |
| 866.0 | -9.83 | -8.52 | -6.5 | -4.03 | -0.89 | 2.69 | 8.08 | 14.65 | 22.89 | 32.17 | 47.1 | 62.82 | 82.63 | 103.67 | 136.71 | 172.38 | 227.34 | 281.52 | 346.54 | 417.73 | 504.42 |
| 867.0 | -9.89 | -8.57 | -6.55 | -4.14 | -1.05 | 2.49 | 7.85 | 14.31 | 22.27 | 31.59 | 46.16 | 61.57 | 81.05 | 101.77 | 133.99 | 169.3 | 222.95 | 276.18 | 340.26 | 410.31 | 495.15 |
| 868.0 | -9.82 | -8.6 | -6.53 | -4.32 | -1.32 | 2.32 | 7.74 | 13.83 | 21.67 | 30.89 | 45.34 | 60.38 | 79.54 | 99.72 | 131.44 | 166.08 | 218.77 | 271.1 | 334.23 | 403.07 | 486.17 |
| 869.0 | -10.04 | -8.71 | -6.61 | -4.43 | -1.29 | 2.03 | 7.34 | 13.47 | 21.2 | 30.28 | 44.45 | 59.22 | 78.22 | 97.99 | 129.02 | 163.17 | 215.03 | 266.34 | 328.56 | 395.75 | 477.78 |
| 870.0 | -10 | -8.62 | -6.71 | -4.52 | -1.38 | 1.87 | 6.98 | 13.11 | 20.65 | 29.67 | 43.79 | 58.28 | 76.81 | 96.24 | 126.69 | 160.04 | 211.21 | 261.63 | 322.87 | 388.88 | 469.81 |
| 871.0 | -10.24 | -8.8 | -6.9 | -4.66 | -1.66 | 1.63 | 6.61 | 12.6 | 20.02 | 29.02 | 42.78 | 56.92 | 75.14 | 94.45 | 124.55 | 156.95 | 207.54 | 257.16 | 317.35 | 382.38 | 462.2 |
| 872.0 | -10.36 | -8.9 | -7.13 | -4.84 | -2.05 | 1.42 | 6.3 | 12.06 | 19.41 | 28.33 | 41.82 | 55.66 | 73.6 | 92.92 | 121.97 | 154.42 | 203.82 | 252.58 | 312.07 | 376.08 | 454.45 |
| 873.0 | -10.58 | -8.94 | -7.29 | -5.17 | -2.43 | 1.21 | 5.9 | 11.57 | 18.68 | 27.6 | 40.78 | 54.46 | 72.2 | 91.25 | 120.17 | 151.71 | 200.32 | 248.29 | 306.98 | 370.12 | 446.85 |
| 874.0 | -10.54 | -8.96 | -7.23 | -5.19 | -2.62 | 0.98 | 5.65 | 11.22 | 18.28 | 27.04 | 39.93 | 53.7 | 71 | 89.7 | 118.32 | 149.55 | 197.25 | 244.69 | 302.47 | 364.96 | 440.2 |
| 875.0 | -10.68 | -8.99 | -7.33 | -5.29 | -2.88 | 0.88 | 5.53 | 10.97 | 17.82 | 26.57 | 39.23 | 52.83 | 69.94 | 88.33 | 116.57 | 147.47 | 194.29 | 241.07 | 298.37 | 360.23 | 434 |
| 876.0 | -10.79 | -9.06 | -7.54 | -5.48 | -3.16 | 0.76 | 5.24 | 10.6 | 17.35 | 26.18 | 38.54 | 51.99 | 68.9 | 86.91 | 114.78 | 145.16 | 191.3 | 237.51 | 294.23 | 355.78 | 428.05 |
| 877.0 | -10.88 | -9.13 | -7.69 | -5.55 | -3.31 | 0.66 | 5.01 | 10.18 | 16.9 | 25.77 | 37.83 | 51.17 | 67.83 | 85.58 | 113.41 | 143.16 | 188.98 | 234.61 | 290.63 | 351.31 | 422.67 |
| 878.0 | -11.15 | -9.32 | -7.8 | -5.73 | -3.47 | 0.48 | 4.77 | 9.67 | 16.43 | 25.32 | 37.32 | 50.61 | 66.88 | 84.49 | 111.9 | 141.35 | 186.35 | 231.66 | 286.91 | 347.15 | 418.39 |
| 879.0 | -10.92 | -9.22 | -7.67 | -5.6 | -3.4 | 0.54 | 4.74 | 9.74 | 16.37 | 25.06 | 36.92 | 50.09 | 66.29 | 83.67 | 110.94 | 140.08 | 184.62 | 229.61 | 284.5 | 344.11 | 414.58 |
| 880.0 | -11 | -9.34 | -7.63 | -5.68 | -3.55 | 0.42 | 4.6 | 9.52 | 16.06 | 24.72 | 36.4 | 49.62 | 65.74 | 82.81 | 109.88 | 138.78 | 182.96 | 227.6 | 282.27 | 341.01 | 411.34 |
| 881.0 | -11.02 | -9.26 | -7.69 | -5.64 | -3.46 | 0.32 | 4.47 | 9.45 | 15.93 | 24.41 | 36 | 49.27 | 64.97 | 82.11 | 108.79 | 137.78 | 181.26 | 225.69 | 280.19 | 338.32 | 408.28 |
| 882.0 | -11.08 | -9.25 | -7.72 | -5.74 | -3.57 | 0.16 | 4.27 | 9.26 | 15.67 | 24.14 | 35.67 | 48.82 | 64.44 | 81.35 | 107.73 | 136.73 | 179.78 | 224.01 | 278.07 | 335.9 | 405.27 |
| 883.0 | -11.01 | -9.25 | -7.73 | -5.75 | -3.61 | 0.01 | 4.13 | 9.15 | 15.48 | 23.84 | 35.25 | 48.69 | 63.9 | 80.78 | 106.9 | 135.72 | 178.8 | 222.49 | 276.43 | 334.05 | 403.21 |
| 884.0 | -10.96 | -9.33 | -7.85 | -5.9 | -3.66 | -0.28 | 4.05 | 8.99 | 15.38 | 23.63 | 35.07 | 48.42 | 63.41 | 80.37 | 106.35 | 135.01 | 177.85 | 221.47 | 275.36 | 332.82 | 401.72 |
| 885.0 | -11.1 | -9.39 | -7.93 | -6.03 | -3.65 | -0.36 | 3.91 | 8.87 | 15.27 | 23.48 | 34.78 | 48.25 | 63.03 | 79.97 | 105.94 | 134.38 | 177.01 | 220.65 | 274.13 | 331.44 | 400.37 |
| 886.0 | -11.29 | -9.5 | -8.1 | -6.17 | -3.77 | -0.52 | 3.63 | 8.75 | 15.14 | 23.24 | 34.55 | 48.03 | 62.58 | 79.65 | 105.51 | 134.1 | 176.31 | 219.96 | 273.28 | 331.06 | 399.53 |
| 887.0 | -11.41 | -9.6 | -8.22 | -6.14 | -3.79 | -0.48 | 3.51 | 8.5 | 15.09 | 23.02 | 34.27 | 47.74 | 62.24 | 79.26 | 105.27 | 133.71 | 175.82 | 219.49 | 272.63 | 330.42 | 398.87 |
| 888.0 | -11.39 | -9.66 | -8.18 | -6.22 | -3.84 | -0.54 | 3.37 | 8.42 | 14.98 | 22.77 | 34.14 | 47.89 | 62.18 | 79.02 | 105.33 | 133.61 | 175.69 | 219.22 | 272.44 | 330.01 | 398.23 |
| 889.0 | -11.5 | -9.61 | -8.22 | -6.17 | -3.79 | -0.54 | 3.38 | 8.31 | 15.05 | 22.66 | 34.07 | 47.67 | 62.15 | 78.91 | 105.3 | 133.37 | 175.86 | 219.13 | 272.18 | 329.61 | 398.04 |
| 890.0 | -11.56 | -9.69 | -8.32 | -6.34 | -4 | -0.6 | 3.45 | 8.28 | 14.77 | 22.55 | 33.91 | 47.38 | 61.88 | 78.43 | 105.15 | 132.75 | 175.56 | 218.91 | 271.31 | 329.55 | 397.88 |
| 891.0 | -11.82 | -9.92 | -8.46 | -6.48 | -4.21 | -0.79 | 3.28 | 8.08 | 14.57 | 22.18 | 33.55 | 47.09 | 61.58 | 78.1 | 104.84 | 132.59 | 175.07 | 218.48 | 270.95 | 329.09 | 397.38 |
| 892.0 | -11.68 | -9.84 | -8.44 | -6.46 | -4.1 | -0.78 | 3.34 | 8.13 | 14.65 | 22.17 | 33.57 | 47.33 | 61.69 | 77.94 | 104.65 | 132.34 | 174.77 | 218.33 | 270.67 | 328.77 | 396.76 |
| 893.0 | -11.68 | -9.76 | -8.36 | -6.48 | -3.98 | -0.75 | 3.43 | 8.31 | 14.8 | 22.19 | 33.78 | 47.37 | 61.58 | 77.87 | 104.64 | 132.15 | 174.63 | 218.44 | 270.6 | 328.62 | 396.27 |
| 894.0 | -11.57 | -9.82 | -8.37 | -6.37 | -3.91 | -0.73 | 3.38 | 8.47 | 14.78 | 22.03 | 33.86 | 47.43 | 61.55 | 77.76 | 104.23 | 131.79 | 174.14 | 218.1 | 270.05 | 327.89 | 396.01 |
| 895.0 | -11.5 | -9.77 | -8.45 | -6.37 | -4 | -0.71 | 3.39 | 8.6 | 14.75 | 22.26 | 33.89 | 47.29 | 61.48 | 77.62 | 103.92 | 131.39 | 173.51 | 217.49 | 269.26 | 326.87 | 394.97 |
| 896.0 | -11.46 | -9.84 | -8.47 | -6.31 | -3.94 | -0.69 | 3.4 | 8.53 | 14.78 | 22.03 | 33.87 | 47.09 | 61.19 | 77.44 | 103.83 | 130.85 | 173.19 | 217.05 | 268.38 | 325.68 | 393.81 |
| 897.0 | -11.56 | -10.01 | -8.43 | -6.34 | -3.86 | -0.89 | 3.28 | 8.35 | 14.7 | 21.66 | 33.73 | 46.68 | 60.73 | 77.1 | 103.24 | 130.28 | 172.56 | 216.32 | 267.35 | 324.13 | 392.23 |
| 898.0 | -11.56 | -10.02 | -8.41 | -6.34 | -3.82 | -0.99 | 3.3 | 8.4 | 14.88 | 21.56 | 33.66 | 46.31 | 60.61 | 76.84 | 102.78 | 129.84 | 171.83 | 215.29 | 266.12 | 322.77 | 390.3 |
| 899.0 | -11.52 | -9.98 | -8.45 | -6.4 | -3.94 | -1.17 | 3.19 | 8.39 | 14.8 | 21.41 | 33.46 | 46.03 | 60.32 | 76.45 | 102.22 | 129.25 | 170.88 | 214.14 | 264.77 | 320.74 | 387.83 |
| 900.0 | -11.48 | -9.98 | -8.43 | -6.35 | -4.06 | -1.23 | 3.05 | 8.19 | 14.58 | 21.32 | 33.16 | 45.85 | 59.84 | 76.01 | 101.37 | 128.3 | 169.73 | 212.38 | 262.97 | 318.66 | 385.42 |
| 901.0 | -11.44 | -9.99 | -8.5 | -6.51 | -4.11 | -1.43 | 2.89 | 8.05 | 14.48 | 20.99 | 32.93 | 45.47 | 59.38 | 75.3 | 100.79 | 127.58 | 168.7 | 210.76 | 261 | 316.45 | 382.64 |
| 902.0 | -11.37 | -10.04 | -8.54 | -6.61 | -4.17 | -1.46 | 2.84 | 7.95 | 14.21 | 20.91 | 32.8 | 45.11 | 59.16 | 74.64 | 100.17 | 126.49 | 167.52 | 209.29 | 259.04 | 314.08 | 379.96 |
| 903.0 | -11.25 | -9.97 | -8.55 | -6.49 | -4.14 | -1.46 | 2.82 | 7.87 | 14.13 | 20.77 | 32.59 | 44.74 | 58.81 | 74.12 | 99.56 | 125.39 | 166.39 | 207.83 | 257.18 | 311.8 | 377.35 |
| 904.0 | -11.27 | -9.95 | -8.44 | -6.43 | -4.17 | -1.5 | 2.82 | 7.77 | 14.21 | 20.63 | 32.4 | 44.25 | 58.57 | 73.57 | 98.97 | 124.46 | 165.08 | 206.14 | 255.29 | 309.31 | 374.07 |
| 905.0 | -11.28 | -9.86 | -8.42 | -6.36 | -4.23 | -1.49 | 2.72 | 7.64 | 13.83 | 20.41 | 31.96 | 43.76 | 57.97 | 72.85 | 97.86 | 123.28 | 163.66 | 204.3 | 252.42 | 306.03 | 370.41 |
| 906.0 | -11.11 | -9.83 | -8.36 | -6.3 | -4.26 | -1.67 | 2.51 | 7.41 | 13.5 | 20.12 | 31.65 | 43.17 | 57.32 | 72.25 | 96.77 | 122.15 | 162.09 | 202.34 | 249.89 | 303.13 | 366.42 |
| 907.0 | -10.97 | -9.76 | -8.34 | -6.23 | -4.24 | -1.73 | 2.58 | 7.34 | 13.38 | 19.91 | 31.25 | 42.66 | 56.84 | 71.62 | 95.74 | 120.78 | 160.32 | 199.99 | 247.38 | 299.53 | 362.29 |
| 908.0 | -10.99 | -9.77 | -8.49 | -6.44 | -4.32 | -2.04 | 2.35 | 7.06 | 12.97 | 19.5 | 30.9 | 42.22 | 56.04 | 70.67 | 94.52 | 119.23 | 158.28 | 197.71 | 244.67 | 296.06 | 358.02 |
| 909.0 | -11.01 | -9.74 | -8.59 | -6.46 | -4.3 | -2.19 | 2.34 | 6.93 | 12.85 | 19.23 | 30.46 | 41.5 | 55.35 | 69.61 | 93.2 | 117.64 | 156.25 | 195.26 | 241.5 | 292.33 | 353.94 |
| 910.0 | -11.04 | -9.87 | -8.77 | -6.54 | -4.57 | -2.43 | 2.09 | 6.7 | 12.5 | 18.85 | 29.86 | 40.81 | 54.51 | 68.58 | 91.85 | 115.96 | 153.99 | 192.67 | 238.3 | 288.66 | 349.2 |
| 911.0 | -11.02 | -9.92 | -8.78 | -6.43 | -4.58 | -2.59 | 1.99 | 6.35 | 12.34 | 18.61 | 29.35 | 40.19 | 53.77 | 67.76 | 90.52 | 114.45 | 151.91 | 190.03 | 235.31 | 284.63 | 344.41 |
| 912.0 | -10.88 | -9.82 | -8.72 | -6.31 | -4.55 | -2.66 | 1.9 | 6.29 | 12.27 | 18.53 | 28.93 | 39.64 | 53.14 | 66.77 | 89.25 | 112.75 | 149.99 | 187.37 | 231.75 | 280.67 | 339.48 |
| 913.0 | -10.99 | -9.95 | -8.85 | -6.43 | -4.8 | -2.74 | 1.56 | 6.03 | 11.84 | 18.02 | 28.45 | 38.86 | 52.22 | 65.78 | 87.74 | 111.01 | 147.61 | 184.18 | 228.21 | 276.39 | 334.36 |
| 914.0 | -11.04 | -10.08 | -8.97 | -6.47 | -4.93 | -2.89 | 1.37 | 5.45 | 11.38 | 17.66 | 27.59 | 38.02 | 51.21 | 64.46 | 86.04 | 108.92 | 145.34 | 180.79 | 224.16 | 271.69 | 329.04 |
| 915.0 | -11.02 | -10.13 | -8.97 | -6.54 | -4.95 | -2.97 | 1.21 | 5.23 | 11.18 | 17.47 | 27.05 | 37.37 | 50.38 | 63.38 | 84.82 | 107.27 | 143.09 | 177.93 | 220.59 | 267.38 | 323.69 |
| 916.0 | -11.26 | -10.36 | -9.09 | -6.82 | -5.27 | -3.22 | 0.82 | 4.84 | 10.62 | 16.74 | 26.23 | 36.53 | 49.27 | 62.09 | 83.28 | 105.08 | 140.29 | 174.48 | 216.72 | 262.69 | 317.85 |
| 917.0 | -11.14 | -10.24 | -8.96 | -6.69 | -5.34 | -3.33 | 0.7 | 4.72 | 10.3 | 16.35 | 25.74 | 35.82 | 48.35 | 60.94 | 81.47 | 103.01 | 137.41 | 171.03 | 212.71 | 257.99 | 312.07 |
| 918.0 | -11.03 | -10.17 | -9.02 | -6.71 | -5.45 | -3.37 | 0.58 | 4.57 | 9.88 | 15.94 | 25.07 | 35.04 | 47.38 | 59.64 | 79.79 | 100.95 | 134.58 | 167.84 | 208.56 | 253.13 | 306.37 |
| 919.0 | -11.14 | -10.19 | -9.01 | -6.87 | -5.64 | -3.52 | 0.17 | 4.2 | 9.29 | 15.41 | 24.2 | 34.21 | 46.16 | 58.31 | 77.9 | 98.67 | 131.51 | 164.09 | 204.25 | 247.84 | 300.17 |
| 920.0 | -11.14 | -10.31 | -9.05 | -6.98 | -5.69 | -3.68 | 0.01 | 3.81 | 8.81 | 14.85 | 23.49 | 33.39 | 44.99 | 57.04 | 76.24 | 96.43 | 128.72 | 160.42 | 199.67 | 242.66 | 293.72 |
| 921.0 | -11.38 | -10.44 | -9.22 | -7.27 | -5.87 | -3.87 | -0.17 | 3.46 | 8.23 | 14.33 | 22.79 | 32.37 | 43.72 | 55.48 | 74.48 | 94.06 | 125.78 | 157.08 | 195.13 | 237.19 | 287.19 |
| 922.0 | -11.49 | -10.42 | -9.34 | -7.28 | -5.97 | -3.95 | -0.45 | 3.27 | 7.88 | 13.86 | 21.98 | 31.38 | 42.69 | 54.21 | 72.59 | 91.76 | 122.75 | 153.36 | 190.68 | 231.74 | 280.86 |
| 923.0 | -11.51 | -10.41 | -9.43 | -7.43 | -6.3 | -4.08 | -0.75 | 2.93 | 7.41 | 13.17 | 21.09 | 30.39 | 41.42 | 52.69 | 70.48 | 89.45 | 119.64 | 149.38 | 185.68 | 226.13 | 273.92 |
| 924.0 | -11.57 | -10.47 | -9.48 | -7.6 | -6.43 | -4.29 | -1.01 | 2.56 | 6.88 | 12.59 | 20.27 | 29.49 | 40.2 | 51.09 | 68.6 | 87.07 | 116.26 | 145.13 | 180.53 | 220.05 | 266.59 |
| 925.0 | -11.55 | -10.51 | -9.47 | -7.72 | -6.49 | -4.43 | -1.25 | 2.21 | 6.27 | 11.94 | 19.57 | 28.43 | 38.67 | 49.46 | 66.18 | 84.32 | 112.85 | 140.84 | 174.96 | 213.43 | 258.91 |
| 926.0 | -11.76 | -10.63 | -9.6 | -7.97 | -6.69 | -4.78 | -1.62 | 1.77 | 5.82 | 11.3 | 18.8 | 27.27 | 37.35 | 47.6 | 64.08 | 81.17 | 108.96 | 136.08 | 169.49 | 206.67 | 250.61 |
| 927.0 | -11.9 | -10.78 | -9.76 | -8.18 | -6.97 | -5.03 | -1.9 | 1.34 | 5.27 | 10.62 | 17.69 | 26.05 | 35.79 | 45.57 | 61.48 | 78 | 104.94 | 130.87 | 163.25 | 199.15 | 241.63 |
| 928.0 | -11.96 | -10.85 | -9.76 | -8.43 | -7.27 | -5.24 | -2.52 | 0.69 | 4.52 | 9.77 | 16.59 | 24.56 | 34.05 | 43.29 | 58.74 | 74.61 | 100.56 | 125.59 | 156.27 | 190.98 | 231.91 |
| 929.0 | -12.05 | -11.05 | -9.77 | -8.55 | -7.56 | -5.47 | -2.91 | 0.32 | 4.06 | 9.04 | 15.39 | 23.06 | 32.3 | 41.02 | 55.73 | 70.94 | 96.04 | 119.65 | 148.99 | 182.27 | 221.58 |
| 930.0 | -12.2 | -11.13 | -10 | -8.81 | -7.9 | -5.72 | -3.42 | -0.41 | 3.27 | 8.1 | 14.13 | 21.45 | 30.24 | 38.9 | 52.6 | 66.96 | 91.15 | 113.58 | 141.58 | 173.39 | 210.58 |
| 931.0 | -12.15 | -11.15 | -10.07 | -8.97 | -7.99 | -5.93 | -3.83 | -0.93 | 2.54 | 7.26 | 13.03 | 20.07 | 28.28 | 36.59 | 49.59 | 63.29 | 86.03 | 107.46 | 134.11 | 164.19 | 199.6 |
| 932.0 | -12.05 | -11.18 | -10.21 | -9.21 | -8.34 | -6.26 | -4.35 | -1.49 | 1.78 | 6.33 | 11.8 | 18.53 | 26.24 | 34.11 | 46.47 | 59.45 | 80.9 | 101.09 | 126.32 | 154.79 | 188.2 |
| 933.0 | -11.99 | -11.23 | -10.33 | -9.48 | -8.47 | -6.41 | -4.65 | -2.04 | 1.01 | 5.3 | 10.59 | 16.96 | 24.27 | 31.73 | 43.45 | 55.58 | 75.73 | 94.82 | 118.78 | 145.53 | 177.18 |
| 934.0 | -11.93 | -11.2 | -10.39 | -9.67 | -8.65 | -6.84 | -4.94 | -2.57 | 0.38 | 4.52 | 9.24 | 15.43 | 22.26 | 29.25 | 40.44 | 51.79 | 70.8 | 88.86 | 111.23 | 136.35 | 166.14 |
| 935.0 | -11.99 | -11.24 | -10.47 | -9.99 | -8.83 | -7.21 | -5.43 | -2.95 | -0.23 | 3.61 | 8.2 | 14.03 | 20.29 | 26.85 | 37.58 | 48.09 | 65.68 | 82.96 | 103.97 | 127.46 | 155.45 |
| 936.0 | -12.02 | -11.25 | -10.58 | -10.04 | -8.96 | -7.43 | -5.69 | -3.58 | -0.93 | 2.73 | 6.99 | 12.48 | 18.32 | 24.71 | 34.65 | 44.49 | 61.09 | 77.15 | 96.81 | 118.97 | 145.22 |
| 937.0 | -11.93 | -11.28 | -10.67 | -10.11 | -9.07 | -7.67 | -5.98 | -4.13 | -1.5 | 1.86 | 5.93 | 10.97 | 16.44 | 22.46 | 31.58 | 41.03 | 56.59 | 71.63 | 89.68 | 110.59 | 135.33 |
| 938.0 | -12.1 | -11.54 | -10.94 | -10.54 | -9.4 | -8.07 | -6.52 | -4.83 | -2.32 | 0.98 | 4.76 | 9.51 | 14.61 | 20.16 | 28.76 | 37.65 | 52.25 | 66.33 | 82.99 | 102.58 | 125.68 |
| 939.0 | -12.29 | -11.61 | -11.11 | -10.73 | -9.56 | -8.4 | -6.99 | -5.39 | -3.03 | 0.24 | 3.69 | 8.14 | 13.05 | 18.31 | 26.31 | 34.47 | 48.13 | 60.94 | 76.78 | 95.08 | 116.53 |
| 940.0 | -12.2 | -11.68 | -11.25 | -10.84 | -9.7 | -8.5 | -7.21 | -5.87 | -3.55 | -0.48 | 2.77 | 6.86 | 11.51 | 16.42 | 24.04 | 31.57 | 44.56 | 56.44 | 70.9 | 88.25 | 108.13 |
| 941.0 | -12.25 | -11.68 | -11.44 | -10.97 | -9.87 | -8.71 | -7.59 | -6.31 | -3.87 | -1.07 | 1.74 | 5.62 | 10.08 | 14.6 | 21.58 | 28.75 | 40.88 | 52.05 | 65.58 | 81.78 | 100.16 |
| 942.0 | -12.29 | -11.74 | -11.63 | -11.1 | -10.04 | -8.91 | -7.93 | -6.81 | -4.24 | -1.87 | 0.87 | 4.5 | 8.81 | 12.91 | 19.28 | 26.04 | 37.45 | 47.82 | 60.53 | 75.64 | 92.71 |
| 943.0 | -12.15 | -11.8 | -11.6 | -11.1 | -10.14 | -9.04 | -8.13 | -7.15 | -4.71 | -2.44 | 0.23 | 3.63 | 7.45 | 11.49 | 17.25 | 23.45 | 34.27 | 44.05 | 55.76 | 69.8 | 85.66 |
| 944.0 | -12.24 | -11.94 | -11.7 | -11.33 | -10.29 | -9.43 | -8.47 | -7.5 | -5.18 | -2.93 | -0.49 | 2.72 | 6.24 | 10.09 | 15.65 | 21.24 | 31.33 | 40.51 | 51.58 | 64.55 | 79.36 |
| 945.0 | -12.37 | -12.08 | -11.89 | -11.42 | -10.48 | -9.6 | -8.77 | -7.97 | -5.48 | -3.62 | -1.23 | 1.82 | 5.06 | 8.83 | 13.91 | 19.2 | 28.79 | 37.42 | 47.64 | 60.07 | 73.99 |
| 946.0 | -12.49 | -12.23 | -12.03 | -11.54 | -10.67 | -9.83 | -9.09 | -8.22 | -5.78 | -4.04 | -1.96 | 1.06 | 4.03 | 7.74 | 12.73 | 17.78 | 26.65 | 34.81 | 44.56 | 56.39 | 69.45 |
| 947.0 | -12.35 | -12.16 | -12.06 | -11.53 | -10.71 | -9.78 | -9.19 | -8.45 | -5.93 | -4.43 | -2.45 | 0.61 | 3.3 | 7.05 | 11.71 | 16.86 | 25 | 32.8 | 42.08 | 53.57 | 65.96 |
| 948.0 | -12.4 | -12.05 | -12.05 | -11.67 | -10.7 | -9.87 | -9.29 | -8.56 | -6.14 | -4.7 | -2.61 | 0.11 | 2.77 | 6.52 | 11.08 | 15.95 | 23.96 | 31.4 | 40.47 | 51.66 | 63.82 |
| 949.0 | -12.36 | -12.08 | -12.08 | -11.67 | -10.69 | -9.97 | -9.2 | -8.52 | -6.26 | -4.75 | -2.72 | 0.05 | 2.57 | 6.29 | 10.68 | 15.42 | 23.35 | 30.67 | 39.83 | 50.9 | 62.58 |
| 950.0 | -12.19 | -12 | -12.03 | -11.7 | -10.65 | -9.91 | -9.13 | -8.52 | -6.4 | -4.81 | -2.6 | 0.12 | 2.5 | 6.37 | 10.64 | 15.46 | 23.33 | 30.5 | 39.87 | 50.87 | 62.49 |
| 951.0 | -12.15 | -12.11 | -11.99 | -11.67 | -10.63 | -9.95 | -9.25 | -8.37 | -6.38 | -4.81 | -2.46 | 0.17 | 2.72 | 6.32 | 10.9 | 15.73 | 23.69 | 30.84 | 40.33 | 51.39 | 63.33 |
| 952.0 | -12.11 | -12.08 | -11.85 | -11.59 | -10.51 | -9.73 | -9.1 | -8.2 | -6.25 | -4.59 | -2.31 | 0.48 | 3.15 | 6.6 | 11.33 | 16.19 | 24.48 | 31.56 | 41.36 | 52.63 | 64.8 |
| 953.0 | -12.16 | -12.11 | -11.75 | -11.41 | -10.35 | -9.6 | -9.05 | -7.98 | -6.1 | -4.35 | -2.16 | 0.76 | 3.6 | 7.04 | 11.9 | 16.74 | 25.39 | 32.72 | 42.78 | 54.36 | 66.71 |
| 954.0 | -12.1 | -12.14 | -11.72 | -11.36 | -10.3 | -9.65 | -9.09 | -7.88 | -5.94 | -4.14 | -1.99 | 1.1 | 3.93 | 7.4 | 12.57 | 17.6 | 26.36 | 33.96 | 44.17 | 55.98 | 68.83 |
| 955.0 | -12.22 | -12.31 | -11.82 | -11.38 | -10.32 | -9.67 | -9.12 | -7.9 | -5.95 | -4.11 | -1.75 | 1.39 | 4.22 | 7.79 | 13.2 | 18.4 | 27.43 | 35.25 | 45.57 | 57.86 | 71.14 |
| 956.0 | -12.17 | -12.07 | -11.71 | -11.18 | -10.19 | -9.51 | -8.97 | -7.64 | -5.75 | -3.82 | -1.49 | 1.82 | 4.87 | 8.58 | 14.04 | 19.35 | 28.74 | 36.82 | 47.45 | 60.14 | 73.69 |
| 957.0 | -12.16 | -12.07 | -11.77 | -11.2 | -10.33 | -9.58 | -8.95 | -7.54 | -5.5 | -3.69 | -1.15 | 2.2 | 5.36 | 9.13 | 14.52 | 20.19 | 29.76 | 38.28 | 49.28 | 62.1 | 76.03 |
| 958.0 | -12.18 | -12.04 | -11.76 | -11.21 | -10.24 | -9.44 | -8.92 | -7.43 | -5.33 | -3.52 | -0.87 | 2.63 | 5.81 | 9.77 | 15.4 | 21.24 | 31 | 39.7 | 51.27 | 64.24 | 78.53 |
| 959.0 | -12.26 | -11.9 | -11.82 | -11.18 | -10.17 | -9.4 | -8.92 | -7.38 | -5.13 | -3.25 | -0.64 | 3.09 | 6.17 | 10.37 | 16.12 | 22.1 | 32.13 | 41.07 | 52.97 | 66.22 | 80.82 |
| 960.0 | -12.21 | -11.9 | -11.73 | -11.09 | -10.16 | -9.3 | -8.81 | -7.15 | -4.89 | -2.95 | -0.31 | 3.51 | 6.65 | 10.83 | 16.8 | 22.99 | 33.18 | 42.5 | 54.66 | 68.16 | 83.21 |
| 961.0 | -12.28 | -11.96 | -11.72 | -11.07 | -10.17 | -9.32 | -8.73 | -7.05 | -4.75 | -2.8 | 0.04 | 3.93 | 7.11 | 11.36 | 17.37 | 23.73 | 34.15 | 43.82 | 56.23 | 69.88 | 85.21 |
| 962.0 | -12.22 | -11.83 | -11.6 | -10.92 | -10.21 | -9.16 | -8.49 | -6.81 | -4.68 | -2.71 | 0.38 | 4.3 | 7.5 | 11.89 | 18.08 | 24.54 | 35.23 | 45.06 | 57.75 | 71.49 | 87.28 |
| 963.0 | -12.16 | -11.89 | -11.57 | -11.02 | -10.24 | -9.34 | -8.42 | -6.75 | -4.62 | -2.52 | 0.46 | 4.35 | 7.71 | 12.21 | 18.7 | 25.16 | 35.98 | 46.09 | 58.72 | 72.91 | 88.95 |
| 964.0 | -12.16 | -11.88 | -11.57 | -11.04 | -10.2 | -9.27 | -8.28 | -6.65 | -4.58 | -2.34 | 0.65 | 4.49 | 8.1 | 12.47 | 19.09 | 25.73 | 36.72 | 47.01 | 59.82 | 74.34 | 90.42 |
| 965.0 | -12.06 | -11.87 | -11.5 | -10.86 | -10.13 | -9.08 | -8.01 | -6.59 | -4.52 | -2.16 | 0.91 | 4.76 | 8.48 | 12.77 | 19.49 | 26.18 | 37.53 | 47.87 | 60.84 | 75.47 | 91.79 |
| 966.0 | -12.13 | -11.79 | -11.25 | -10.85 | -10.15 | -9.07 | -7.95 | -6.5 | -4.39 | -1.82 | 1.21 | 5.09 | 8.66 | 13.16 | 19.87 | 26.58 | 38.09 | 48.62 | 61.77 | 76.24 | 92.85 |
| 967.0 | -11.96 | -11.7 | -11.31 | -10.79 | -9.98 | -8.89 | -7.83 | -6.4 | -4.36 | -1.56 | 1.47 | 5.33 | 8.97 | 13.36 | 20.13 | 26.83 | 38.59 | 49.17 | 62.32 | 76.93 | 93.69 |
| 968.0 | -11.84 | -11.7 | -11.19 | -10.62 | -9.93 | -8.85 | -7.62 | -6.23 | -4.28 | -1.41 | 1.64 | 5.56 | 9.19 | 13.55 | 20.37 | 27.14 | 39.1 | 49.64 | 62.87 | 77.27 | 94.48 |
| 969.0 | -11.8 | -11.82 | -11.22 | -10.51 | -10.01 | -8.79 | -7.62 | -6.15 | -4.24 | -1.32 | 1.75 | 5.66 | 9.5 | 13.69 | 20.53 | 27.25 | 39.09 | 49.98 | 63.32 | 77.55 | 94.67 |
| 970.0 | -11.83 | -11.77 | -11.2 | -10.39 | -9.92 | -8.73 | -7.62 | -6.01 | -4.04 | -1.26 | 1.88 | 5.71 | 9.67 | 13.8 | 20.57 | 27.47 | 39.24 | 50.19 | 63.43 | 77.64 | 94.86 |
| 971.0 | -12 | -11.84 | -11.32 | -10.39 | -9.89 | -8.85 | -7.68 | -6.09 | -4.11 | -1.3 | 1.77 | 5.5 | 9.68 | 13.63 | 20.58 | 27.4 | 39.06 | 50.18 | 63.14 | 77.47 | 94.69 |
| 972.0 | -11.95 | -11.79 | -11.2 | -10.26 | -9.87 | -8.78 | -7.5 | -6.11 | -4.09 | -1.21 | 1.8 | 5.47 | 9.71 | 13.69 | 20.47 | 27.38 | 39.11 | 50.08 | 63.08 | 77.46 | 94.35 |
| 973.0 | -12.16 | -11.87 | -11.43 | -10.39 | -10 | -9.08 | -7.59 | -6.24 | -4.16 | -1.4 | 1.68 | 5.22 | 9.39 | 13.48 | 20.21 | 27.19 | 38.76 | 49.8 | 62.58 | 76.99 | 93.88 |
| 974.0 | -12.25 | -11.94 | -11.55 | -10.56 | -10.12 | -9.2 | -7.62 | -6.38 | -4.28 | -1.65 | 1.62 | 5.12 | 9.27 | 13.44 | 19.96 | 27.12 | 38.49 | 49.53 | 62.08 | 76.29 | 93.15 |
| 975.0 | -12.37 | -12.02 | -11.69 | -10.66 | -10.36 | -9.3 | -7.68 | -6.5 | -4.36 | -1.84 | 1.56 | 4.96 | 9.13 | 13.28 | 19.58 | 26.78 | 38.13 | 49.08 | 61.54 | 75.88 | 92.27 |
| 976.0 | -12.41 | -11.92 | -11.59 | -10.64 | -10.29 | -9.33 | -7.66 | -6.47 | -4.29 | -1.93 | 1.5 | 4.71 | 9.07 | 13.19 | 19.3 | 26.53 | 37.8 | 48.55 | 61.18 | 75.21 | 91.49 |
| 977.0 | -12.47 | -12.08 | -11.81 | -10.74 | -10.55 | -9.41 | -7.76 | -6.68 | -4.41 | -2.04 | 1.33 | 4.5 | 8.85 | 12.84 | 18.86 | 26.13 | 37.3 | 47.83 | 60.4 | 74.29 | 90.6 |
| 978.0 | -12.42 | -12.08 | -11.68 | -10.66 | -10.37 | -9.38 | -7.77 | -6.62 | -4.52 | -2.07 | 1.16 | 4.34 | 8.7 | 12.54 | 18.71 | 25.78 | 36.91 | 47.14 | 59.61 | 73.45 | 89.38 |
| 979.0 | -12.55 | -12.13 | -11.77 | -10.7 | -10.45 | -9.5 | -7.68 | -6.62 | -4.55 | -2.17 | 0.97 | 4.15 | 8.54 | 12.16 | 18.32 | 25.33 | 36.38 | 46.5 | 58.63 | 72.39 | 88.09 |
| 980.0 | -12.53 | -12.14 | -11.65 | -10.6 | -10.48 | -9.43 | -7.51 | -6.49 | -4.55 | -2.27 | 0.81 | 3.94 | 8.34 | 11.9 | 18.01 | 24.88 | 35.93 | 45.92 | 57.79 | 71.27 | 86.77 |
| 981.0 | -12.44 | -12.18 | -11.68 | -10.54 | -10.51 | -9.44 | -7.56 | -6.55 | -4.52 | -2.45 | 0.66 | 3.8 | 8.14 | 11.59 | 17.62 | 24.43 | 35.47 | 45.15 | 56.96 | 69.93 | 85.45 |
| 982.0 | -12.36 | -12.23 | -11.73 | -10.62 | -10.49 | -9.49 | -7.62 | -6.65 | -4.73 | -2.6 | 0.43 | 3.51 | 7.91 | 11.24 | 17.22 | 23.89 | 34.69 | 44.06 | 55.95 | 68.72 | 84.04 |
| 983.0 | -12.43 | -12.34 | -11.8 | -10.78 | -10.52 | -9.51 | -7.68 | -6.67 | -4.81 | -2.73 | 0.26 | 3.26 | 7.63 | 10.8 | 16.79 | 23.39 | 33.89 | 43.17 | 54.79 | 67.43 | 82.57 |
| 984.0 | -12.45 | -12.26 | -11.85 | -10.75 | -10.5 | -9.46 | -7.79 | -6.72 | -4.86 | -2.77 | 0.17 | 3.24 | 7.41 | 10.47 | 16.27 | 22.97 | 33.29 | 42.13 | 53.65 | 66.09 | 81.09 |
| 985.0 | -12.47 | -12.21 | -11.88 | -10.78 | -10.48 | -9.58 | -7.87 | -6.86 | -4.88 | -2.8 | 0.03 | 3.16 | 7.14 | 10.12 | 15.97 | 22.53 | 32.78 | 41.2 | 52.67 | 64.76 | 79.59 |
| 986.0 | -12.52 | -12.08 | -11.77 | -10.76 | -10.4 | -9.58 | -7.97 | -6.95 | -4.89 | -2.89 | -0.17 | 3.07 | 6.98 | 9.99 | 15.59 | 22.14 | 32.07 | 40.52 | 51.53 | 63.45 | 77.97 |
| 987.0 | -12.42 | -12.14 | -11.94 | -10.84 | -10.34 | -9.64 | -7.98 | -6.92 | -4.99 | -3.05 | -0.52 | 2.66 | 6.74 | 9.59 | 15.18 | 21.62 | 31.3 | 39.5 | 50.46 | 62.19 | 76.33 |
| 988.0 | -12.51 | -12.29 | -12.02 | -10.96 | -10.49 | -9.82 | -8.12 | -7.15 | -5.12 | -3.39 | -0.76 | 2.39 | 6.32 | 9.21 | 14.69 | 20.9 | 30.35 | 38.53 | 49.23 | 60.71 | 74.47 |
| 989.0 | -12.68 | -12.37 | -12.11 | -11.15 | -10.58 | -9.82 | -8.38 | -7.35 | -5.31 | -3.62 | -1.04 | 1.96 | 5.95 | 8.74 | 14.1 | 20.23 | 29.43 | 37.51 | 47.97 | 59.38 | 72.7 |
| 990.0 | -12.67 | -12.38 | -12.08 | -11.15 | -10.55 | -9.87 | -8.38 | -7.5 | -5.35 | -3.82 | -1.29 | 1.9 | 5.59 | 8.32 | 13.57 | 19.8 | 28.81 | 36.41 | 46.6 | 57.94 | 71.05 |
| 991.0 | -11.18 | -12.52 | -12.19 | -8.88 | -10.56 | -8.34 | -9.21 | -7.06 | -4.8 | -3.32 | -1.15 | 2.38 | 6.89 | 6.47 | 13.24 | 19.43 | 28.67 | 34.89 | 48.78 | 53.86 | 69.68 |
| 992.0 | -11.13 | -14.78 | -12.93 | -12.36 | -9.92 | -10.01 | -7.83 | -8.93 | -8.23 | -5.8 | -2.26 | 0.73 | 5.11 | 7.77 | 12.67 | 18.17 | 25.74 | 33.17 | 45.03 | 54.96 | 67.01 |
| 993.0 | -12.44 | -11.98 | -11.77 | -11.9 | -10.72 | -7.33 | -5.92 | -5.72 | -4.24 | -4.48 | -0.97 | 2.22 | 4.07 | 6.75 | 12.57 | 19.57 | 26.89 | 34.32 | 43.7 | 53.19 | 67.31 |
| 994.0 | -13.39 | -11.41 | -14 | -12.41 | -12.01 | -11.02 | -10.2 | -8.82 | -6.23 | -3.61 | -3.15 | 0.76 | 3.22 | 5.39 | 10.84 | 16.38 | 25.88 | 29.56 | 36.74 | 50.37 | 64.22 |
| 995.0 | -11.01 | -10.63 | -11.21 | -10.36 | -8.5 | -9.84 | -7.59 | -7.71 | -4.14 | -2.11 | -1.37 | 2.39 | 5.5 | 6.44 | 12.45 | 17.92 | 28.58 | 31.98 | 43.54 | 52.31 | 64.18 |
| 996.0 | -11.71 | -10.26 | -8.94 | -10.38 | -10.33 | -9.61 | -8.12 | -8.94 | -6.6 | -3.26 | -1.74 | 2.75 | 6.01 | 8.89 | 12.81 | 17.12 | 24.33 | 34.54 | 39.59 | 49.54 | 58.77 |
| 997.0 | -12.61 | -12.25 | -12.6 | -11.87 | -10.23 | -9.09 | -8.74 | -7.57 | -4.54 | -3.78 | -3.98 | -0.64 | 3.27 | 7.06 | 10.33 | 14.59 | 21.66 | 28.44 | 38.33 | 48.28 | 60.6 |
| 998.0 | -11.85 | -14.39 | -13.06 | -12.89 | -10.56 | -11.02 | -8.82 | -9.37 | -6.73 | -5.52 | -1.24 | 0.89 | 0.44 | 5.28 | 10.99 | 12.26 | 21.09 | 29.53 | 36.43 | 46.3 | 55.86 |
| 999.0 | -12.31 | -12.18 | -11.22 | -11.45 | -10.75 | -8.36 | -9.34 | -8.5 | -7.17 | -5.32 | -3.44 | -0.79 | 3.23 | 4.15 | 9.85 | 14.52 | 22.05 | 27.72 | 35.34 | 45.51 | 57.49 |
| 1000.0 | -11.99 | -12.85 | -11.35 | -11.26 | -11.67 | -9.34 | -8.59 | -8.87 | -5.91 | -5.81 | -3.01 | 1.57 | 3.87 | 5.01 | 8.43 | 16.27 | 22.38 | 24.74 | 34.67 | 44.47 | 54.81 |